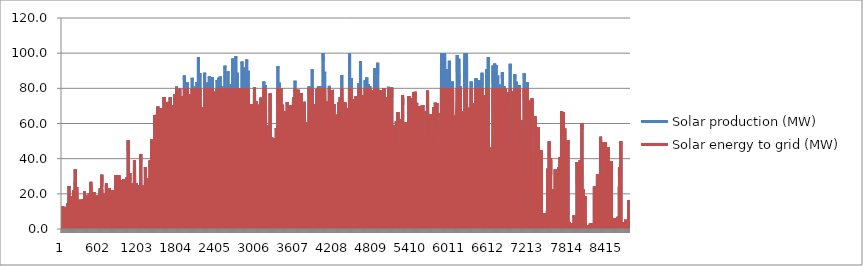
| Category | Solar production (MW) | Solar energy to grid (MW) |
|---|---|---|
| 0 | 0 | 0 |
| 1 | 0 | 0 |
| 2 | 0 | 0 |
| 3 | 0 | 0 |
| 4 | 0 | 0 |
| 5 | 0 | 0 |
| 6 | 0 | 0 |
| 7 | 0 | 0 |
| 8 | 0 | 0 |
| 9 | 7.3 | 7.3 |
| 10 | 10.9 | 10.9 |
| 11 | 12.8 | 12.8 |
| 12 | 12.2 | 12.2 |
| 13 | 9.4 | 9.4 |
| 14 | 4.1 | 4.1 |
| 15 | 0 | 0 |
| 16 | 0 | 0 |
| 17 | 0 | 0 |
| 18 | 0 | 0 |
| 19 | 0 | 0 |
| 20 | 0 | 0 |
| 21 | 0 | 0 |
| 22 | 0 | 0 |
| 23 | 0 | 0 |
| 24 | 0 | 0 |
| 25 | 0 | 0 |
| 26 | 0 | 0 |
| 27 | 0 | 0 |
| 28 | 0 | 0 |
| 29 | 0 | 0 |
| 30 | 0 | 0 |
| 31 | 0 | 0 |
| 32 | 0 | 0 |
| 33 | 6.6 | 6.6 |
| 34 | 9.9 | 9.9 |
| 35 | 11.7 | 11.7 |
| 36 | 11.2 | 11.2 |
| 37 | 8.7 | 8.7 |
| 38 | 3.9 | 3.9 |
| 39 | 0 | 0 |
| 40 | 0 | 0 |
| 41 | 0 | 0 |
| 42 | 0 | 0 |
| 43 | 0 | 0 |
| 44 | 0 | 0 |
| 45 | 0 | 0 |
| 46 | 0 | 0 |
| 47 | 0 | 0 |
| 48 | 0 | 0 |
| 49 | 0 | 0 |
| 50 | 0 | 0 |
| 51 | 0 | 0 |
| 52 | 0 | 0 |
| 53 | 0 | 0 |
| 54 | 0 | 0 |
| 55 | 0 | 0 |
| 56 | 0 | 0 |
| 57 | 7 | 7 |
| 58 | 10.4 | 10.4 |
| 59 | 12.3 | 12.3 |
| 60 | 11.9 | 11.9 |
| 61 | 9.1 | 9.1 |
| 62 | 4.3 | 4.3 |
| 63 | 0 | 0 |
| 64 | 0 | 0 |
| 65 | 0 | 0 |
| 66 | 0 | 0 |
| 67 | 0 | 0 |
| 68 | 0 | 0 |
| 69 | 0 | 0 |
| 70 | 0 | 0 |
| 71 | 0 | 0 |
| 72 | 0 | 0 |
| 73 | 0 | 0 |
| 74 | 0 | 0 |
| 75 | 0 | 0 |
| 76 | 0 | 0 |
| 77 | 0 | 0 |
| 78 | 0 | 0 |
| 79 | 0 | 0 |
| 80 | 0 | 0 |
| 81 | 8.6 | 8.6 |
| 82 | 12.4 | 12.4 |
| 83 | 14.7 | 14.7 |
| 84 | 14.2 | 14.2 |
| 85 | 11 | 11 |
| 86 | 5.4 | 5.4 |
| 87 | 0 | 0 |
| 88 | 0 | 0 |
| 89 | 0 | 0 |
| 90 | 0 | 0 |
| 91 | 0 | 0 |
| 92 | 0 | 0 |
| 93 | 0 | 0 |
| 94 | 0 | 0 |
| 95 | 0 | 0 |
| 96 | 0 | 0 |
| 97 | 0 | 0 |
| 98 | 0 | 0 |
| 99 | 0 | 0 |
| 100 | 0 | 0 |
| 101 | 0 | 0 |
| 102 | 0 | 0 |
| 103 | 0 | 0 |
| 104 | 0 | 0 |
| 105 | 15.3 | 15.3 |
| 106 | 21.1 | 21.1 |
| 107 | 24.4 | 24.4 |
| 108 | 23.7 | 23.7 |
| 109 | 18.8 | 18.8 |
| 110 | 10.1 | 10.1 |
| 111 | 0 | 0 |
| 112 | 0 | 0 |
| 113 | 0 | 0 |
| 114 | 0 | 0 |
| 115 | 0 | 0 |
| 116 | 0 | 0 |
| 117 | 0 | 0 |
| 118 | 0 | 0 |
| 119 | 0 | 0 |
| 120 | 0 | 0 |
| 121 | 0 | 0 |
| 122 | 0 | 0 |
| 123 | 0 | 0 |
| 124 | 0 | 0 |
| 125 | 0 | 0 |
| 126 | 0 | 0 |
| 127 | 0 | 0 |
| 128 | 0 | 0 |
| 129 | 11.1 | 11.1 |
| 130 | 15.8 | 15.8 |
| 131 | 18.4 | 18.4 |
| 132 | 17.9 | 17.9 |
| 133 | 14.1 | 14.1 |
| 134 | 7.6 | 7.6 |
| 135 | 0 | 0 |
| 136 | 0 | 0 |
| 137 | 0 | 0 |
| 138 | 0 | 0 |
| 139 | 0 | 0 |
| 140 | 0 | 0 |
| 141 | 0 | 0 |
| 142 | 0 | 0 |
| 143 | 0 | 0 |
| 144 | 0 | 0 |
| 145 | 0 | 0 |
| 146 | 0 | 0 |
| 147 | 0 | 0 |
| 148 | 0 | 0 |
| 149 | 0 | 0 |
| 150 | 0 | 0 |
| 151 | 0 | 0 |
| 152 | 0 | 0 |
| 153 | 8.3 | 8.3 |
| 154 | 12.2 | 12.2 |
| 155 | 14.3 | 14.3 |
| 156 | 14 | 14 |
| 157 | 11 | 11 |
| 158 | 5.9 | 5.9 |
| 159 | 0 | 0 |
| 160 | 0 | 0 |
| 161 | 0 | 0 |
| 162 | 0 | 0 |
| 163 | 0 | 0 |
| 164 | 0 | 0 |
| 165 | 0 | 0 |
| 166 | 0 | 0 |
| 167 | 0 | 0 |
| 168 | 0 | 0 |
| 169 | 0 | 0 |
| 170 | 0 | 0 |
| 171 | 0 | 0 |
| 172 | 0 | 0 |
| 173 | 0 | 0 |
| 174 | 0 | 0 |
| 175 | 0 | 0 |
| 176 | 0 | 0 |
| 177 | 13.4 | 13.4 |
| 178 | 18.8 | 18.8 |
| 179 | 21.9 | 21.9 |
| 180 | 21.3 | 21.3 |
| 181 | 17 | 17 |
| 182 | 9.6 | 9.6 |
| 183 | 0 | 0 |
| 184 | 0 | 0 |
| 185 | 0 | 0 |
| 186 | 0 | 0 |
| 187 | 0 | 0 |
| 188 | 0 | 0 |
| 189 | 0 | 0 |
| 190 | 0 | 0 |
| 191 | 0 | 0 |
| 192 | 0 | 0 |
| 193 | 0 | 0 |
| 194 | 0 | 0 |
| 195 | 0 | 0 |
| 196 | 0 | 0 |
| 197 | 0 | 0 |
| 198 | 0 | 0 |
| 199 | 0 | 0 |
| 200 | 0 | 0 |
| 201 | 21.9 | 21.9 |
| 202 | 29.4 | 29.4 |
| 203 | 33.9 | 33.9 |
| 204 | 33 | 33 |
| 205 | 26.8 | 26.8 |
| 206 | 16 | 16 |
| 207 | 0 | 0 |
| 208 | 0 | 0 |
| 209 | 0 | 0 |
| 210 | 0 | 0 |
| 211 | 0 | 0 |
| 212 | 0 | 0 |
| 213 | 0 | 0 |
| 214 | 0 | 0 |
| 215 | 0 | 0 |
| 216 | 0 | 0 |
| 217 | 0 | 0 |
| 218 | 0 | 0 |
| 219 | 0 | 0 |
| 220 | 0 | 0 |
| 221 | 0 | 0 |
| 222 | 0 | 0 |
| 223 | 0 | 0 |
| 224 | 0 | 0 |
| 225 | 14.8 | 14.8 |
| 226 | 20.6 | 20.6 |
| 227 | 23.9 | 23.9 |
| 228 | 23.3 | 23.3 |
| 229 | 18.8 | 18.8 |
| 230 | 11.1 | 11.1 |
| 231 | 0 | 0 |
| 232 | 0 | 0 |
| 233 | 0 | 0 |
| 234 | 0 | 0 |
| 235 | 0 | 0 |
| 236 | 0 | 0 |
| 237 | 0 | 0 |
| 238 | 0 | 0 |
| 239 | 0 | 0 |
| 240 | 0 | 0 |
| 241 | 0 | 0 |
| 242 | 0 | 0 |
| 243 | 0 | 0 |
| 244 | 0 | 0 |
| 245 | 0 | 0 |
| 246 | 0 | 0 |
| 247 | 0 | 0 |
| 248 | 0 | 0 |
| 249 | 7.3 | 7.3 |
| 250 | 10.9 | 10.9 |
| 251 | 12.9 | 12.9 |
| 252 | 12.7 | 12.7 |
| 253 | 10.1 | 10.1 |
| 254 | 5.7 | 5.7 |
| 255 | 0 | 0 |
| 256 | 0 | 0 |
| 257 | 0 | 0 |
| 258 | 0 | 0 |
| 259 | 0 | 0 |
| 260 | 0 | 0 |
| 261 | 0 | 0 |
| 262 | 0 | 0 |
| 263 | 0 | 0 |
| 264 | 0 | 0 |
| 265 | 0 | 0 |
| 266 | 0 | 0 |
| 267 | 0 | 0 |
| 268 | 0 | 0 |
| 269 | 0 | 0 |
| 270 | 0 | 0 |
| 271 | 0 | 0 |
| 272 | 0 | 0 |
| 273 | 9.7 | 9.7 |
| 274 | 14 | 14 |
| 275 | 16.6 | 16.6 |
| 276 | 16.2 | 16.2 |
| 277 | 13 | 13 |
| 278 | 7.7 | 7.7 |
| 279 | 0 | 0 |
| 280 | 0 | 0 |
| 281 | 0 | 0 |
| 282 | 0 | 0 |
| 283 | 0 | 0 |
| 284 | 0 | 0 |
| 285 | 0 | 0 |
| 286 | 0 | 0 |
| 287 | 0 | 0 |
| 288 | 0 | 0 |
| 289 | 0 | 0 |
| 290 | 0 | 0 |
| 291 | 0 | 0 |
| 292 | 0 | 0 |
| 293 | 0 | 0 |
| 294 | 0 | 0 |
| 295 | 0 | 0 |
| 296 | 0 | 0 |
| 297 | 9.4 | 9.4 |
| 298 | 13.6 | 13.6 |
| 299 | 16 | 16 |
| 300 | 15.7 | 15.7 |
| 301 | 12.7 | 12.7 |
| 302 | 7.6 | 7.6 |
| 303 | 0 | 0 |
| 304 | 0 | 0 |
| 305 | 0 | 0 |
| 306 | 0 | 0 |
| 307 | 0 | 0 |
| 308 | 0 | 0 |
| 309 | 0 | 0 |
| 310 | 0 | 0 |
| 311 | 0 | 0 |
| 312 | 0 | 0 |
| 313 | 0 | 0 |
| 314 | 0 | 0 |
| 315 | 0 | 0 |
| 316 | 0 | 0 |
| 317 | 0 | 0 |
| 318 | 0 | 0 |
| 319 | 0 | 0 |
| 320 | 0 | 0 |
| 321 | 10 | 10 |
| 322 | 14.3 | 14.3 |
| 323 | 16.9 | 16.9 |
| 324 | 16.7 | 16.7 |
| 325 | 13.4 | 13.4 |
| 326 | 8.1 | 8.1 |
| 327 | 0 | 0 |
| 328 | 0 | 0 |
| 329 | 0 | 0 |
| 330 | 0 | 0 |
| 331 | 0 | 0 |
| 332 | 0 | 0 |
| 333 | 0 | 0 |
| 334 | 0 | 0 |
| 335 | 0 | 0 |
| 336 | 0 | 0 |
| 337 | 0 | 0 |
| 338 | 0 | 0 |
| 339 | 0 | 0 |
| 340 | 0 | 0 |
| 341 | 0 | 0 |
| 342 | 0 | 0 |
| 343 | 0 | 0 |
| 344 | 0 | 0 |
| 345 | 13 | 13 |
| 346 | 18.3 | 18.3 |
| 347 | 21.4 | 21.4 |
| 348 | 21.1 | 21.1 |
| 349 | 17.2 | 17.2 |
| 350 | 10.7 | 10.7 |
| 351 | 0 | 0 |
| 352 | 0 | 0 |
| 353 | 0 | 0 |
| 354 | 0 | 0 |
| 355 | 0 | 0 |
| 356 | 0 | 0 |
| 357 | 0 | 0 |
| 358 | 0 | 0 |
| 359 | 0 | 0 |
| 360 | 0 | 0 |
| 361 | 0 | 0 |
| 362 | 0 | 0 |
| 363 | 0 | 0 |
| 364 | 0 | 0 |
| 365 | 0 | 0 |
| 366 | 0 | 0 |
| 367 | 0 | 0 |
| 368 | 0 | 0 |
| 369 | 11.3 | 11.3 |
| 370 | 16.1 | 16.1 |
| 371 | 18.9 | 18.9 |
| 372 | 18.7 | 18.7 |
| 373 | 15.2 | 15.2 |
| 374 | 9.4 | 9.4 |
| 375 | 0 | 0 |
| 376 | 0 | 0 |
| 377 | 0 | 0 |
| 378 | 0 | 0 |
| 379 | 0 | 0 |
| 380 | 0 | 0 |
| 381 | 0 | 0 |
| 382 | 0 | 0 |
| 383 | 0 | 0 |
| 384 | 0 | 0 |
| 385 | 0 | 0 |
| 386 | 0 | 0 |
| 387 | 0 | 0 |
| 388 | 0 | 0 |
| 389 | 0 | 0 |
| 390 | 0 | 0 |
| 391 | 0 | 0 |
| 392 | 0 | 0 |
| 393 | 9.2 | 9.2 |
| 394 | 13.3 | 13.3 |
| 395 | 15.8 | 15.8 |
| 396 | 15.6 | 15.6 |
| 397 | 12.7 | 12.7 |
| 398 | 7.8 | 7.8 |
| 399 | 0 | 0 |
| 400 | 0 | 0 |
| 401 | 0 | 0 |
| 402 | 0 | 0 |
| 403 | 0 | 0 |
| 404 | 0 | 0 |
| 405 | 0 | 0 |
| 406 | 0 | 0 |
| 407 | 0 | 0 |
| 408 | 0 | 0 |
| 409 | 0 | 0 |
| 410 | 0 | 0 |
| 411 | 0 | 0 |
| 412 | 0 | 0 |
| 413 | 0 | 0 |
| 414 | 0 | 0 |
| 415 | 0 | 0 |
| 416 | 0 | 0 |
| 417 | 12.1 | 12.1 |
| 418 | 17.2 | 17.2 |
| 419 | 20.2 | 20.2 |
| 420 | 20 | 20 |
| 421 | 16.4 | 16.4 |
| 422 | 10.4 | 10.4 |
| 423 | 0 | 0 |
| 424 | 0 | 0 |
| 425 | 0 | 0 |
| 426 | 0 | 0 |
| 427 | 0 | 0 |
| 428 | 0 | 0 |
| 429 | 0 | 0 |
| 430 | 0 | 0 |
| 431 | 0 | 0 |
| 432 | 0 | 0 |
| 433 | 0 | 0 |
| 434 | 0 | 0 |
| 435 | 0 | 0 |
| 436 | 0 | 0 |
| 437 | 0 | 0 |
| 438 | 0 | 0 |
| 439 | 0 | 0 |
| 440 | 0 | 0 |
| 441 | 16.4 | 16.4 |
| 442 | 22.9 | 22.9 |
| 443 | 26.8 | 26.8 |
| 444 | 26.4 | 26.4 |
| 445 | 21.9 | 21.9 |
| 446 | 14.3 | 14.3 |
| 447 | 0 | 0 |
| 448 | 0 | 0 |
| 449 | 0 | 0 |
| 450 | 0 | 0 |
| 451 | 0 | 0 |
| 452 | 0 | 0 |
| 453 | 0 | 0 |
| 454 | 0 | 0 |
| 455 | 0 | 0 |
| 456 | 0 | 0 |
| 457 | 0 | 0 |
| 458 | 0 | 0 |
| 459 | 0 | 0 |
| 460 | 0 | 0 |
| 461 | 0 | 0 |
| 462 | 0 | 0 |
| 463 | 0 | 0 |
| 464 | 0 | 0 |
| 465 | 8.3 | 8.3 |
| 466 | 12.2 | 12.2 |
| 467 | 14.4 | 14.4 |
| 468 | 14.2 | 14.2 |
| 469 | 11.7 | 11.7 |
| 470 | 7.4 | 7.4 |
| 471 | 0 | 0 |
| 472 | 0 | 0 |
| 473 | 0 | 0 |
| 474 | 0 | 0 |
| 475 | 0 | 0 |
| 476 | 0 | 0 |
| 477 | 0 | 0 |
| 478 | 0 | 0 |
| 479 | 0 | 0 |
| 480 | 0 | 0 |
| 481 | 0 | 0 |
| 482 | 0 | 0 |
| 483 | 0 | 0 |
| 484 | 0 | 0 |
| 485 | 0 | 0 |
| 486 | 0 | 0 |
| 487 | 0 | 0 |
| 488 | 0 | 0 |
| 489 | 12.6 | 12.6 |
| 490 | 17.8 | 17.8 |
| 491 | 21 | 21 |
| 492 | 20.8 | 20.8 |
| 493 | 17.2 | 17.2 |
| 494 | 11.2 | 11.2 |
| 495 | 0 | 0 |
| 496 | 0 | 0 |
| 497 | 0 | 0 |
| 498 | 0 | 0 |
| 499 | 0 | 0 |
| 500 | 0 | 0 |
| 501 | 0 | 0 |
| 502 | 0 | 0 |
| 503 | 0 | 0 |
| 504 | 0 | 0 |
| 505 | 0 | 0 |
| 506 | 0 | 0 |
| 507 | 0 | 0 |
| 508 | 0 | 0 |
| 509 | 0 | 0 |
| 510 | 0 | 0 |
| 511 | 0 | 0 |
| 512 | 0 | 0 |
| 513 | 10.3 | 10.3 |
| 514 | 14.9 | 14.9 |
| 515 | 17.6 | 17.6 |
| 516 | 17.4 | 17.4 |
| 517 | 14.4 | 14.4 |
| 518 | 9.4 | 9.4 |
| 519 | 0 | 0 |
| 520 | 0 | 0 |
| 521 | 0 | 0 |
| 522 | 0 | 0 |
| 523 | 0 | 0 |
| 524 | 0 | 0 |
| 525 | 0 | 0 |
| 526 | 0 | 0 |
| 527 | 0 | 0 |
| 528 | 0 | 0 |
| 529 | 0 | 0 |
| 530 | 0 | 0 |
| 531 | 0 | 0 |
| 532 | 0 | 0 |
| 533 | 0 | 0 |
| 534 | 0 | 0 |
| 535 | 0 | 0 |
| 536 | 0 | 0 |
| 537 | 11.4 | 11.4 |
| 538 | 16.3 | 16.3 |
| 539 | 19.2 | 19.2 |
| 540 | 19.1 | 19.1 |
| 541 | 15.9 | 15.9 |
| 542 | 10.4 | 10.4 |
| 543 | 1.6 | 1.6 |
| 544 | 0 | 0 |
| 545 | 0 | 0 |
| 546 | 0 | 0 |
| 547 | 0 | 0 |
| 548 | 0 | 0 |
| 549 | 0 | 0 |
| 550 | 0 | 0 |
| 551 | 0 | 0 |
| 552 | 0 | 0 |
| 553 | 0 | 0 |
| 554 | 0 | 0 |
| 555 | 0 | 0 |
| 556 | 0 | 0 |
| 557 | 0 | 0 |
| 558 | 0 | 0 |
| 559 | 0 | 0 |
| 560 | 0 | 0 |
| 561 | 9.7 | 9.7 |
| 562 | 14 | 14 |
| 563 | 16.6 | 16.6 |
| 564 | 16.4 | 16.4 |
| 565 | 13.7 | 13.7 |
| 566 | 9 | 9 |
| 567 | 2 | 2 |
| 568 | 0 | 0 |
| 569 | 0 | 0 |
| 570 | 0 | 0 |
| 571 | 0 | 0 |
| 572 | 0 | 0 |
| 573 | 0 | 0 |
| 574 | 0 | 0 |
| 575 | 0 | 0 |
| 576 | 0 | 0 |
| 577 | 0 | 0 |
| 578 | 0 | 0 |
| 579 | 0 | 0 |
| 580 | 0 | 0 |
| 581 | 0 | 0 |
| 582 | 0 | 0 |
| 583 | 0 | 0 |
| 584 | 0 | 0 |
| 585 | 14 | 14 |
| 586 | 19.7 | 19.7 |
| 587 | 23.1 | 23.1 |
| 588 | 23 | 23 |
| 589 | 19.3 | 19.3 |
| 590 | 13 | 13 |
| 591 | 3.9 | 3.9 |
| 592 | 0 | 0 |
| 593 | 0 | 0 |
| 594 | 0 | 0 |
| 595 | 0 | 0 |
| 596 | 0 | 0 |
| 597 | 0 | 0 |
| 598 | 0 | 0 |
| 599 | 0 | 0 |
| 600 | 0 | 0 |
| 601 | 0 | 0 |
| 602 | 0 | 0 |
| 603 | 0 | 0 |
| 604 | 0 | 0 |
| 605 | 0 | 0 |
| 606 | 0 | 0 |
| 607 | 0 | 0 |
| 608 | 0 | 0 |
| 609 | 19.2 | 19.2 |
| 610 | 26.6 | 26.6 |
| 611 | 30.9 | 30.9 |
| 612 | 30.8 | 30.8 |
| 613 | 26 | 26 |
| 614 | 17.8 | 17.8 |
| 615 | 6.4 | 6.4 |
| 616 | 0 | 0 |
| 617 | 0 | 0 |
| 618 | 0 | 0 |
| 619 | 0 | 0 |
| 620 | 0 | 0 |
| 621 | 0 | 0 |
| 622 | 0 | 0 |
| 623 | 0 | 0 |
| 624 | 0 | 0 |
| 625 | 0 | 0 |
| 626 | 0 | 0 |
| 627 | 0 | 0 |
| 628 | 0 | 0 |
| 629 | 0 | 0 |
| 630 | 0 | 0 |
| 631 | 0 | 0 |
| 632 | 0 | 0 |
| 633 | 12.1 | 12.1 |
| 634 | 17.2 | 17.2 |
| 635 | 20.2 | 20.2 |
| 636 | 20.1 | 20.1 |
| 637 | 17 | 17 |
| 638 | 11.4 | 11.4 |
| 639 | 4.2 | 4.2 |
| 640 | 0 | 0 |
| 641 | 0 | 0 |
| 642 | 0 | 0 |
| 643 | 0 | 0 |
| 644 | 0 | 0 |
| 645 | 0 | 0 |
| 646 | 0 | 0 |
| 647 | 0 | 0 |
| 648 | 0 | 0 |
| 649 | 0 | 0 |
| 650 | 0 | 0 |
| 651 | 0 | 0 |
| 652 | 0 | 0 |
| 653 | 0 | 0 |
| 654 | 0 | 0 |
| 655 | 0 | 0 |
| 656 | 0 | 0 |
| 657 | 9.2 | 9.2 |
| 658 | 13.3 | 13.3 |
| 659 | 15.8 | 15.8 |
| 660 | 15.7 | 15.7 |
| 661 | 13.2 | 13.2 |
| 662 | 8.8 | 8.8 |
| 663 | 3.3 | 3.3 |
| 664 | 0 | 0 |
| 665 | 0 | 0 |
| 666 | 0 | 0 |
| 667 | 0 | 0 |
| 668 | 0 | 0 |
| 669 | 0 | 0 |
| 670 | 0 | 0 |
| 671 | 0 | 0 |
| 672 | 0 | 0 |
| 673 | 0 | 0 |
| 674 | 0 | 0 |
| 675 | 0 | 0 |
| 676 | 0 | 0 |
| 677 | 0 | 0 |
| 678 | 0 | 0 |
| 679 | 0 | 0 |
| 680 | 0 | 0 |
| 681 | 16 | 16 |
| 682 | 22.4 | 22.4 |
| 683 | 26.2 | 26.2 |
| 684 | 26.1 | 26.1 |
| 685 | 22.2 | 22.2 |
| 686 | 15.3 | 15.3 |
| 687 | 6.8 | 6.8 |
| 688 | 0 | 0 |
| 689 | 0 | 0 |
| 690 | 0 | 0 |
| 691 | 0 | 0 |
| 692 | 0 | 0 |
| 693 | 0 | 0 |
| 694 | 0 | 0 |
| 695 | 0 | 0 |
| 696 | 0 | 0 |
| 697 | 0 | 0 |
| 698 | 0 | 0 |
| 699 | 0 | 0 |
| 700 | 0 | 0 |
| 701 | 0 | 0 |
| 702 | 0 | 0 |
| 703 | 0 | 0 |
| 704 | 7 | 7 |
| 705 | 11.1 | 11.1 |
| 706 | 15.9 | 15.9 |
| 707 | 18.6 | 18.6 |
| 708 | 18.6 | 18.6 |
| 709 | 15.8 | 15.8 |
| 710 | 10.8 | 10.8 |
| 711 | 4.7 | 4.7 |
| 712 | 0 | 0 |
| 713 | 0 | 0 |
| 714 | 0 | 0 |
| 715 | 0 | 0 |
| 716 | 0 | 0 |
| 717 | 0 | 0 |
| 718 | 0 | 0 |
| 719 | 0 | 0 |
| 720 | 0 | 0 |
| 721 | 0 | 0 |
| 722 | 0 | 0 |
| 723 | 0 | 0 |
| 724 | 0 | 0 |
| 725 | 0 | 0 |
| 726 | 0 | 0 |
| 727 | 0 | 0 |
| 728 | 9.3 | 9.3 |
| 729 | 14.2 | 14.2 |
| 730 | 20.1 | 20.1 |
| 731 | 23.3 | 23.3 |
| 732 | 23.3 | 23.3 |
| 733 | 19.9 | 19.9 |
| 734 | 13.9 | 13.9 |
| 735 | 6.4 | 6.4 |
| 736 | 0 | 0 |
| 737 | 0 | 0 |
| 738 | 0 | 0 |
| 739 | 0 | 0 |
| 740 | 0 | 0 |
| 741 | 0 | 0 |
| 742 | 0 | 0 |
| 743 | 0 | 0 |
| 744 | 0 | 0 |
| 745 | 0 | 0 |
| 746 | 0 | 0 |
| 747 | 0 | 0 |
| 748 | 0 | 0 |
| 749 | 0 | 0 |
| 750 | 0 | 0 |
| 751 | 0 | 0 |
| 752 | 7.7 | 7.7 |
| 753 | 12.3 | 12.3 |
| 754 | 17.4 | 17.4 |
| 755 | 20.3 | 20.3 |
| 756 | 20.3 | 20.3 |
| 757 | 17.4 | 17.4 |
| 758 | 12.1 | 12.1 |
| 759 | 5.7 | 5.7 |
| 760 | 0 | 0 |
| 761 | 0 | 0 |
| 762 | 0 | 0 |
| 763 | 0 | 0 |
| 764 | 0 | 0 |
| 765 | 0 | 0 |
| 766 | 0 | 0 |
| 767 | 0 | 0 |
| 768 | 0 | 0 |
| 769 | 0 | 0 |
| 770 | 0 | 0 |
| 771 | 0 | 0 |
| 772 | 0 | 0 |
| 773 | 0 | 0 |
| 774 | 0 | 0 |
| 775 | 0 | 0 |
| 776 | 8.2 | 8.2 |
| 777 | 13.4 | 13.4 |
| 778 | 18.9 | 18.9 |
| 779 | 22 | 22 |
| 780 | 22 | 22 |
| 781 | 18.9 | 18.9 |
| 782 | 13.2 | 13.2 |
| 783 | 6.3 | 6.3 |
| 784 | 0 | 0 |
| 785 | 0 | 0 |
| 786 | 0 | 0 |
| 787 | 0 | 0 |
| 788 | 0 | 0 |
| 789 | 0 | 0 |
| 790 | 0 | 0 |
| 791 | 0 | 0 |
| 792 | 0 | 0 |
| 793 | 0 | 0 |
| 794 | 0 | 0 |
| 795 | 0 | 0 |
| 796 | 0 | 0 |
| 797 | 0 | 0 |
| 798 | 0 | 0 |
| 799 | 0 | 0 |
| 800 | 6.9 | 6.9 |
| 801 | 11.7 | 11.7 |
| 802 | 16.4 | 16.4 |
| 803 | 19.1 | 19.1 |
| 804 | 19.2 | 19.2 |
| 805 | 16.4 | 16.4 |
| 806 | 11.6 | 11.6 |
| 807 | 5.6 | 5.6 |
| 808 | 0 | 0 |
| 809 | 0 | 0 |
| 810 | 0 | 0 |
| 811 | 0 | 0 |
| 812 | 0 | 0 |
| 813 | 0 | 0 |
| 814 | 0 | 0 |
| 815 | 0 | 0 |
| 816 | 0 | 0 |
| 817 | 0 | 0 |
| 818 | 0 | 0 |
| 819 | 0 | 0 |
| 820 | 0 | 0 |
| 821 | 0 | 0 |
| 822 | 0 | 0 |
| 823 | 0 | 0 |
| 824 | 12.2 | 12.2 |
| 825 | 19.2 | 19.2 |
| 826 | 26.4 | 26.4 |
| 827 | 30.7 | 30.7 |
| 828 | 30.7 | 30.7 |
| 829 | 26.4 | 26.4 |
| 830 | 18.9 | 18.9 |
| 831 | 9.9 | 9.9 |
| 832 | 0 | 0 |
| 833 | 0 | 0 |
| 834 | 0 | 0 |
| 835 | 0 | 0 |
| 836 | 0 | 0 |
| 837 | 0 | 0 |
| 838 | 0 | 0 |
| 839 | 0 | 0 |
| 840 | 0 | 0 |
| 841 | 0 | 0 |
| 842 | 0 | 0 |
| 843 | 0 | 0 |
| 844 | 0 | 0 |
| 845 | 0 | 0 |
| 846 | 0 | 0 |
| 847 | 0 | 0 |
| 848 | 4.6 | 4.6 |
| 849 | 8.4 | 8.4 |
| 850 | 12 | 12 |
| 851 | 14.1 | 14.1 |
| 852 | 14.1 | 14.1 |
| 853 | 12.1 | 12.1 |
| 854 | 8.4 | 8.4 |
| 855 | 4.1 | 4.1 |
| 856 | 0 | 0 |
| 857 | 0 | 0 |
| 858 | 0 | 0 |
| 859 | 0 | 0 |
| 860 | 0 | 0 |
| 861 | 0 | 0 |
| 862 | 0 | 0 |
| 863 | 0 | 0 |
| 864 | 0 | 0 |
| 865 | 0 | 0 |
| 866 | 0 | 0 |
| 867 | 0 | 0 |
| 868 | 0 | 0 |
| 869 | 0 | 0 |
| 870 | 0 | 0 |
| 871 | 0 | 0 |
| 872 | 11.9 | 11.9 |
| 873 | 19.2 | 19.2 |
| 874 | 26.4 | 26.4 |
| 875 | 30.6 | 30.6 |
| 876 | 30.6 | 30.6 |
| 877 | 26.4 | 26.4 |
| 878 | 19.1 | 19.1 |
| 879 | 10.2 | 10.2 |
| 880 | 0 | 0 |
| 881 | 0 | 0 |
| 882 | 0 | 0 |
| 883 | 0 | 0 |
| 884 | 0 | 0 |
| 885 | 0 | 0 |
| 886 | 0 | 0 |
| 887 | 0 | 0 |
| 888 | 0 | 0 |
| 889 | 0 | 0 |
| 890 | 0 | 0 |
| 891 | 0 | 0 |
| 892 | 0 | 0 |
| 893 | 0 | 0 |
| 894 | 0 | 0 |
| 895 | 0 | 0 |
| 896 | 10.7 | 10.7 |
| 897 | 17.6 | 17.6 |
| 898 | 24.2 | 24.2 |
| 899 | 27.9 | 27.9 |
| 900 | 27.9 | 27.9 |
| 901 | 24.2 | 24.2 |
| 902 | 17.6 | 17.6 |
| 903 | 9.4 | 9.4 |
| 904 | 0 | 0 |
| 905 | 0 | 0 |
| 906 | 0 | 0 |
| 907 | 0 | 0 |
| 908 | 0 | 0 |
| 909 | 0 | 0 |
| 910 | 0 | 0 |
| 911 | 0 | 0 |
| 912 | 0 | 0 |
| 913 | 0 | 0 |
| 914 | 0 | 0 |
| 915 | 0 | 0 |
| 916 | 0 | 0 |
| 917 | 0 | 0 |
| 918 | 0 | 0 |
| 919 | 0 | 0 |
| 920 | 4.9 | 4.9 |
| 921 | 9 | 9 |
| 922 | 12.7 | 12.7 |
| 923 | 14.7 | 14.7 |
| 924 | 14.8 | 14.8 |
| 925 | 12.8 | 12.8 |
| 926 | 9.1 | 9.1 |
| 927 | 4.6 | 4.6 |
| 928 | 0 | 0 |
| 929 | 0 | 0 |
| 930 | 0 | 0 |
| 931 | 0 | 0 |
| 932 | 0 | 0 |
| 933 | 0 | 0 |
| 934 | 0 | 0 |
| 935 | 0 | 0 |
| 936 | 0 | 0 |
| 937 | 0 | 0 |
| 938 | 0 | 0 |
| 939 | 0 | 0 |
| 940 | 0 | 0 |
| 941 | 0 | 0 |
| 942 | 0 | 0 |
| 943 | 0 | 0 |
| 944 | 10.8 | 10.8 |
| 945 | 18.1 | 18.1 |
| 946 | 24.8 | 24.8 |
| 947 | 28.4 | 28.4 |
| 948 | 28.4 | 28.4 |
| 949 | 24.9 | 24.9 |
| 950 | 18.1 | 18.1 |
| 951 | 9.9 | 9.9 |
| 952 | 0 | 0 |
| 953 | 0 | 0 |
| 954 | 0 | 0 |
| 955 | 0 | 0 |
| 956 | 0 | 0 |
| 957 | 0 | 0 |
| 958 | 0 | 0 |
| 959 | 0 | 0 |
| 960 | 0 | 0 |
| 961 | 0 | 0 |
| 962 | 0 | 0 |
| 963 | 0 | 0 |
| 964 | 0 | 0 |
| 965 | 0 | 0 |
| 966 | 0 | 0 |
| 967 | 0 | 0 |
| 968 | 8.3 | 8.3 |
| 969 | 14.4 | 14.4 |
| 970 | 19.9 | 19.9 |
| 971 | 22.9 | 22.9 |
| 972 | 22.9 | 22.9 |
| 973 | 20 | 20 |
| 974 | 14.6 | 14.6 |
| 975 | 7.9 | 7.9 |
| 976 | 0 | 0 |
| 977 | 0 | 0 |
| 978 | 0 | 0 |
| 979 | 0 | 0 |
| 980 | 0 | 0 |
| 981 | 0 | 0 |
| 982 | 0 | 0 |
| 983 | 0 | 0 |
| 984 | 0 | 0 |
| 985 | 0 | 0 |
| 986 | 0 | 0 |
| 987 | 0 | 0 |
| 988 | 0 | 0 |
| 989 | 0 | 0 |
| 990 | 0 | 0 |
| 991 | 0 | 0 |
| 992 | 11.2 | 11.2 |
| 993 | 18.9 | 18.9 |
| 994 | 25.6 | 25.6 |
| 995 | 29.3 | 29.3 |
| 996 | 29.4 | 29.4 |
| 997 | 25.8 | 25.8 |
| 998 | 19 | 19 |
| 999 | 10.7 | 10.7 |
| 1000 | 0 | 0 |
| 1001 | 0 | 0 |
| 1002 | 0 | 0 |
| 1003 | 0 | 0 |
| 1004 | 0 | 0 |
| 1005 | 0 | 0 |
| 1006 | 0 | 0 |
| 1007 | 0 | 0 |
| 1008 | 0 | 0 |
| 1009 | 0 | 0 |
| 1010 | 0 | 0 |
| 1011 | 0 | 0 |
| 1012 | 0 | 0 |
| 1013 | 0 | 0 |
| 1014 | 0 | 0 |
| 1015 | 0 | 0 |
| 1016 | 21 | 21 |
| 1017 | 33.3 | 33.3 |
| 1018 | 44.3 | 44.3 |
| 1019 | 50.4 | 50.4 |
| 1020 | 50.4 | 50.4 |
| 1021 | 44.4 | 44.4 |
| 1022 | 33.3 | 33.3 |
| 1023 | 19.4 | 19.4 |
| 1024 | 0 | 0 |
| 1025 | 0 | 0 |
| 1026 | 0 | 0 |
| 1027 | 0 | 0 |
| 1028 | 0 | 0 |
| 1029 | 0 | 0 |
| 1030 | 0 | 0 |
| 1031 | 0 | 0 |
| 1032 | 0 | 0 |
| 1033 | 0 | 0 |
| 1034 | 0 | 0 |
| 1035 | 0 | 0 |
| 1036 | 0 | 0 |
| 1037 | 0 | 0 |
| 1038 | 0 | 0 |
| 1039 | 0 | 0 |
| 1040 | 12.6 | 12.6 |
| 1041 | 20.8 | 20.8 |
| 1042 | 28 | 28 |
| 1043 | 31.9 | 31.9 |
| 1044 | 32 | 32 |
| 1045 | 28.1 | 28.1 |
| 1046 | 21 | 21 |
| 1047 | 12 | 12 |
| 1048 | 0 | 0 |
| 1049 | 0 | 0 |
| 1050 | 0 | 0 |
| 1051 | 0 | 0 |
| 1052 | 0 | 0 |
| 1053 | 0 | 0 |
| 1054 | 0 | 0 |
| 1055 | 0 | 0 |
| 1056 | 0 | 0 |
| 1057 | 0 | 0 |
| 1058 | 0 | 0 |
| 1059 | 0 | 0 |
| 1060 | 0 | 0 |
| 1061 | 0 | 0 |
| 1062 | 0 | 0 |
| 1063 | 0 | 0 |
| 1064 | 9.9 | 9.9 |
| 1065 | 16.8 | 16.8 |
| 1066 | 22.7 | 22.7 |
| 1067 | 25.9 | 25.9 |
| 1068 | 25.9 | 25.9 |
| 1069 | 22.8 | 22.8 |
| 1070 | 17 | 17 |
| 1071 | 9.7 | 9.7 |
| 1072 | 0 | 0 |
| 1073 | 0 | 0 |
| 1074 | 0 | 0 |
| 1075 | 0 | 0 |
| 1076 | 0 | 0 |
| 1077 | 0 | 0 |
| 1078 | 0 | 0 |
| 1079 | 0 | 0 |
| 1080 | 0 | 0 |
| 1081 | 0 | 0 |
| 1082 | 0 | 0 |
| 1083 | 0 | 0 |
| 1084 | 0 | 0 |
| 1085 | 0 | 0 |
| 1086 | 0 | 0 |
| 1087 | 0 | 0 |
| 1088 | 8.3 | 8.3 |
| 1089 | 14.4 | 14.4 |
| 1090 | 19.4 | 19.4 |
| 1091 | 22.2 | 22.2 |
| 1092 | 22.2 | 22.2 |
| 1093 | 19.7 | 19.7 |
| 1094 | 14.7 | 14.7 |
| 1095 | 8.3 | 8.3 |
| 1096 | 0 | 0 |
| 1097 | 0 | 0 |
| 1098 | 0 | 0 |
| 1099 | 0 | 0 |
| 1100 | 0 | 0 |
| 1101 | 0 | 0 |
| 1102 | 0 | 0 |
| 1103 | 0 | 0 |
| 1104 | 0 | 0 |
| 1105 | 0 | 0 |
| 1106 | 0 | 0 |
| 1107 | 0 | 0 |
| 1108 | 0 | 0 |
| 1109 | 0 | 0 |
| 1110 | 0 | 0 |
| 1111 | 0 | 0 |
| 1112 | 15.9 | 15.9 |
| 1113 | 26 | 26 |
| 1114 | 34.4 | 34.4 |
| 1115 | 39.1 | 39.1 |
| 1116 | 39.2 | 39.2 |
| 1117 | 34.7 | 34.7 |
| 1118 | 26.2 | 26.2 |
| 1119 | 15.6 | 15.6 |
| 1120 | 3.8 | 3.8 |
| 1121 | 0 | 0 |
| 1122 | 0 | 0 |
| 1123 | 0 | 0 |
| 1124 | 0 | 0 |
| 1125 | 0 | 0 |
| 1126 | 0 | 0 |
| 1127 | 0 | 0 |
| 1128 | 0 | 0 |
| 1129 | 0 | 0 |
| 1130 | 0 | 0 |
| 1131 | 0 | 0 |
| 1132 | 0 | 0 |
| 1133 | 0 | 0 |
| 1134 | 0 | 0 |
| 1135 | 0 | 0 |
| 1136 | 10.2 | 10.2 |
| 1137 | 17.1 | 17.1 |
| 1138 | 22.9 | 22.9 |
| 1139 | 26 | 26 |
| 1140 | 26.1 | 26.1 |
| 1141 | 23.1 | 23.1 |
| 1142 | 17.4 | 17.4 |
| 1143 | 10.1 | 10.1 |
| 1144 | 2.6 | 2.6 |
| 1145 | 0 | 0 |
| 1146 | 0 | 0 |
| 1147 | 0 | 0 |
| 1148 | 0 | 0 |
| 1149 | 0 | 0 |
| 1150 | 0 | 0 |
| 1151 | 0 | 0 |
| 1152 | 0 | 0 |
| 1153 | 0 | 0 |
| 1154 | 0 | 0 |
| 1155 | 0 | 0 |
| 1156 | 0 | 0 |
| 1157 | 0 | 0 |
| 1158 | 0 | 0 |
| 1159 | 0 | 0 |
| 1160 | 9.7 | 9.7 |
| 1161 | 16.2 | 16.2 |
| 1162 | 21.7 | 21.7 |
| 1163 | 24.7 | 24.7 |
| 1164 | 24.7 | 24.7 |
| 1165 | 21.9 | 21.9 |
| 1166 | 16.6 | 16.6 |
| 1167 | 9.7 | 9.7 |
| 1168 | 2.8 | 2.8 |
| 1169 | 0 | 0 |
| 1170 | 0 | 0 |
| 1171 | 0 | 0 |
| 1172 | 0 | 0 |
| 1173 | 0 | 0 |
| 1174 | 0 | 0 |
| 1175 | 0 | 0 |
| 1176 | 0 | 0 |
| 1177 | 0 | 0 |
| 1178 | 0 | 0 |
| 1179 | 0 | 0 |
| 1180 | 0 | 0 |
| 1181 | 0 | 0 |
| 1182 | 0 | 0 |
| 1183 | 0 | 0 |
| 1184 | 8.2 | 8.2 |
| 1185 | 13.9 | 13.9 |
| 1186 | 18.4 | 18.4 |
| 1187 | 20.9 | 20.9 |
| 1188 | 21 | 21 |
| 1189 | 18.6 | 18.6 |
| 1190 | 14.1 | 14.1 |
| 1191 | 8.3 | 8.3 |
| 1192 | 2.4 | 2.4 |
| 1193 | 0 | 0 |
| 1194 | 0 | 0 |
| 1195 | 0 | 0 |
| 1196 | 0 | 0 |
| 1197 | 0 | 0 |
| 1198 | 0 | 0 |
| 1199 | 0 | 0 |
| 1200 | 0 | 0 |
| 1201 | 0 | 0 |
| 1202 | 0 | 0 |
| 1203 | 0 | 0 |
| 1204 | 0 | 0 |
| 1205 | 0 | 0 |
| 1206 | 0 | 0 |
| 1207 | 0 | 0 |
| 1208 | 18 | 18 |
| 1209 | 29 | 29 |
| 1210 | 37.8 | 37.8 |
| 1211 | 42.7 | 42.7 |
| 1212 | 42.8 | 42.8 |
| 1213 | 38 | 38 |
| 1214 | 29.2 | 29.2 |
| 1215 | 17.9 | 17.9 |
| 1216 | 6.4 | 6.4 |
| 1217 | 0 | 0 |
| 1218 | 0 | 0 |
| 1219 | 0 | 0 |
| 1220 | 0 | 0 |
| 1221 | 0 | 0 |
| 1222 | 0 | 0 |
| 1223 | 0 | 0 |
| 1224 | 0 | 0 |
| 1225 | 0 | 0 |
| 1226 | 0 | 0 |
| 1227 | 0 | 0 |
| 1228 | 0 | 0 |
| 1229 | 0 | 0 |
| 1230 | 0 | 0 |
| 1231 | 0 | 0 |
| 1232 | 10.1 | 10.1 |
| 1233 | 16.8 | 16.8 |
| 1234 | 22 | 22 |
| 1235 | 24.9 | 24.9 |
| 1236 | 24.9 | 24.9 |
| 1237 | 22.2 | 22.2 |
| 1238 | 17 | 17 |
| 1239 | 10.2 | 10.2 |
| 1240 | 3.6 | 3.6 |
| 1241 | 0 | 0 |
| 1242 | 0 | 0 |
| 1243 | 0 | 0 |
| 1244 | 0 | 0 |
| 1245 | 0 | 0 |
| 1246 | 0 | 0 |
| 1247 | 0 | 0 |
| 1248 | 0 | 0 |
| 1249 | 0 | 0 |
| 1250 | 0 | 0 |
| 1251 | 0 | 0 |
| 1252 | 0 | 0 |
| 1253 | 0 | 0 |
| 1254 | 0 | 0 |
| 1255 | 0 | 0 |
| 1256 | 10.2 | 10.2 |
| 1257 | 16.8 | 16.8 |
| 1258 | 22 | 22 |
| 1259 | 24.8 | 24.8 |
| 1260 | 24.9 | 24.9 |
| 1261 | 22.1 | 22.1 |
| 1262 | 17 | 17 |
| 1263 | 10.3 | 10.3 |
| 1264 | 3.7 | 3.7 |
| 1265 | 0 | 0 |
| 1266 | 0 | 0 |
| 1267 | 0 | 0 |
| 1268 | 0 | 0 |
| 1269 | 0 | 0 |
| 1270 | 0 | 0 |
| 1271 | 0 | 0 |
| 1272 | 0 | 0 |
| 1273 | 0 | 0 |
| 1274 | 0 | 0 |
| 1275 | 0 | 0 |
| 1276 | 0 | 0 |
| 1277 | 0 | 0 |
| 1278 | 0 | 0 |
| 1279 | 8.8 | 8.8 |
| 1280 | 15 | 15 |
| 1281 | 24.1 | 24.1 |
| 1282 | 31.2 | 31.2 |
| 1283 | 35.1 | 35.1 |
| 1284 | 35.1 | 35.1 |
| 1285 | 31.4 | 31.4 |
| 1286 | 24.3 | 24.3 |
| 1287 | 15 | 15 |
| 1288 | 5.9 | 5.9 |
| 1289 | 0 | 0 |
| 1290 | 0 | 0 |
| 1291 | 0 | 0 |
| 1292 | 0 | 0 |
| 1293 | 0 | 0 |
| 1294 | 0 | 0 |
| 1295 | 0 | 0 |
| 1296 | 0 | 0 |
| 1297 | 0 | 0 |
| 1298 | 0 | 0 |
| 1299 | 0 | 0 |
| 1300 | 0 | 0 |
| 1301 | 0 | 0 |
| 1302 | 0 | 0 |
| 1303 | 6.3 | 6.3 |
| 1304 | 12.3 | 12.3 |
| 1305 | 19.9 | 19.9 |
| 1306 | 25.8 | 25.8 |
| 1307 | 28.9 | 28.9 |
| 1308 | 29 | 29 |
| 1309 | 25.9 | 25.9 |
| 1310 | 20.1 | 20.1 |
| 1311 | 12.4 | 12.4 |
| 1312 | 4.9 | 4.9 |
| 1313 | 0 | 0 |
| 1314 | 0 | 0 |
| 1315 | 0 | 0 |
| 1316 | 0 | 0 |
| 1317 | 0 | 0 |
| 1318 | 0 | 0 |
| 1319 | 0 | 0 |
| 1320 | 0 | 0 |
| 1321 | 0 | 0 |
| 1322 | 0 | 0 |
| 1323 | 0 | 0 |
| 1324 | 0 | 0 |
| 1325 | 0 | 0 |
| 1326 | 0 | 0 |
| 1327 | 5.6 | 5.6 |
| 1328 | 11.4 | 11.4 |
| 1329 | 18.3 | 18.3 |
| 1330 | 23.8 | 23.8 |
| 1331 | 26.7 | 26.7 |
| 1332 | 26.7 | 26.7 |
| 1333 | 23.9 | 23.9 |
| 1334 | 18.6 | 18.6 |
| 1335 | 11.6 | 11.6 |
| 1336 | 4.6 | 4.6 |
| 1337 | 0 | 0 |
| 1338 | 0 | 0 |
| 1339 | 0 | 0 |
| 1340 | 0 | 0 |
| 1341 | 0 | 0 |
| 1342 | 0 | 0 |
| 1343 | 0 | 0 |
| 1344 | 0 | 0 |
| 1345 | 0 | 0 |
| 1346 | 0 | 0 |
| 1347 | 0 | 0 |
| 1348 | 0 | 0 |
| 1349 | 0 | 0 |
| 1350 | 0 | 0 |
| 1351 | 8.9 | 8.9 |
| 1352 | 17.3 | 17.3 |
| 1353 | 27.1 | 27.1 |
| 1354 | 34.8 | 34.8 |
| 1355 | 38.9 | 38.9 |
| 1356 | 39 | 39 |
| 1357 | 34.9 | 34.9 |
| 1358 | 27.3 | 27.3 |
| 1359 | 17.3 | 17.3 |
| 1360 | 7.3 | 7.3 |
| 1361 | 0 | 0 |
| 1362 | 0 | 0 |
| 1363 | 0 | 0 |
| 1364 | 0 | 0 |
| 1365 | 0 | 0 |
| 1366 | 0 | 0 |
| 1367 | 0 | 0 |
| 1368 | 0 | 0 |
| 1369 | 0 | 0 |
| 1370 | 0 | 0 |
| 1371 | 0 | 0 |
| 1372 | 0 | 0 |
| 1373 | 0 | 0 |
| 1374 | 0 | 0 |
| 1375 | 12.2 | 12.2 |
| 1376 | 23.2 | 23.2 |
| 1377 | 35.9 | 35.9 |
| 1378 | 45.7 | 45.7 |
| 1379 | 50.9 | 50.9 |
| 1380 | 51 | 51 |
| 1381 | 45.8 | 45.8 |
| 1382 | 36 | 36 |
| 1383 | 23.1 | 23.1 |
| 1384 | 10.2 | 10.2 |
| 1385 | 0 | 0 |
| 1386 | 0 | 0 |
| 1387 | 0 | 0 |
| 1388 | 0 | 0 |
| 1389 | 0 | 0 |
| 1390 | 0 | 0 |
| 1391 | 0 | 0 |
| 1392 | 0 | 0 |
| 1393 | 0 | 0 |
| 1394 | 0 | 0 |
| 1395 | 0 | 0 |
| 1396 | 0 | 0 |
| 1397 | 0 | 0 |
| 1398 | 0 | 0 |
| 1399 | 7.7 | 7.7 |
| 1400 | 15.9 | 15.9 |
| 1401 | 24.7 | 24.7 |
| 1402 | 31.4 | 31.4 |
| 1403 | 35.1 | 35.1 |
| 1404 | 35.1 | 35.1 |
| 1405 | 31.6 | 31.6 |
| 1406 | 24.8 | 24.8 |
| 1407 | 15.9 | 15.9 |
| 1408 | 6.9 | 6.9 |
| 1409 | 0 | 0 |
| 1410 | 0 | 0 |
| 1411 | 0 | 0 |
| 1412 | 0 | 0 |
| 1413 | 0 | 0 |
| 1414 | 0 | 0 |
| 1415 | 0 | 0 |
| 1416 | 0 | 0 |
| 1417 | 0 | 0 |
| 1418 | 0 | 0 |
| 1419 | 0 | 0 |
| 1420 | 0 | 0 |
| 1421 | 0 | 0 |
| 1422 | 0 | 0 |
| 1423 | 16.1 | 16.1 |
| 1424 | 30.6 | 30.6 |
| 1425 | 46.2 | 46.2 |
| 1426 | 58.3 | 58.3 |
| 1427 | 64.9 | 64.9 |
| 1428 | 64.9 | 64.9 |
| 1429 | 58.4 | 58.4 |
| 1430 | 46.2 | 46.2 |
| 1431 | 30.1 | 30.1 |
| 1432 | 13.9 | 13.9 |
| 1433 | 0 | 0 |
| 1434 | 0 | 0 |
| 1435 | 0 | 0 |
| 1436 | 0 | 0 |
| 1437 | 0 | 0 |
| 1438 | 0 | 0 |
| 1439 | 0 | 0 |
| 1440 | 0 | 0 |
| 1441 | 0 | 0 |
| 1442 | 0 | 0 |
| 1443 | 0 | 0 |
| 1444 | 0 | 0 |
| 1445 | 0 | 0 |
| 1446 | 0 | 0 |
| 1447 | 13.9 | 13.9 |
| 1448 | 27 | 27 |
| 1449 | 40.9 | 40.9 |
| 1450 | 51.4 | 51.4 |
| 1451 | 57.1 | 57.1 |
| 1452 | 57.1 | 57.1 |
| 1453 | 51.4 | 51.4 |
| 1454 | 40.8 | 40.8 |
| 1455 | 26.7 | 26.7 |
| 1456 | 12.3 | 12.3 |
| 1457 | 0 | 0 |
| 1458 | 0 | 0 |
| 1459 | 0 | 0 |
| 1460 | 0 | 0 |
| 1461 | 0 | 0 |
| 1462 | 0 | 0 |
| 1463 | 0 | 0 |
| 1464 | 0 | 0 |
| 1465 | 0 | 0 |
| 1466 | 0 | 0 |
| 1467 | 0 | 0 |
| 1468 | 0 | 0 |
| 1469 | 0 | 0 |
| 1470 | 0 | 0 |
| 1471 | 17.4 | 17.4 |
| 1472 | 33.4 | 33.4 |
| 1473 | 50 | 50 |
| 1474 | 62.8 | 62.8 |
| 1475 | 69.6 | 69.6 |
| 1476 | 69.4 | 69.4 |
| 1477 | 62.7 | 62.7 |
| 1478 | 49.9 | 49.9 |
| 1479 | 32.9 | 32.9 |
| 1480 | 15.6 | 15.6 |
| 1481 | 0 | 0 |
| 1482 | 0 | 0 |
| 1483 | 0 | 0 |
| 1484 | 0 | 0 |
| 1485 | 0 | 0 |
| 1486 | 0 | 0 |
| 1487 | 0 | 0 |
| 1488 | 0 | 0 |
| 1489 | 0 | 0 |
| 1490 | 0 | 0 |
| 1491 | 0 | 0 |
| 1492 | 0 | 0 |
| 1493 | 0 | 0 |
| 1494 | 0 | 0 |
| 1495 | 16.7 | 16.7 |
| 1496 | 32.2 | 32.2 |
| 1497 | 48.1 | 48.1 |
| 1498 | 60.2 | 60.2 |
| 1499 | 66.6 | 66.6 |
| 1500 | 66.6 | 66.6 |
| 1501 | 60.1 | 60.1 |
| 1502 | 47.9 | 47.9 |
| 1503 | 31.7 | 31.7 |
| 1504 | 15.1 | 15.1 |
| 1505 | 0 | 0 |
| 1506 | 0 | 0 |
| 1507 | 0 | 0 |
| 1508 | 0 | 0 |
| 1509 | 0 | 0 |
| 1510 | 0 | 0 |
| 1511 | 0 | 0 |
| 1512 | 0 | 0 |
| 1513 | 0 | 0 |
| 1514 | 0 | 0 |
| 1515 | 0 | 0 |
| 1516 | 0 | 0 |
| 1517 | 0 | 0 |
| 1518 | 0 | 0 |
| 1519 | 17.3 | 17.3 |
| 1520 | 33.6 | 33.6 |
| 1521 | 49.8 | 49.8 |
| 1522 | 62 | 62 |
| 1523 | 68.6 | 68.6 |
| 1524 | 68.6 | 68.6 |
| 1525 | 61.9 | 61.9 |
| 1526 | 49.4 | 49.4 |
| 1527 | 32.9 | 32.9 |
| 1528 | 15.9 | 15.9 |
| 1529 | 0 | 0 |
| 1530 | 0 | 0 |
| 1531 | 0 | 0 |
| 1532 | 0 | 0 |
| 1533 | 0 | 0 |
| 1534 | 0 | 0 |
| 1535 | 0 | 0 |
| 1536 | 0 | 0 |
| 1537 | 0 | 0 |
| 1538 | 0 | 0 |
| 1539 | 0 | 0 |
| 1540 | 0 | 0 |
| 1541 | 0 | 0 |
| 1542 | 0 | 0 |
| 1543 | 17.2 | 17.2 |
| 1544 | 33.2 | 33.2 |
| 1545 | 49.1 | 49.1 |
| 1546 | 61.1 | 61.1 |
| 1547 | 67.4 | 67.4 |
| 1548 | 67.3 | 67.3 |
| 1549 | 60.9 | 60.9 |
| 1550 | 48.7 | 48.7 |
| 1551 | 32.6 | 32.6 |
| 1552 | 15.8 | 15.8 |
| 1553 | 0 | 0 |
| 1554 | 0 | 0 |
| 1555 | 0 | 0 |
| 1556 | 0 | 0 |
| 1557 | 0 | 0 |
| 1558 | 0 | 0 |
| 1559 | 0 | 0 |
| 1560 | 0 | 0 |
| 1561 | 0 | 0 |
| 1562 | 0 | 0 |
| 1563 | 0 | 0 |
| 1564 | 0 | 0 |
| 1565 | 0 | 0 |
| 1566 | 0 | 0 |
| 1567 | 19.6 | 19.6 |
| 1568 | 37.4 | 37.4 |
| 1569 | 55 | 55 |
| 1570 | 68.1 | 68.1 |
| 1571 | 75.1 | 75.1 |
| 1572 | 75 | 75 |
| 1573 | 67.9 | 67.9 |
| 1574 | 54.4 | 54.4 |
| 1575 | 36.7 | 36.7 |
| 1576 | 18 | 18 |
| 1577 | 0 | 0 |
| 1578 | 0 | 0 |
| 1579 | 0 | 0 |
| 1580 | 0 | 0 |
| 1581 | 0 | 0 |
| 1582 | 0 | 0 |
| 1583 | 0 | 0 |
| 1584 | 0 | 0 |
| 1585 | 0 | 0 |
| 1586 | 0 | 0 |
| 1587 | 0 | 0 |
| 1588 | 0 | 0 |
| 1589 | 0 | 0 |
| 1590 | 0 | 0 |
| 1591 | 19 | 19 |
| 1592 | 36.3 | 36.3 |
| 1593 | 53 | 53 |
| 1594 | 65.6 | 65.6 |
| 1595 | 72.2 | 72.2 |
| 1596 | 72.1 | 72.1 |
| 1597 | 65.2 | 65.2 |
| 1598 | 52.4 | 52.4 |
| 1599 | 35.4 | 35.4 |
| 1600 | 17.6 | 17.6 |
| 1601 | 0 | 0 |
| 1602 | 0 | 0 |
| 1603 | 0 | 0 |
| 1604 | 0 | 0 |
| 1605 | 0 | 0 |
| 1606 | 0 | 0 |
| 1607 | 0 | 0 |
| 1608 | 0 | 0 |
| 1609 | 0 | 0 |
| 1610 | 0 | 0 |
| 1611 | 0 | 0 |
| 1612 | 0 | 0 |
| 1613 | 0 | 0 |
| 1614 | 0 | 0 |
| 1615 | 18.9 | 18.9 |
| 1616 | 35.9 | 35.9 |
| 1617 | 52.2 | 52.2 |
| 1618 | 64.4 | 64.4 |
| 1619 | 70.8 | 70.8 |
| 1620 | 70.7 | 70.7 |
| 1621 | 64 | 64 |
| 1622 | 51.6 | 51.6 |
| 1623 | 35 | 35 |
| 1624 | 17.4 | 17.4 |
| 1625 | 0 | 0 |
| 1626 | 0 | 0 |
| 1627 | 0 | 0 |
| 1628 | 0 | 0 |
| 1629 | 0 | 0 |
| 1630 | 0 | 0 |
| 1631 | 0 | 0 |
| 1632 | 0 | 0 |
| 1633 | 0 | 0 |
| 1634 | 0 | 0 |
| 1635 | 0 | 0 |
| 1636 | 0 | 0 |
| 1637 | 0 | 0 |
| 1638 | 0 | 0 |
| 1639 | 19.6 | 19.6 |
| 1640 | 37 | 37 |
| 1641 | 53.6 | 53.6 |
| 1642 | 65.9 | 65.9 |
| 1643 | 72.3 | 72.3 |
| 1644 | 72.1 | 72.1 |
| 1645 | 65.3 | 65.3 |
| 1646 | 52.8 | 52.8 |
| 1647 | 36 | 36 |
| 1648 | 18.1 | 18.1 |
| 1649 | 0 | 0 |
| 1650 | 0 | 0 |
| 1651 | 0 | 0 |
| 1652 | 0 | 0 |
| 1653 | 0 | 0 |
| 1654 | 0 | 0 |
| 1655 | 0 | 0 |
| 1656 | 0 | 0 |
| 1657 | 0 | 0 |
| 1658 | 0 | 0 |
| 1659 | 0 | 0 |
| 1660 | 0 | 0 |
| 1661 | 0 | 0 |
| 1662 | 0 | 0 |
| 1663 | 20.7 | 20.7 |
| 1664 | 38.7 | 38.7 |
| 1665 | 55.7 | 55.7 |
| 1666 | 68.3 | 68.3 |
| 1667 | 74.9 | 74.9 |
| 1668 | 74.8 | 74.8 |
| 1669 | 67.8 | 67.8 |
| 1670 | 54.8 | 54.8 |
| 1671 | 37.4 | 37.4 |
| 1672 | 19.1 | 19.1 |
| 1673 | 0 | 0 |
| 1674 | 0 | 0 |
| 1675 | 0 | 0 |
| 1676 | 0 | 0 |
| 1677 | 0 | 0 |
| 1678 | 0 | 0 |
| 1679 | 0 | 0 |
| 1680 | 0 | 0 |
| 1681 | 0 | 0 |
| 1682 | 0 | 0 |
| 1683 | 0 | 0 |
| 1684 | 0 | 0 |
| 1685 | 0 | 0 |
| 1686 | 0 | 0 |
| 1687 | 18.9 | 18.9 |
| 1688 | 35.3 | 35.3 |
| 1689 | 50.7 | 50.7 |
| 1690 | 62 | 62 |
| 1691 | 67.9 | 67.9 |
| 1692 | 67.7 | 67.7 |
| 1693 | 61.4 | 61.4 |
| 1694 | 49.8 | 49.8 |
| 1695 | 34.2 | 34.2 |
| 1696 | 17.6 | 17.6 |
| 1697 | 2.9 | 2.9 |
| 1698 | 0 | 0 |
| 1699 | 0 | 0 |
| 1700 | 0 | 0 |
| 1701 | 0 | 0 |
| 1702 | 0 | 0 |
| 1703 | 0 | 0 |
| 1704 | 0 | 0 |
| 1705 | 0 | 0 |
| 1706 | 0 | 0 |
| 1707 | 0 | 0 |
| 1708 | 0 | 0 |
| 1709 | 0 | 0 |
| 1710 | 0 | 0 |
| 1711 | 20 | 20 |
| 1712 | 37 | 37 |
| 1713 | 52.8 | 52.8 |
| 1714 | 64.4 | 64.4 |
| 1715 | 70.4 | 70.4 |
| 1716 | 70.2 | 70.2 |
| 1717 | 63.8 | 63.8 |
| 1718 | 51.7 | 51.7 |
| 1719 | 35.7 | 35.7 |
| 1720 | 18.4 | 18.4 |
| 1721 | 3.6 | 3.6 |
| 1722 | 0 | 0 |
| 1723 | 0 | 0 |
| 1724 | 0 | 0 |
| 1725 | 0 | 0 |
| 1726 | 0 | 0 |
| 1727 | 0 | 0 |
| 1728 | 0 | 0 |
| 1729 | 0 | 0 |
| 1730 | 0 | 0 |
| 1731 | 0 | 0 |
| 1732 | 0 | 0 |
| 1733 | 0 | 0 |
| 1734 | 0 | 0 |
| 1735 | 22.1 | 22.1 |
| 1736 | 40.6 | 40.6 |
| 1737 | 57.6 | 57.6 |
| 1738 | 70.1 | 70.1 |
| 1739 | 76.6 | 76.6 |
| 1740 | 76.3 | 76.3 |
| 1741 | 69.3 | 69.3 |
| 1742 | 56.3 | 56.3 |
| 1743 | 39 | 39 |
| 1744 | 20.3 | 20.3 |
| 1745 | 4.3 | 4.3 |
| 1746 | 0 | 0 |
| 1747 | 0 | 0 |
| 1748 | 0 | 0 |
| 1749 | 0 | 0 |
| 1750 | 0 | 0 |
| 1751 | 0 | 0 |
| 1752 | 0 | 0 |
| 1753 | 0 | 0 |
| 1754 | 0 | 0 |
| 1755 | 0 | 0 |
| 1756 | 0 | 0 |
| 1757 | 0 | 0 |
| 1758 | 0 | 0 |
| 1759 | 23.8 | 23.8 |
| 1760 | 43.2 | 43.2 |
| 1761 | 61.1 | 61.1 |
| 1762 | 74.2 | 74.2 |
| 1763 | 81 | 80 |
| 1764 | 80.7 | 80 |
| 1765 | 73.2 | 73.2 |
| 1766 | 59.7 | 59.7 |
| 1767 | 41.4 | 41.4 |
| 1768 | 21.9 | 21.9 |
| 1769 | 5 | 5 |
| 1770 | 0 | 0 |
| 1771 | 0 | 0 |
| 1772 | 0 | 0 |
| 1773 | 0 | 0 |
| 1774 | 0 | 0 |
| 1775 | 0 | 0 |
| 1776 | 0 | 0 |
| 1777 | 0 | 0 |
| 1778 | 0 | 0 |
| 1779 | 0 | 0 |
| 1780 | 0 | 0 |
| 1781 | 0 | 0 |
| 1782 | 8.7 | 8.7 |
| 1783 | 23.2 | 23.2 |
| 1784 | 41.9 | 41.9 |
| 1785 | 58.9 | 58.9 |
| 1786 | 71.4 | 71.4 |
| 1787 | 77.8 | 77.8 |
| 1788 | 77.4 | 77.4 |
| 1789 | 70.4 | 70.4 |
| 1790 | 57.4 | 57.4 |
| 1791 | 40 | 40 |
| 1792 | 21.2 | 21.2 |
| 1793 | 5.2 | 5.2 |
| 1794 | 0 | 0 |
| 1795 | 0 | 0 |
| 1796 | 0 | 0 |
| 1797 | 0 | 0 |
| 1798 | 0 | 0 |
| 1799 | 0 | 0 |
| 1800 | 0 | 0 |
| 1801 | 0 | 0 |
| 1802 | 0 | 0 |
| 1803 | 0 | 0 |
| 1804 | 0 | 0 |
| 1805 | 0 | 0 |
| 1806 | 8.6 | 8.6 |
| 1807 | 24.2 | 24.2 |
| 1808 | 43.3 | 43.3 |
| 1809 | 60.6 | 60.6 |
| 1810 | 73.2 | 73.2 |
| 1811 | 79.8 | 79.8 |
| 1812 | 79.4 | 79.4 |
| 1813 | 72.2 | 72.2 |
| 1814 | 59 | 59 |
| 1815 | 41.2 | 41.2 |
| 1816 | 22.1 | 22.1 |
| 1817 | 5.7 | 5.7 |
| 1818 | 0 | 0 |
| 1819 | 0 | 0 |
| 1820 | 0 | 0 |
| 1821 | 0 | 0 |
| 1822 | 0 | 0 |
| 1823 | 0 | 0 |
| 1824 | 0 | 0 |
| 1825 | 0 | 0 |
| 1826 | 0 | 0 |
| 1827 | 0 | 0 |
| 1828 | 0 | 0 |
| 1829 | 0 | 0 |
| 1830 | 8 | 8 |
| 1831 | 23.3 | 23.3 |
| 1832 | 41.4 | 41.4 |
| 1833 | 57.7 | 57.7 |
| 1834 | 69.6 | 69.6 |
| 1835 | 75.7 | 75.7 |
| 1836 | 75.3 | 75.3 |
| 1837 | 68.6 | 68.6 |
| 1838 | 56 | 56 |
| 1839 | 39.3 | 39.3 |
| 1840 | 21.2 | 21.2 |
| 1841 | 5.7 | 5.7 |
| 1842 | 0 | 0 |
| 1843 | 0 | 0 |
| 1844 | 0 | 0 |
| 1845 | 0 | 0 |
| 1846 | 0 | 0 |
| 1847 | 0 | 0 |
| 1848 | 0 | 0 |
| 1849 | 0 | 0 |
| 1850 | 0 | 0 |
| 1851 | 0 | 0 |
| 1852 | 0 | 0 |
| 1853 | 0 | 0 |
| 1854 | 7.7 | 7.7 |
| 1855 | 22.4 | 22.4 |
| 1856 | 39.3 | 39.3 |
| 1857 | 54.6 | 54.6 |
| 1858 | 65.7 | 65.7 |
| 1859 | 71.3 | 71.3 |
| 1860 | 71 | 71 |
| 1861 | 64.6 | 64.6 |
| 1862 | 52.9 | 52.9 |
| 1863 | 37.3 | 37.3 |
| 1864 | 20.3 | 20.3 |
| 1865 | 5.6 | 5.6 |
| 1866 | 0 | 0 |
| 1867 | 0 | 0 |
| 1868 | 0 | 0 |
| 1869 | 0 | 0 |
| 1870 | 0 | 0 |
| 1871 | 0 | 0 |
| 1872 | 0 | 0 |
| 1873 | 0 | 0 |
| 1874 | 0 | 0 |
| 1875 | 0 | 0 |
| 1876 | 0 | 0 |
| 1877 | 0 | 0 |
| 1878 | 9.6 | 9.6 |
| 1879 | 27.8 | 27.8 |
| 1880 | 48.4 | 48.4 |
| 1881 | 67 | 67 |
| 1882 | 80.4 | 80 |
| 1883 | 87.3 | 80 |
| 1884 | 86.8 | 80 |
| 1885 | 79 | 79 |
| 1886 | 64.8 | 64.8 |
| 1887 | 45.8 | 45.8 |
| 1888 | 25 | 25 |
| 1889 | 7.1 | 7.1 |
| 1890 | 0 | 0 |
| 1891 | 0 | 0 |
| 1892 | 0 | 0 |
| 1893 | 0 | 0 |
| 1894 | 0 | 0 |
| 1895 | 0 | 0 |
| 1896 | 0 | 0 |
| 1897 | 0 | 0 |
| 1898 | 0 | 0 |
| 1899 | 0 | 0 |
| 1900 | 0 | 0 |
| 1901 | 0 | 0 |
| 1902 | 6.9 | 6.9 |
| 1903 | 20 | 20 |
| 1904 | 34.6 | 34.6 |
| 1905 | 47.4 | 47.4 |
| 1906 | 56.8 | 56.8 |
| 1907 | 61.6 | 61.6 |
| 1908 | 61.1 | 61.1 |
| 1909 | 55.7 | 55.7 |
| 1910 | 45.8 | 45.8 |
| 1911 | 32.6 | 32.6 |
| 1912 | 18 | 18 |
| 1913 | 5.2 | 5.2 |
| 1914 | 0 | 0 |
| 1915 | 0 | 0 |
| 1916 | 0 | 0 |
| 1917 | 0 | 0 |
| 1918 | 0 | 0 |
| 1919 | 0 | 0 |
| 1920 | 0 | 0 |
| 1921 | 0 | 0 |
| 1922 | 0 | 0 |
| 1923 | 0 | 0 |
| 1924 | 0 | 0 |
| 1925 | 0 | 0 |
| 1926 | 9.7 | 9.7 |
| 1927 | 27.3 | 27.3 |
| 1928 | 47 | 47 |
| 1929 | 64.3 | 64.3 |
| 1930 | 77 | 77 |
| 1931 | 83.3 | 80 |
| 1932 | 82.9 | 80 |
| 1933 | 75.4 | 75.4 |
| 1934 | 62 | 62 |
| 1935 | 44.1 | 44.1 |
| 1936 | 24.6 | 24.6 |
| 1937 | 7.3 | 7.3 |
| 1938 | 0 | 0 |
| 1939 | 0 | 0 |
| 1940 | 0 | 0 |
| 1941 | 0 | 0 |
| 1942 | 0 | 0 |
| 1943 | 0 | 0 |
| 1944 | 0 | 0 |
| 1945 | 0 | 0 |
| 1946 | 0 | 0 |
| 1947 | 0 | 0 |
| 1948 | 0 | 0 |
| 1949 | 0 | 0 |
| 1950 | 9.2 | 9.2 |
| 1951 | 25.6 | 25.6 |
| 1952 | 43.6 | 43.6 |
| 1953 | 59.3 | 59.3 |
| 1954 | 70.8 | 70.8 |
| 1955 | 76.6 | 76.6 |
| 1956 | 76 | 76 |
| 1957 | 69.3 | 69.3 |
| 1958 | 57.1 | 57.1 |
| 1959 | 40.8 | 40.8 |
| 1960 | 22.8 | 22.8 |
| 1961 | 7 | 7 |
| 1962 | 0 | 0 |
| 1963 | 0 | 0 |
| 1964 | 0 | 0 |
| 1965 | 0 | 0 |
| 1966 | 0 | 0 |
| 1967 | 0 | 0 |
| 1968 | 0 | 0 |
| 1969 | 0 | 0 |
| 1970 | 0 | 0 |
| 1971 | 0 | 0 |
| 1972 | 0 | 0 |
| 1973 | 0 | 0 |
| 1974 | 9.2 | 9.2 |
| 1975 | 25.2 | 25.2 |
| 1976 | 42.4 | 42.4 |
| 1977 | 57.6 | 57.6 |
| 1978 | 68.6 | 68.6 |
| 1979 | 74.1 | 74.1 |
| 1980 | 73.6 | 73.6 |
| 1981 | 67.1 | 67.1 |
| 1982 | 55.3 | 55.3 |
| 1983 | 39.7 | 39.7 |
| 1984 | 22.3 | 22.3 |
| 1985 | 7.1 | 7.1 |
| 1986 | 0 | 0 |
| 1987 | 0 | 0 |
| 1988 | 0 | 0 |
| 1989 | 0 | 0 |
| 1990 | 0 | 0 |
| 1991 | 0 | 0 |
| 1992 | 0 | 0 |
| 1993 | 0 | 0 |
| 1994 | 0 | 0 |
| 1995 | 0 | 0 |
| 1996 | 0 | 0 |
| 1997 | 0 | 0 |
| 1998 | 10.9 | 10.9 |
| 1999 | 29.6 | 29.6 |
| 2000 | 49.6 | 49.6 |
| 2001 | 67 | 67 |
| 2002 | 79.7 | 79.7 |
| 2003 | 86 | 80 |
| 2004 | 85.4 | 80 |
| 2005 | 77.9 | 77.9 |
| 2006 | 64.2 | 64.2 |
| 2007 | 46.1 | 46.1 |
| 2008 | 26.1 | 26.1 |
| 2009 | 8.3 | 8.3 |
| 2010 | 0 | 0 |
| 2011 | 0 | 0 |
| 2012 | 0 | 0 |
| 2013 | 0 | 0 |
| 2014 | 0 | 0 |
| 2015 | 0 | 0 |
| 2016 | 0 | 0 |
| 2017 | 0 | 0 |
| 2018 | 0 | 0 |
| 2019 | 0 | 0 |
| 2020 | 0 | 0 |
| 2021 | 0 | 0 |
| 2022 | 10.7 | 10.7 |
| 2023 | 28.2 | 28.2 |
| 2024 | 47 | 47 |
| 2025 | 63.3 | 63.3 |
| 2026 | 75.1 | 75.1 |
| 2027 | 81 | 80 |
| 2028 | 80.3 | 80 |
| 2029 | 73.3 | 73.3 |
| 2030 | 60.6 | 60.6 |
| 2031 | 43.6 | 43.6 |
| 2032 | 24.9 | 24.9 |
| 2033 | 8.2 | 8.2 |
| 2034 | 0 | 0 |
| 2035 | 0 | 0 |
| 2036 | 0 | 0 |
| 2037 | 0 | 0 |
| 2038 | 0 | 0 |
| 2039 | 0 | 0 |
| 2040 | 0 | 0 |
| 2041 | 0 | 0 |
| 2042 | 0 | 0 |
| 2043 | 0 | 0 |
| 2044 | 0 | 0 |
| 2045 | 0 | 0 |
| 2046 | 9.8 | 9.8 |
| 2047 | 25.3 | 25.3 |
| 2048 | 41.6 | 41.6 |
| 2049 | 55.8 | 55.8 |
| 2050 | 65.9 | 65.9 |
| 2051 | 71 | 71 |
| 2052 | 70.4 | 70.4 |
| 2053 | 64.3 | 64.3 |
| 2054 | 53.2 | 53.2 |
| 2055 | 38.6 | 38.6 |
| 2056 | 22.2 | 22.2 |
| 2057 | 7.6 | 7.6 |
| 2058 | 0 | 0 |
| 2059 | 0 | 0 |
| 2060 | 0 | 0 |
| 2061 | 0 | 0 |
| 2062 | 0 | 0 |
| 2063 | 0 | 0 |
| 2064 | 0 | 0 |
| 2065 | 0 | 0 |
| 2066 | 0 | 0 |
| 2067 | 0 | 0 |
| 2068 | 0 | 0 |
| 2069 | 0 | 0 |
| 2070 | 11.7 | 11.7 |
| 2071 | 30 | 30 |
| 2072 | 49.1 | 49.1 |
| 2073 | 65.7 | 65.7 |
| 2074 | 77.6 | 77.6 |
| 2075 | 83.6 | 80 |
| 2076 | 82.9 | 80 |
| 2077 | 75.7 | 75.7 |
| 2078 | 62.6 | 62.6 |
| 2079 | 45.3 | 45.3 |
| 2080 | 26.1 | 26.1 |
| 2081 | 9 | 9 |
| 2082 | 0 | 0 |
| 2083 | 0 | 0 |
| 2084 | 0 | 0 |
| 2085 | 0 | 0 |
| 2086 | 0 | 0 |
| 2087 | 0 | 0 |
| 2088 | 0 | 0 |
| 2089 | 0 | 0 |
| 2090 | 0 | 0 |
| 2091 | 0 | 0 |
| 2092 | 0 | 0 |
| 2093 | 0 | 0 |
| 2094 | 13.9 | 13.9 |
| 2095 | 35.2 | 35.2 |
| 2096 | 57.6 | 57.6 |
| 2097 | 76.9 | 76.9 |
| 2098 | 90.8 | 80 |
| 2099 | 97.7 | 80 |
| 2100 | 96.8 | 80 |
| 2101 | 88.3 | 80 |
| 2102 | 73.2 | 73.2 |
| 2103 | 53 | 53 |
| 2104 | 30.7 | 30.7 |
| 2105 | 10.6 | 10.6 |
| 2106 | 0 | 0 |
| 2107 | 0 | 0 |
| 2108 | 0 | 0 |
| 2109 | 0 | 0 |
| 2110 | 0 | 0 |
| 2111 | 0 | 0 |
| 2112 | 0 | 0 |
| 2113 | 0 | 0 |
| 2114 | 0 | 0 |
| 2115 | 0 | 0 |
| 2116 | 0 | 0 |
| 2117 | 0 | 0 |
| 2118 | 13.1 | 13.1 |
| 2119 | 32.6 | 32.6 |
| 2120 | 52.6 | 52.6 |
| 2121 | 70 | 70 |
| 2122 | 82.4 | 80 |
| 2123 | 88.6 | 80 |
| 2124 | 87.8 | 80 |
| 2125 | 80.1 | 80 |
| 2126 | 66.4 | 66.4 |
| 2127 | 48.3 | 48.3 |
| 2128 | 28.2 | 28.2 |
| 2129 | 10 | 10 |
| 2130 | 0 | 0 |
| 2131 | 0 | 0 |
| 2132 | 0 | 0 |
| 2133 | 0 | 0 |
| 2134 | 0 | 0 |
| 2135 | 0 | 0 |
| 2136 | 0 | 0 |
| 2137 | 0 | 0 |
| 2138 | 0 | 0 |
| 2139 | 0 | 0 |
| 2140 | 0 | 0 |
| 2141 | 0 | 0 |
| 2142 | 11.1 | 11.1 |
| 2143 | 26.2 | 26.2 |
| 2144 | 41.8 | 41.8 |
| 2145 | 55.2 | 55.2 |
| 2146 | 64.8 | 64.8 |
| 2147 | 69.4 | 69.4 |
| 2148 | 68.8 | 68.8 |
| 2149 | 62.9 | 62.9 |
| 2150 | 52.3 | 52.3 |
| 2151 | 38.3 | 38.3 |
| 2152 | 22.7 | 22.7 |
| 2153 | 8.3 | 8.3 |
| 2154 | 0 | 0 |
| 2155 | 0 | 0 |
| 2156 | 0 | 0 |
| 2157 | 0 | 0 |
| 2158 | 0 | 0 |
| 2159 | 0 | 0 |
| 2160 | 0 | 0 |
| 2161 | 0 | 0 |
| 2162 | 0 | 0 |
| 2163 | 0 | 0 |
| 2164 | 0 | 0 |
| 2165 | 0 | 0 |
| 2166 | 11.2 | 11.2 |
| 2167 | 26.2 | 26.2 |
| 2168 | 41.6 | 41.6 |
| 2169 | 54.7 | 54.7 |
| 2170 | 64.1 | 64.1 |
| 2171 | 68.7 | 68.7 |
| 2172 | 68 | 68 |
| 2173 | 62.2 | 62.2 |
| 2174 | 51.8 | 51.8 |
| 2175 | 38 | 38 |
| 2176 | 22.6 | 22.6 |
| 2177 | 8.4 | 8.4 |
| 2178 | 0 | 0 |
| 2179 | 0 | 0 |
| 2180 | 0 | 0 |
| 2181 | 0 | 0 |
| 2182 | 0 | 0 |
| 2183 | 0 | 0 |
| 2184 | 0 | 0 |
| 2185 | 0 | 0 |
| 2186 | 0 | 0 |
| 2187 | 0 | 0 |
| 2188 | 0 | 0 |
| 2189 | 0 | 0 |
| 2190 | 14.3 | 14.3 |
| 2191 | 33.8 | 33.8 |
| 2192 | 53.7 | 53.7 |
| 2193 | 70.8 | 70.8 |
| 2194 | 82.9 | 80 |
| 2195 | 88.9 | 80 |
| 2196 | 88 | 80 |
| 2197 | 80.4 | 80 |
| 2198 | 66.9 | 66.9 |
| 2199 | 48.9 | 48.9 |
| 2200 | 29 | 29 |
| 2201 | 10.8 | 10.8 |
| 2202 | 0 | 0 |
| 2203 | 0 | 0 |
| 2204 | 0 | 0 |
| 2205 | 0 | 0 |
| 2206 | 0 | 0 |
| 2207 | 0 | 0 |
| 2208 | 0 | 0 |
| 2209 | 0 | 0 |
| 2210 | 0 | 0 |
| 2211 | 0 | 0 |
| 2212 | 0 | 0 |
| 2213 | 0 | 0 |
| 2214 | 12.9 | 12.9 |
| 2215 | 29.3 | 29.3 |
| 2216 | 46 | 46 |
| 2217 | 60.2 | 60.2 |
| 2218 | 70.3 | 70.3 |
| 2219 | 75.3 | 75.3 |
| 2220 | 74.6 | 74.6 |
| 2221 | 68.2 | 68.2 |
| 2222 | 56.9 | 56.9 |
| 2223 | 41.9 | 41.9 |
| 2224 | 25.1 | 25.1 |
| 2225 | 9.7 | 9.7 |
| 2226 | 0 | 0 |
| 2227 | 0 | 0 |
| 2228 | 0 | 0 |
| 2229 | 0 | 0 |
| 2230 | 0 | 0 |
| 2231 | 0 | 0 |
| 2232 | 0 | 0 |
| 2233 | 0 | 0 |
| 2234 | 0 | 0 |
| 2235 | 0 | 0 |
| 2236 | 0 | 0 |
| 2237 | 0 | 0 |
| 2238 | 14.4 | 14.4 |
| 2239 | 32.7 | 32.7 |
| 2240 | 51.1 | 51.1 |
| 2241 | 66.8 | 66.8 |
| 2242 | 78 | 78 |
| 2243 | 83.4 | 80 |
| 2244 | 82.6 | 80 |
| 2245 | 75.4 | 75.4 |
| 2246 | 63 | 63 |
| 2247 | 46.3 | 46.3 |
| 2248 | 27.9 | 27.9 |
| 2249 | 10.8 | 10.8 |
| 2250 | 0 | 0 |
| 2251 | 0 | 0 |
| 2252 | 0 | 0 |
| 2253 | 0 | 0 |
| 2254 | 0 | 0 |
| 2255 | 0 | 0 |
| 2256 | 0 | 0 |
| 2257 | 0 | 0 |
| 2258 | 0 | 0 |
| 2259 | 0 | 0 |
| 2260 | 0 | 0 |
| 2261 | 0 | 0 |
| 2262 | 15.3 | 15.3 |
| 2263 | 34.3 | 34.3 |
| 2264 | 53.3 | 53.3 |
| 2265 | 69.7 | 69.7 |
| 2266 | 81.1 | 80 |
| 2267 | 86.8 | 80 |
| 2268 | 85.8 | 80 |
| 2269 | 78.6 | 78.6 |
| 2270 | 65.6 | 65.6 |
| 2271 | 48.3 | 48.3 |
| 2272 | 29.1 | 29.1 |
| 2273 | 11.3 | 11.3 |
| 2274 | 0 | 0 |
| 2275 | 0 | 0 |
| 2276 | 0 | 0 |
| 2277 | 0 | 0 |
| 2278 | 0 | 0 |
| 2279 | 0 | 0 |
| 2280 | 0 | 0 |
| 2281 | 0 | 0 |
| 2282 | 0 | 0 |
| 2283 | 0 | 0 |
| 2284 | 0 | 0 |
| 2285 | 0 | 0 |
| 2286 | 15.1 | 15.1 |
| 2287 | 33 | 33 |
| 2288 | 50.9 | 50.9 |
| 2289 | 66.1 | 66.1 |
| 2290 | 77 | 77 |
| 2291 | 82.1 | 80 |
| 2292 | 81.2 | 80 |
| 2293 | 74.3 | 74.3 |
| 2294 | 62.1 | 62.1 |
| 2295 | 46 | 46 |
| 2296 | 27.9 | 27.9 |
| 2297 | 11.1 | 11.1 |
| 2298 | 0 | 0 |
| 2299 | 0 | 0 |
| 2300 | 0 | 0 |
| 2301 | 0 | 0 |
| 2302 | 0 | 0 |
| 2303 | 0 | 0 |
| 2304 | 0 | 0 |
| 2305 | 0 | 0 |
| 2306 | 0 | 0 |
| 2307 | 0 | 0 |
| 2308 | 0 | 0 |
| 2309 | 0 | 0 |
| 2310 | 16.1 | 16.1 |
| 2311 | 34.9 | 34.9 |
| 2312 | 53.8 | 53.8 |
| 2313 | 69.7 | 69.7 |
| 2314 | 81 | 80 |
| 2315 | 86.4 | 80 |
| 2316 | 85.4 | 80 |
| 2317 | 78.2 | 78.2 |
| 2318 | 65.3 | 65.3 |
| 2319 | 48.4 | 48.4 |
| 2320 | 29.4 | 29.4 |
| 2321 | 11.8 | 11.8 |
| 2322 | 0 | 0 |
| 2323 | 0 | 0 |
| 2324 | 0 | 0 |
| 2325 | 0 | 0 |
| 2326 | 0 | 0 |
| 2327 | 0 | 0 |
| 2328 | 0 | 0 |
| 2329 | 0 | 0 |
| 2330 | 0 | 0 |
| 2331 | 0 | 0 |
| 2332 | 0 | 0 |
| 2333 | 2.3 | 2.3 |
| 2334 | 15.2 | 15.2 |
| 2335 | 32.2 | 32.2 |
| 2336 | 49 | 49 |
| 2337 | 63.3 | 63.3 |
| 2338 | 73.3 | 73.3 |
| 2339 | 78.1 | 78.1 |
| 2340 | 77.2 | 77.2 |
| 2341 | 70.8 | 70.8 |
| 2342 | 59.3 | 59.3 |
| 2343 | 44.1 | 44.1 |
| 2344 | 27.1 | 27.1 |
| 2345 | 11.2 | 11.2 |
| 2346 | 0 | 0 |
| 2347 | 0 | 0 |
| 2348 | 0 | 0 |
| 2349 | 0 | 0 |
| 2350 | 0 | 0 |
| 2351 | 0 | 0 |
| 2352 | 0 | 0 |
| 2353 | 0 | 0 |
| 2354 | 0 | 0 |
| 2355 | 0 | 0 |
| 2356 | 0 | 0 |
| 2357 | 2.6 | 2.6 |
| 2358 | 15.3 | 15.3 |
| 2359 | 31.8 | 31.8 |
| 2360 | 48.1 | 48.1 |
| 2361 | 61.9 | 61.9 |
| 2362 | 71.7 | 71.7 |
| 2363 | 76.3 | 76.3 |
| 2364 | 75.3 | 75.3 |
| 2365 | 69.1 | 69.1 |
| 2366 | 58 | 58 |
| 2367 | 43.2 | 43.2 |
| 2368 | 26.8 | 26.8 |
| 2369 | 11.2 | 11.2 |
| 2370 | 0 | 0 |
| 2371 | 0 | 0 |
| 2372 | 0 | 0 |
| 2373 | 0 | 0 |
| 2374 | 0 | 0 |
| 2375 | 0 | 0 |
| 2376 | 0 | 0 |
| 2377 | 0 | 0 |
| 2378 | 0 | 0 |
| 2379 | 0 | 0 |
| 2380 | 0 | 0 |
| 2381 | 2.8 | 2.8 |
| 2382 | 17.1 | 17.1 |
| 2383 | 35.4 | 35.4 |
| 2384 | 53.4 | 53.4 |
| 2385 | 68.8 | 68.8 |
| 2386 | 79.6 | 79.6 |
| 2387 | 84.7 | 80 |
| 2388 | 83.7 | 80 |
| 2389 | 76.7 | 76.7 |
| 2390 | 64.3 | 64.3 |
| 2391 | 47.9 | 47.9 |
| 2392 | 29.7 | 29.7 |
| 2393 | 12.4 | 12.4 |
| 2394 | 1.1 | 1.1 |
| 2395 | 0 | 0 |
| 2396 | 0 | 0 |
| 2397 | 0 | 0 |
| 2398 | 0 | 0 |
| 2399 | 0 | 0 |
| 2400 | 0 | 0 |
| 2401 | 0 | 0 |
| 2402 | 0 | 0 |
| 2403 | 0 | 0 |
| 2404 | 0 | 0 |
| 2405 | 3 | 3 |
| 2406 | 17.7 | 17.7 |
| 2407 | 36.2 | 36.2 |
| 2408 | 54.6 | 54.6 |
| 2409 | 70 | 70 |
| 2410 | 80.9 | 80 |
| 2411 | 86 | 80 |
| 2412 | 84.9 | 80 |
| 2413 | 77.8 | 77.8 |
| 2414 | 65.3 | 65.3 |
| 2415 | 48.8 | 48.8 |
| 2416 | 30.3 | 30.3 |
| 2417 | 12.9 | 12.9 |
| 2418 | 1.3 | 1.3 |
| 2419 | 0 | 0 |
| 2420 | 0 | 0 |
| 2421 | 0 | 0 |
| 2422 | 0 | 0 |
| 2423 | 0 | 0 |
| 2424 | 0 | 0 |
| 2425 | 0 | 0 |
| 2426 | 0 | 0 |
| 2427 | 0 | 0 |
| 2428 | 0 | 0 |
| 2429 | 3.2 | 3.2 |
| 2430 | 18.2 | 18.2 |
| 2431 | 36.9 | 36.9 |
| 2432 | 55.2 | 55.2 |
| 2433 | 70.7 | 70.7 |
| 2434 | 81.6 | 80 |
| 2435 | 86.7 | 80 |
| 2436 | 85.6 | 80 |
| 2437 | 78.4 | 78.4 |
| 2438 | 65.9 | 65.9 |
| 2439 | 49.3 | 49.3 |
| 2440 | 30.8 | 30.8 |
| 2441 | 13.2 | 13.2 |
| 2442 | 1.4 | 1.4 |
| 2443 | 0 | 0 |
| 2444 | 0 | 0 |
| 2445 | 0 | 0 |
| 2446 | 0 | 0 |
| 2447 | 0 | 0 |
| 2448 | 0 | 0 |
| 2449 | 0 | 0 |
| 2450 | 0 | 0 |
| 2451 | 0 | 0 |
| 2452 | 0 | 0 |
| 2453 | 3.4 | 3.4 |
| 2454 | 17.7 | 17.7 |
| 2455 | 35.1 | 35.1 |
| 2456 | 52.1 | 52.1 |
| 2457 | 66.6 | 66.6 |
| 2458 | 76.6 | 76.6 |
| 2459 | 81.2 | 80 |
| 2460 | 80.2 | 80 |
| 2461 | 73.6 | 73.6 |
| 2462 | 61.9 | 61.9 |
| 2463 | 46.6 | 46.6 |
| 2464 | 29.2 | 29.2 |
| 2465 | 12.8 | 12.8 |
| 2466 | 1.7 | 1.7 |
| 2467 | 0 | 0 |
| 2468 | 0 | 0 |
| 2469 | 0 | 0 |
| 2470 | 0 | 0 |
| 2471 | 0 | 0 |
| 2472 | 0 | 0 |
| 2473 | 0 | 0 |
| 2474 | 0 | 0 |
| 2475 | 0 | 0 |
| 2476 | 0 | 0 |
| 2477 | 3.6 | 3.6 |
| 2478 | 15.3 | 15.3 |
| 2479 | 29.2 | 29.2 |
| 2480 | 42.8 | 42.8 |
| 2481 | 54.1 | 54.1 |
| 2482 | 62.1 | 62.1 |
| 2483 | 65.8 | 65.8 |
| 2484 | 65 | 65 |
| 2485 | 59.7 | 59.7 |
| 2486 | 50.4 | 50.4 |
| 2487 | 38.1 | 38.1 |
| 2488 | 24.3 | 24.3 |
| 2489 | 11.1 | 11.1 |
| 2490 | 1.8 | 1.8 |
| 2491 | 0 | 0 |
| 2492 | 0 | 0 |
| 2493 | 0 | 0 |
| 2494 | 0 | 0 |
| 2495 | 0 | 0 |
| 2496 | 0 | 0 |
| 2497 | 0 | 0 |
| 2498 | 0 | 0 |
| 2499 | 0 | 0 |
| 2500 | 0 | 0 |
| 2501 | 3.8 | 3.8 |
| 2502 | 20.4 | 20.4 |
| 2503 | 40.4 | 40.4 |
| 2504 | 59.8 | 59.8 |
| 2505 | 76.1 | 76.1 |
| 2506 | 87.6 | 80 |
| 2507 | 92.9 | 80 |
| 2508 | 91.7 | 80 |
| 2509 | 84.1 | 80 |
| 2510 | 70.7 | 70.7 |
| 2511 | 53.1 | 53.1 |
| 2512 | 33.4 | 33.4 |
| 2513 | 14.7 | 14.7 |
| 2514 | 2 | 2 |
| 2515 | 0 | 0 |
| 2516 | 0 | 0 |
| 2517 | 0 | 0 |
| 2518 | 0 | 0 |
| 2519 | 0 | 0 |
| 2520 | 0 | 0 |
| 2521 | 0 | 0 |
| 2522 | 0 | 0 |
| 2523 | 0 | 0 |
| 2524 | 0 | 0 |
| 2525 | 4.1 | 4.1 |
| 2526 | 18.6 | 18.6 |
| 2527 | 35.4 | 35.4 |
| 2528 | 51.9 | 51.9 |
| 2529 | 65.7 | 65.7 |
| 2530 | 75.2 | 75.2 |
| 2531 | 79.8 | 79.8 |
| 2532 | 78.7 | 78.7 |
| 2533 | 72.2 | 72.2 |
| 2534 | 61 | 61 |
| 2535 | 46.1 | 46.1 |
| 2536 | 29.3 | 29.3 |
| 2537 | 13.3 | 13.3 |
| 2538 | 2.2 | 2.2 |
| 2539 | 0 | 0 |
| 2540 | 0 | 0 |
| 2541 | 0 | 0 |
| 2542 | 0 | 0 |
| 2543 | 0 | 0 |
| 2544 | 0 | 0 |
| 2545 | 0 | 0 |
| 2546 | 0 | 0 |
| 2547 | 0 | 0 |
| 2548 | 0 | 0 |
| 2549 | 4.2 | 4.2 |
| 2550 | 20.7 | 20.7 |
| 2551 | 39.8 | 39.8 |
| 2552 | 58.3 | 58.3 |
| 2553 | 73.8 | 73.8 |
| 2554 | 84.7 | 80 |
| 2555 | 89.7 | 80 |
| 2556 | 88.4 | 80 |
| 2557 | 81.1 | 80 |
| 2558 | 68.4 | 68.4 |
| 2559 | 51.7 | 51.7 |
| 2560 | 32.8 | 32.8 |
| 2561 | 14.8 | 14.8 |
| 2562 | 2.3 | 2.3 |
| 2563 | 0 | 0 |
| 2564 | 0 | 0 |
| 2565 | 0 | 0 |
| 2566 | 0 | 0 |
| 2567 | 0 | 0 |
| 2568 | 0 | 0 |
| 2569 | 0 | 0 |
| 2570 | 0 | 0 |
| 2571 | 0 | 0 |
| 2572 | 0 | 0 |
| 2573 | 4.4 | 4.4 |
| 2574 | 18.9 | 18.9 |
| 2575 | 35.2 | 35.2 |
| 2576 | 51 | 51 |
| 2577 | 64.1 | 64.1 |
| 2578 | 73.3 | 73.3 |
| 2579 | 77.6 | 77.6 |
| 2580 | 76.4 | 76.4 |
| 2581 | 70.2 | 70.2 |
| 2582 | 59.4 | 59.4 |
| 2583 | 45.1 | 45.1 |
| 2584 | 29 | 29 |
| 2585 | 13.6 | 13.6 |
| 2586 | 2.6 | 2.6 |
| 2587 | 0 | 0 |
| 2588 | 0 | 0 |
| 2589 | 0 | 0 |
| 2590 | 0 | 0 |
| 2591 | 0 | 0 |
| 2592 | 0 | 0 |
| 2593 | 0 | 0 |
| 2594 | 0 | 0 |
| 2595 | 0 | 0 |
| 2596 | 0 | 0 |
| 2597 | 4.7 | 4.7 |
| 2598 | 20.1 | 20.1 |
| 2599 | 37.4 | 37.4 |
| 2600 | 54.2 | 54.2 |
| 2601 | 68.2 | 68.2 |
| 2602 | 77.9 | 77.9 |
| 2603 | 82.4 | 80 |
| 2604 | 81.2 | 80 |
| 2605 | 74.7 | 74.7 |
| 2606 | 63.1 | 63.1 |
| 2607 | 47.9 | 47.9 |
| 2608 | 30.9 | 30.9 |
| 2609 | 14.4 | 14.4 |
| 2610 | 2.7 | 2.7 |
| 2611 | 0 | 0 |
| 2612 | 0 | 0 |
| 2613 | 0 | 0 |
| 2614 | 0 | 0 |
| 2615 | 0 | 0 |
| 2616 | 0 | 0 |
| 2617 | 0 | 0 |
| 2618 | 0 | 0 |
| 2619 | 0 | 0 |
| 2620 | 0 | 0 |
| 2621 | 4.8 | 4.8 |
| 2622 | 23.2 | 23.2 |
| 2623 | 43.8 | 43.8 |
| 2624 | 63.6 | 63.6 |
| 2625 | 80.1 | 80 |
| 2626 | 91.7 | 80 |
| 2627 | 97 | 80 |
| 2628 | 95.7 | 80 |
| 2629 | 87.8 | 80 |
| 2630 | 74.1 | 74.1 |
| 2631 | 56.1 | 56.1 |
| 2632 | 35.9 | 35.9 |
| 2633 | 16.4 | 16.4 |
| 2634 | 2.8 | 2.8 |
| 2635 | 0 | 0 |
| 2636 | 0 | 0 |
| 2637 | 0 | 0 |
| 2638 | 0 | 0 |
| 2639 | 0 | 0 |
| 2640 | 0 | 0 |
| 2641 | 0 | 0 |
| 2642 | 0 | 0 |
| 2643 | 0 | 0 |
| 2644 | 0 | 0 |
| 2645 | 5.3 | 5.3 |
| 2646 | 19.6 | 19.6 |
| 2647 | 35.3 | 35.3 |
| 2648 | 50.4 | 50.4 |
| 2649 | 63 | 63 |
| 2650 | 71.8 | 71.8 |
| 2651 | 75.8 | 75.8 |
| 2652 | 74.8 | 74.8 |
| 2653 | 68.7 | 68.7 |
| 2654 | 58.3 | 58.3 |
| 2655 | 44.6 | 44.6 |
| 2656 | 29.1 | 29.1 |
| 2657 | 14.1 | 14.1 |
| 2658 | 3 | 3 |
| 2659 | 0 | 0 |
| 2660 | 0 | 0 |
| 2661 | 0 | 0 |
| 2662 | 0 | 0 |
| 2663 | 0 | 0 |
| 2664 | 0 | 0 |
| 2665 | 0 | 0 |
| 2666 | 0 | 0 |
| 2667 | 0 | 0 |
| 2668 | 0 | 0 |
| 2669 | 5.6 | 5.6 |
| 2670 | 24.2 | 24.2 |
| 2671 | 44.9 | 44.9 |
| 2672 | 64.8 | 64.8 |
| 2673 | 81.4 | 80 |
| 2674 | 92.9 | 80 |
| 2675 | 98.2 | 80 |
| 2676 | 96.8 | 80 |
| 2677 | 88.9 | 80 |
| 2678 | 75.1 | 75.1 |
| 2679 | 57 | 57 |
| 2680 | 36.8 | 36.8 |
| 2681 | 17.1 | 17.1 |
| 2682 | 3.1 | 3.1 |
| 2683 | 0 | 0 |
| 2684 | 0 | 0 |
| 2685 | 0 | 0 |
| 2686 | 0 | 0 |
| 2687 | 0 | 0 |
| 2688 | 0 | 0 |
| 2689 | 0 | 0 |
| 2690 | 0 | 0 |
| 2691 | 0 | 0 |
| 2692 | 0 | 0 |
| 2693 | 6 | 6 |
| 2694 | 22.8 | 22.8 |
| 2695 | 41.3 | 41.3 |
| 2696 | 59.1 | 59.1 |
| 2697 | 74 | 74 |
| 2698 | 84.2 | 80 |
| 2699 | 88.9 | 80 |
| 2700 | 87.7 | 80 |
| 2701 | 80.6 | 80 |
| 2702 | 68.2 | 68.2 |
| 2703 | 52.1 | 52.1 |
| 2704 | 33.9 | 33.9 |
| 2705 | 16.2 | 16.2 |
| 2706 | 3.3 | 3.3 |
| 2707 | 0 | 0 |
| 2708 | 0 | 0 |
| 2709 | 0 | 0 |
| 2710 | 0 | 0 |
| 2711 | 0 | 0 |
| 2712 | 0 | 0 |
| 2713 | 0 | 0 |
| 2714 | 0 | 0 |
| 2715 | 0 | 0 |
| 2716 | 0 | 0 |
| 2717 | 6.3 | 6.3 |
| 2718 | 21.3 | 21.3 |
| 2719 | 37.8 | 37.8 |
| 2720 | 53.6 | 53.6 |
| 2721 | 66.7 | 66.7 |
| 2722 | 75.8 | 75.8 |
| 2723 | 79.9 | 79.9 |
| 2724 | 78.8 | 78.8 |
| 2725 | 72.4 | 72.4 |
| 2726 | 61.6 | 61.6 |
| 2727 | 47.2 | 47.2 |
| 2728 | 31 | 31 |
| 2729 | 15.3 | 15.3 |
| 2730 | 3.6 | 3.6 |
| 2731 | 0 | 0 |
| 2732 | 0 | 0 |
| 2733 | 0 | 0 |
| 2734 | 0 | 0 |
| 2735 | 0 | 0 |
| 2736 | 0 | 0 |
| 2737 | 0 | 0 |
| 2738 | 0 | 0 |
| 2739 | 0 | 0 |
| 2740 | 0 | 0 |
| 2741 | 6.7 | 6.7 |
| 2742 | 21.1 | 21.1 |
| 2743 | 37 | 37 |
| 2744 | 52.1 | 52.1 |
| 2745 | 64.7 | 64.7 |
| 2746 | 73.3 | 73.3 |
| 2747 | 77.3 | 77.3 |
| 2748 | 76.2 | 76.2 |
| 2749 | 70.1 | 70.1 |
| 2750 | 59.7 | 59.7 |
| 2751 | 45.9 | 45.9 |
| 2752 | 30.3 | 30.3 |
| 2753 | 15.2 | 15.2 |
| 2754 | 3.7 | 3.7 |
| 2755 | 0 | 0 |
| 2756 | 0 | 0 |
| 2757 | 0 | 0 |
| 2758 | 0 | 0 |
| 2759 | 0 | 0 |
| 2760 | 0 | 0 |
| 2761 | 0 | 0 |
| 2762 | 0 | 0 |
| 2763 | 0 | 0 |
| 2764 | 0 | 0 |
| 2765 | 7.1 | 7.1 |
| 2766 | 25 | 25 |
| 2767 | 44.9 | 44.9 |
| 2768 | 63.8 | 63.8 |
| 2769 | 79.4 | 79.4 |
| 2770 | 90.3 | 80 |
| 2771 | 95.2 | 80 |
| 2772 | 93.9 | 80 |
| 2773 | 86.2 | 80 |
| 2774 | 73.2 | 73.2 |
| 2775 | 56 | 56 |
| 2776 | 36.7 | 36.7 |
| 2777 | 17.9 | 17.9 |
| 2778 | 3.8 | 3.8 |
| 2779 | 0 | 0 |
| 2780 | 0 | 0 |
| 2781 | 0 | 0 |
| 2782 | 0 | 0 |
| 2783 | 0 | 0 |
| 2784 | 0 | 0 |
| 2785 | 0 | 0 |
| 2786 | 0 | 0 |
| 2787 | 0 | 0 |
| 2788 | 0 | 0 |
| 2789 | 7.4 | 7.4 |
| 2790 | 24.7 | 24.7 |
| 2791 | 43.7 | 43.7 |
| 2792 | 61.8 | 61.8 |
| 2793 | 76.8 | 76.8 |
| 2794 | 87.1 | 80 |
| 2795 | 91.8 | 80 |
| 2796 | 90.4 | 80 |
| 2797 | 83.2 | 80 |
| 2798 | 70.7 | 70.7 |
| 2799 | 54.2 | 54.2 |
| 2800 | 35.7 | 35.7 |
| 2801 | 17.7 | 17.7 |
| 2802 | 4 | 4 |
| 2803 | 0 | 0 |
| 2804 | 0 | 0 |
| 2805 | 0 | 0 |
| 2806 | 0 | 0 |
| 2807 | 0 | 0 |
| 2808 | 0 | 0 |
| 2809 | 0 | 0 |
| 2810 | 0 | 0 |
| 2811 | 0 | 0 |
| 2812 | 0 | 0 |
| 2813 | 7.8 | 7.8 |
| 2814 | 24.2 | 24.2 |
| 2815 | 42.3 | 42.3 |
| 2816 | 59.6 | 59.6 |
| 2817 | 73.8 | 73.8 |
| 2818 | 83.6 | 80 |
| 2819 | 88 | 80 |
| 2820 | 86.8 | 80 |
| 2821 | 79.8 | 79.8 |
| 2822 | 67.9 | 67.9 |
| 2823 | 52.2 | 52.2 |
| 2824 | 34.7 | 34.7 |
| 2825 | 17.3 | 17.3 |
| 2826 | 4.1 | 4.1 |
| 2827 | 0 | 0 |
| 2828 | 0 | 0 |
| 2829 | 0 | 0 |
| 2830 | 0 | 0 |
| 2831 | 0 | 0 |
| 2832 | 0 | 0 |
| 2833 | 0 | 0 |
| 2834 | 0 | 0 |
| 2835 | 0 | 0 |
| 2836 | 0 | 0 |
| 2837 | 8.1 | 8.1 |
| 2838 | 26.3 | 26.3 |
| 2839 | 46.1 | 46.1 |
| 2840 | 65.1 | 65.1 |
| 2841 | 80.8 | 80 |
| 2842 | 91.6 | 80 |
| 2843 | 96.4 | 80 |
| 2844 | 95 | 80 |
| 2845 | 87.3 | 80 |
| 2846 | 74.3 | 74.3 |
| 2847 | 57.1 | 57.1 |
| 2848 | 37.7 | 37.7 |
| 2849 | 18.8 | 18.8 |
| 2850 | 4.2 | 4.2 |
| 2851 | 0 | 0 |
| 2852 | 0 | 0 |
| 2853 | 0 | 0 |
| 2854 | 0 | 0 |
| 2855 | 0 | 0 |
| 2856 | 0 | 0 |
| 2857 | 0 | 0 |
| 2858 | 0 | 0 |
| 2859 | 0 | 0 |
| 2860 | 2.2 | 2.2 |
| 2861 | 8.4 | 8.4 |
| 2862 | 25.2 | 25.2 |
| 2863 | 43.7 | 43.7 |
| 2864 | 61.1 | 61.1 |
| 2865 | 75.6 | 75.6 |
| 2866 | 85.6 | 80 |
| 2867 | 90 | 80 |
| 2868 | 88.7 | 80 |
| 2869 | 81.7 | 80 |
| 2870 | 69.6 | 69.6 |
| 2871 | 53.7 | 53.7 |
| 2872 | 35.7 | 35.7 |
| 2873 | 18.1 | 18.1 |
| 2874 | 4.4 | 4.4 |
| 2875 | 0 | 0 |
| 2876 | 0 | 0 |
| 2877 | 0 | 0 |
| 2878 | 0 | 0 |
| 2879 | 0 | 0 |
| 2880 | 0 | 0 |
| 2881 | 0 | 0 |
| 2882 | 0 | 0 |
| 2883 | 0 | 0 |
| 2884 | 2.2 | 2.2 |
| 2885 | 7.7 | 7.7 |
| 2886 | 18.6 | 18.6 |
| 2887 | 30.4 | 30.4 |
| 2888 | 41.4 | 41.4 |
| 2889 | 50.6 | 50.6 |
| 2890 | 56.9 | 56.9 |
| 2891 | 59.7 | 59.7 |
| 2892 | 58.8 | 58.8 |
| 2893 | 54.3 | 54.3 |
| 2894 | 46.7 | 46.7 |
| 2895 | 36.6 | 36.6 |
| 2896 | 25.1 | 25.1 |
| 2897 | 13.7 | 13.7 |
| 2898 | 4.4 | 4.4 |
| 2899 | 0 | 0 |
| 2900 | 0 | 0 |
| 2901 | 0 | 0 |
| 2902 | 0 | 0 |
| 2903 | 0 | 0 |
| 2904 | 0 | 0 |
| 2905 | 0 | 0 |
| 2906 | 0 | 0 |
| 2907 | 0 | 0 |
| 2908 | 2.6 | 2.6 |
| 2909 | 8.4 | 8.4 |
| 2910 | 21.7 | 21.7 |
| 2911 | 35.8 | 35.8 |
| 2912 | 49.1 | 49.1 |
| 2913 | 60.1 | 60.1 |
| 2914 | 67.8 | 67.8 |
| 2915 | 71.1 | 71.1 |
| 2916 | 70.1 | 70.1 |
| 2917 | 64.7 | 64.7 |
| 2918 | 55.4 | 55.4 |
| 2919 | 43.2 | 43.2 |
| 2920 | 29.4 | 29.4 |
| 2921 | 15.8 | 15.8 |
| 2922 | 4.7 | 4.7 |
| 2923 | 0 | 0 |
| 2924 | 0 | 0 |
| 2925 | 0 | 0 |
| 2926 | 0 | 0 |
| 2927 | 0 | 0 |
| 2928 | 0 | 0 |
| 2929 | 0 | 0 |
| 2930 | 0 | 0 |
| 2931 | 0 | 0 |
| 2932 | 2.6 | 2.6 |
| 2933 | 8 | 8 |
| 2934 | 18.7 | 18.7 |
| 2935 | 30.1 | 30.1 |
| 2936 | 40.8 | 40.8 |
| 2937 | 49.6 | 49.6 |
| 2938 | 55.6 | 55.6 |
| 2939 | 58.2 | 58.2 |
| 2940 | 57.3 | 57.3 |
| 2941 | 53 | 53 |
| 2942 | 45.7 | 45.7 |
| 2943 | 35.9 | 35.9 |
| 2944 | 24.8 | 24.8 |
| 2945 | 13.8 | 13.8 |
| 2946 | 4.7 | 4.7 |
| 2947 | 0 | 0 |
| 2948 | 0 | 0 |
| 2949 | 0 | 0 |
| 2950 | 0 | 0 |
| 2951 | 0 | 0 |
| 2952 | 0 | 0 |
| 2953 | 0 | 0 |
| 2954 | 0 | 0 |
| 2955 | 0 | 0 |
| 2956 | 2.9 | 2.9 |
| 2957 | 9.3 | 9.3 |
| 2958 | 24.3 | 24.3 |
| 2959 | 40.6 | 40.6 |
| 2960 | 55.8 | 55.8 |
| 2961 | 68.3 | 68.3 |
| 2962 | 76.9 | 76.9 |
| 2963 | 80.8 | 80 |
| 2964 | 79.6 | 79.6 |
| 2965 | 73.3 | 73.3 |
| 2966 | 62.8 | 62.8 |
| 2967 | 48.9 | 48.9 |
| 2968 | 33.2 | 33.2 |
| 2969 | 17.8 | 17.8 |
| 2970 | 5 | 5 |
| 2971 | 0 | 0 |
| 2972 | 0 | 0 |
| 2973 | 0 | 0 |
| 2974 | 0 | 0 |
| 2975 | 0 | 0 |
| 2976 | 0 | 0 |
| 2977 | 0 | 0 |
| 2978 | 0 | 0 |
| 2979 | 0 | 0 |
| 2980 | 3 | 3 |
| 2981 | 9.3 | 9.3 |
| 2982 | 22.7 | 22.7 |
| 2983 | 37 | 37 |
| 2984 | 50.6 | 50.6 |
| 2985 | 61.6 | 61.6 |
| 2986 | 69.2 | 69.2 |
| 2987 | 72.7 | 72.7 |
| 2988 | 71.6 | 71.6 |
| 2989 | 66.1 | 66.1 |
| 2990 | 56.7 | 56.7 |
| 2991 | 44.4 | 44.4 |
| 2992 | 30.4 | 30.4 |
| 2993 | 16.7 | 16.7 |
| 2994 | 5.2 | 5.2 |
| 2995 | 0 | 0 |
| 2996 | 0 | 0 |
| 2997 | 0 | 0 |
| 2998 | 0 | 0 |
| 2999 | 0 | 0 |
| 3000 | 0 | 0 |
| 3001 | 0 | 0 |
| 3002 | 0 | 0 |
| 3003 | 0 | 0 |
| 3004 | 3.1 | 3.1 |
| 3005 | 9.4 | 9.4 |
| 3006 | 22.4 | 22.4 |
| 3007 | 36.3 | 36.3 |
| 3008 | 49.3 | 49.3 |
| 3009 | 60.1 | 60.1 |
| 3010 | 67.4 | 67.4 |
| 3011 | 70.7 | 70.7 |
| 3012 | 69.7 | 69.7 |
| 3013 | 64.3 | 64.3 |
| 3014 | 55.3 | 55.3 |
| 3015 | 43.4 | 43.4 |
| 3016 | 30 | 30 |
| 3017 | 16.6 | 16.6 |
| 3018 | 5.3 | 5.3 |
| 3019 | 0 | 0 |
| 3020 | 0 | 0 |
| 3021 | 0 | 0 |
| 3022 | 0 | 0 |
| 3023 | 0 | 0 |
| 3024 | 0 | 0 |
| 3025 | 0 | 0 |
| 3026 | 0 | 0 |
| 3027 | 0 | 0 |
| 3028 | 3.2 | 3.2 |
| 3029 | 9 | 9 |
| 3030 | 20 | 20 |
| 3031 | 31.7 | 31.7 |
| 3032 | 42.6 | 42.6 |
| 3033 | 51.6 | 51.6 |
| 3034 | 57.7 | 57.7 |
| 3035 | 60.3 | 60.3 |
| 3036 | 59.4 | 59.4 |
| 3037 | 55 | 55 |
| 3038 | 47.4 | 47.4 |
| 3039 | 37.6 | 37.6 |
| 3040 | 26.2 | 26.2 |
| 3041 | 14.9 | 14.9 |
| 3042 | 5.2 | 5.2 |
| 3043 | 1.1 | 1.1 |
| 3044 | 0 | 0 |
| 3045 | 0 | 0 |
| 3046 | 0 | 0 |
| 3047 | 0 | 0 |
| 3048 | 0 | 0 |
| 3049 | 0 | 0 |
| 3050 | 0 | 0 |
| 3051 | 0 | 0 |
| 3052 | 3.4 | 3.4 |
| 3053 | 10.1 | 10.1 |
| 3054 | 23.8 | 23.8 |
| 3055 | 38.4 | 38.4 |
| 3056 | 52.1 | 52.1 |
| 3057 | 63.4 | 63.4 |
| 3058 | 71.1 | 71.1 |
| 3059 | 74.6 | 74.6 |
| 3060 | 73.4 | 73.4 |
| 3061 | 67.9 | 67.9 |
| 3062 | 58.3 | 58.3 |
| 3063 | 45.9 | 45.9 |
| 3064 | 31.7 | 31.7 |
| 3065 | 17.6 | 17.6 |
| 3066 | 5.6 | 5.6 |
| 3067 | 1.3 | 1.3 |
| 3068 | 0 | 0 |
| 3069 | 0 | 0 |
| 3070 | 0 | 0 |
| 3071 | 0 | 0 |
| 3072 | 0 | 0 |
| 3073 | 0 | 0 |
| 3074 | 0 | 0 |
| 3075 | 0 | 0 |
| 3076 | 3.4 | 3.4 |
| 3077 | 9.3 | 9.3 |
| 3078 | 20.1 | 20.1 |
| 3079 | 31.6 | 31.6 |
| 3080 | 42.1 | 42.1 |
| 3081 | 50.8 | 50.8 |
| 3082 | 56.8 | 56.8 |
| 3083 | 59.4 | 59.4 |
| 3084 | 58.6 | 58.6 |
| 3085 | 54.2 | 54.2 |
| 3086 | 46.9 | 46.9 |
| 3087 | 37.2 | 37.2 |
| 3088 | 26.1 | 26.1 |
| 3089 | 15.1 | 15.1 |
| 3090 | 5.6 | 5.6 |
| 3091 | 1.3 | 1.3 |
| 3092 | 0 | 0 |
| 3093 | 0 | 0 |
| 3094 | 0 | 0 |
| 3095 | 0 | 0 |
| 3096 | 0 | 0 |
| 3097 | 0 | 0 |
| 3098 | 0 | 0 |
| 3099 | 0 | 0 |
| 3100 | 3.8 | 3.8 |
| 3101 | 11 | 11 |
| 3102 | 26.4 | 26.4 |
| 3103 | 43 | 43 |
| 3104 | 58.6 | 58.6 |
| 3105 | 71.3 | 71.3 |
| 3106 | 80 | 80 |
| 3107 | 83.9 | 80 |
| 3108 | 82.7 | 80 |
| 3109 | 76.3 | 76.3 |
| 3110 | 65.7 | 65.7 |
| 3111 | 51.4 | 51.4 |
| 3112 | 35.4 | 35.4 |
| 3113 | 19.6 | 19.6 |
| 3114 | 6 | 6 |
| 3115 | 1.6 | 1.6 |
| 3116 | 0 | 0 |
| 3117 | 0 | 0 |
| 3118 | 0 | 0 |
| 3119 | 0 | 0 |
| 3120 | 0 | 0 |
| 3121 | 0 | 0 |
| 3122 | 0 | 0 |
| 3123 | 0 | 0 |
| 3124 | 3.9 | 3.9 |
| 3125 | 11.1 | 11.1 |
| 3126 | 26.1 | 26.1 |
| 3127 | 42.1 | 42.1 |
| 3128 | 57.1 | 57.1 |
| 3129 | 69.4 | 69.4 |
| 3130 | 77.9 | 77.9 |
| 3131 | 81.7 | 80 |
| 3132 | 80.4 | 80 |
| 3133 | 74.3 | 74.3 |
| 3134 | 63.9 | 63.9 |
| 3135 | 50.3 | 50.3 |
| 3136 | 34.8 | 34.8 |
| 3137 | 19.3 | 19.3 |
| 3138 | 6.2 | 6.2 |
| 3139 | 1.8 | 1.8 |
| 3140 | 0 | 0 |
| 3141 | 0 | 0 |
| 3142 | 0 | 0 |
| 3143 | 0 | 0 |
| 3144 | 0 | 0 |
| 3145 | 0 | 0 |
| 3146 | 0 | 0 |
| 3147 | 0 | 0 |
| 3148 | 3.8 | 3.8 |
| 3149 | 9.9 | 9.9 |
| 3150 | 20.4 | 20.4 |
| 3151 | 31.6 | 31.6 |
| 3152 | 42 | 42 |
| 3153 | 50.4 | 50.4 |
| 3154 | 56.2 | 56.2 |
| 3155 | 58.8 | 58.8 |
| 3156 | 57.9 | 57.9 |
| 3157 | 53.8 | 53.8 |
| 3158 | 46.6 | 46.6 |
| 3159 | 37.1 | 37.1 |
| 3160 | 26.3 | 26.3 |
| 3161 | 15.4 | 15.4 |
| 3162 | 6 | 6 |
| 3163 | 1.8 | 1.8 |
| 3164 | 0 | 0 |
| 3165 | 0 | 0 |
| 3166 | 0 | 0 |
| 3167 | 0 | 0 |
| 3168 | 0 | 0 |
| 3169 | 0 | 0 |
| 3170 | 0 | 0 |
| 3171 | 0 | 0 |
| 3172 | 3.6 | 3.6 |
| 3173 | 8.8 | 8.8 |
| 3174 | 16.9 | 16.9 |
| 3175 | 25.3 | 25.3 |
| 3176 | 33.2 | 33.2 |
| 3177 | 39.7 | 39.7 |
| 3178 | 44.1 | 44.1 |
| 3179 | 46 | 46 |
| 3180 | 45.3 | 45.3 |
| 3181 | 42.2 | 42.2 |
| 3182 | 36.8 | 36.8 |
| 3183 | 29.6 | 29.6 |
| 3184 | 21.2 | 21.2 |
| 3185 | 12.9 | 12.9 |
| 3186 | 5.6 | 5.6 |
| 3187 | 1.7 | 1.7 |
| 3188 | 0 | 0 |
| 3189 | 0 | 0 |
| 3190 | 0 | 0 |
| 3191 | 0 | 0 |
| 3192 | 0 | 0 |
| 3193 | 0 | 0 |
| 3194 | 0 | 0 |
| 3195 | 0 | 0 |
| 3196 | 4.3 | 4.3 |
| 3197 | 11.6 | 11.6 |
| 3198 | 25.6 | 25.6 |
| 3199 | 40.4 | 40.4 |
| 3200 | 54.3 | 54.3 |
| 3201 | 65.8 | 65.8 |
| 3202 | 73.6 | 73.6 |
| 3203 | 77 | 77 |
| 3204 | 75.9 | 75.9 |
| 3205 | 70.2 | 70.2 |
| 3206 | 60.7 | 60.7 |
| 3207 | 48 | 48 |
| 3208 | 33.6 | 33.6 |
| 3209 | 19.2 | 19.2 |
| 3210 | 6.8 | 6.8 |
| 3211 | 2.1 | 2.1 |
| 3212 | 0 | 0 |
| 3213 | 0 | 0 |
| 3214 | 0 | 0 |
| 3215 | 0 | 0 |
| 3216 | 0 | 0 |
| 3217 | 0 | 0 |
| 3218 | 0 | 0 |
| 3219 | 0 | 0 |
| 3220 | 4 | 4 |
| 3221 | 9.7 | 9.7 |
| 3222 | 19 | 19 |
| 3223 | 28.7 | 28.7 |
| 3224 | 37.6 | 37.6 |
| 3225 | 44.9 | 44.9 |
| 3226 | 49.9 | 49.9 |
| 3227 | 52.1 | 52.1 |
| 3228 | 51.3 | 51.3 |
| 3229 | 47.8 | 47.8 |
| 3230 | 41.6 | 41.6 |
| 3231 | 33.3 | 33.3 |
| 3232 | 24 | 24 |
| 3233 | 14.6 | 14.6 |
| 3234 | 6.2 | 6.2 |
| 3235 | 2 | 2 |
| 3236 | 0 | 0 |
| 3237 | 0 | 0 |
| 3238 | 0 | 0 |
| 3239 | 0 | 0 |
| 3240 | 0 | 0 |
| 3241 | 0 | 0 |
| 3242 | 0 | 0 |
| 3243 | 0 | 0 |
| 3244 | 4.1 | 4.1 |
| 3245 | 9.8 | 9.8 |
| 3246 | 18.8 | 18.8 |
| 3247 | 28.2 | 28.2 |
| 3248 | 37 | 37 |
| 3249 | 44.1 | 44.1 |
| 3250 | 49 | 49 |
| 3251 | 51.1 | 51.1 |
| 3252 | 50.4 | 50.4 |
| 3253 | 46.9 | 46.9 |
| 3254 | 40.9 | 40.9 |
| 3255 | 32.9 | 32.9 |
| 3256 | 23.8 | 23.8 |
| 3257 | 14.4 | 14.4 |
| 3258 | 6.3 | 6.3 |
| 3259 | 2.1 | 2.1 |
| 3260 | 0 | 0 |
| 3261 | 0 | 0 |
| 3262 | 0 | 0 |
| 3263 | 0 | 0 |
| 3264 | 0 | 0 |
| 3265 | 0 | 0 |
| 3266 | 0 | 0 |
| 3267 | 0 | 0 |
| 3268 | 4.2 | 4.2 |
| 3269 | 9.9 | 9.9 |
| 3270 | 19 | 19 |
| 3271 | 28.6 | 28.6 |
| 3272 | 37.3 | 37.3 |
| 3273 | 44.6 | 44.6 |
| 3274 | 49.4 | 49.4 |
| 3275 | 51.6 | 51.6 |
| 3276 | 50.9 | 50.9 |
| 3277 | 47.3 | 47.3 |
| 3278 | 41.2 | 41.2 |
| 3279 | 33.2 | 33.2 |
| 3280 | 24 | 24 |
| 3281 | 14.7 | 14.7 |
| 3282 | 6.4 | 6.4 |
| 3283 | 2.2 | 2.2 |
| 3284 | 0 | 0 |
| 3285 | 0 | 0 |
| 3286 | 0 | 0 |
| 3287 | 0 | 0 |
| 3288 | 0 | 0 |
| 3289 | 0 | 0 |
| 3290 | 0 | 0 |
| 3291 | 0 | 0 |
| 3292 | 4.4 | 4.4 |
| 3293 | 10.7 | 10.7 |
| 3294 | 20.9 | 20.9 |
| 3295 | 31.6 | 31.6 |
| 3296 | 41.4 | 41.4 |
| 3297 | 49.4 | 49.4 |
| 3298 | 55 | 55 |
| 3299 | 57.4 | 57.4 |
| 3300 | 56.6 | 56.6 |
| 3301 | 52.7 | 52.7 |
| 3302 | 45.9 | 45.9 |
| 3303 | 36.8 | 36.8 |
| 3304 | 26.6 | 26.6 |
| 3305 | 16.1 | 16.1 |
| 3306 | 6.9 | 6.9 |
| 3307 | 2.4 | 2.4 |
| 3308 | 0 | 0 |
| 3309 | 0 | 0 |
| 3310 | 0 | 0 |
| 3311 | 0 | 0 |
| 3312 | 0 | 0 |
| 3313 | 0 | 0 |
| 3314 | 0 | 0 |
| 3315 | 0 | 0 |
| 3316 | 4.9 | 4.9 |
| 3317 | 13.2 | 13.2 |
| 3318 | 30.2 | 30.2 |
| 3319 | 48.2 | 48.2 |
| 3320 | 65 | 65 |
| 3321 | 78.9 | 78.9 |
| 3322 | 88.3 | 80 |
| 3323 | 92.6 | 80 |
| 3324 | 91.2 | 80 |
| 3325 | 84.4 | 80 |
| 3326 | 72.8 | 72.8 |
| 3327 | 57.6 | 57.6 |
| 3328 | 40.1 | 40.1 |
| 3329 | 22.8 | 22.8 |
| 3330 | 7.8 | 7.8 |
| 3331 | 2.8 | 2.8 |
| 3332 | 0 | 0 |
| 3333 | 0 | 0 |
| 3334 | 0 | 0 |
| 3335 | 0 | 0 |
| 3336 | 0 | 0 |
| 3337 | 0 | 0 |
| 3338 | 0 | 0 |
| 3339 | 0 | 0 |
| 3340 | 5 | 5 |
| 3341 | 13 | 13 |
| 3342 | 28.1 | 28.1 |
| 3343 | 44.1 | 44.1 |
| 3344 | 59 | 59 |
| 3345 | 71.2 | 71.2 |
| 3346 | 79.6 | 79.6 |
| 3347 | 83.2 | 80 |
| 3348 | 82.1 | 80 |
| 3349 | 76.1 | 76.1 |
| 3350 | 65.8 | 65.8 |
| 3351 | 52.3 | 52.3 |
| 3352 | 36.9 | 36.9 |
| 3353 | 21.4 | 21.4 |
| 3354 | 8 | 8 |
| 3355 | 2.9 | 2.9 |
| 3356 | 0 | 0 |
| 3357 | 0 | 0 |
| 3358 | 0 | 0 |
| 3359 | 0 | 0 |
| 3360 | 0 | 0 |
| 3361 | 0 | 0 |
| 3362 | 0 | 0 |
| 3363 | 0 | 0 |
| 3364 | 5.1 | 5.1 |
| 3365 | 12.9 | 12.9 |
| 3366 | 27.4 | 27.4 |
| 3367 | 42.6 | 42.6 |
| 3368 | 56.8 | 56.8 |
| 3369 | 68.3 | 68.3 |
| 3370 | 76.3 | 76.3 |
| 3371 | 79.9 | 79.9 |
| 3372 | 78.8 | 78.8 |
| 3373 | 73.1 | 73.1 |
| 3374 | 63.3 | 63.3 |
| 3375 | 50.4 | 50.4 |
| 3376 | 35.8 | 35.8 |
| 3377 | 21 | 21 |
| 3378 | 8.1 | 8.1 |
| 3379 | 3 | 3 |
| 3380 | 0 | 0 |
| 3381 | 0 | 0 |
| 3382 | 0 | 0 |
| 3383 | 0 | 0 |
| 3384 | 0 | 0 |
| 3385 | 0 | 0 |
| 3386 | 0 | 0 |
| 3387 | 0 | 0 |
| 3388 | 5.2 | 5.2 |
| 3389 | 12.4 | 12.4 |
| 3390 | 25 | 25 |
| 3391 | 38.3 | 38.3 |
| 3392 | 50.6 | 50.6 |
| 3393 | 60.6 | 60.6 |
| 3394 | 67.4 | 67.4 |
| 3395 | 70.6 | 70.6 |
| 3396 | 69.6 | 69.6 |
| 3397 | 64.7 | 64.7 |
| 3398 | 56.2 | 56.2 |
| 3399 | 45 | 45 |
| 3400 | 32.3 | 32.3 |
| 3401 | 19.3 | 19.3 |
| 3402 | 8 | 8 |
| 3403 | 3.1 | 3.1 |
| 3404 | 0 | 0 |
| 3405 | 0 | 0 |
| 3406 | 0 | 0 |
| 3407 | 0 | 0 |
| 3408 | 0 | 0 |
| 3409 | 0 | 0 |
| 3410 | 0 | 0 |
| 3411 | 0 | 0 |
| 3412 | 5.2 | 5.2 |
| 3413 | 12.2 | 12.2 |
| 3414 | 24.2 | 24.2 |
| 3415 | 36.7 | 36.7 |
| 3416 | 48.2 | 48.2 |
| 3417 | 57.7 | 57.7 |
| 3418 | 64.1 | 64.1 |
| 3419 | 67 | 67 |
| 3420 | 66.1 | 66.1 |
| 3421 | 61.4 | 61.4 |
| 3422 | 53.6 | 53.6 |
| 3423 | 43 | 43 |
| 3424 | 31 | 31 |
| 3425 | 18.8 | 18.8 |
| 3426 | 8.1 | 8.1 |
| 3427 | 3.1 | 3.1 |
| 3428 | 0 | 0 |
| 3429 | 0 | 0 |
| 3430 | 0 | 0 |
| 3431 | 0 | 0 |
| 3432 | 0 | 0 |
| 3433 | 0 | 0 |
| 3434 | 0 | 0 |
| 3435 | 0 | 0 |
| 3436 | 5.1 | 5.1 |
| 3437 | 11.6 | 11.6 |
| 3438 | 21.8 | 21.8 |
| 3439 | 32.4 | 32.4 |
| 3440 | 42.3 | 42.3 |
| 3441 | 50.4 | 50.4 |
| 3442 | 55.9 | 55.9 |
| 3443 | 58.4 | 58.4 |
| 3444 | 57.7 | 57.7 |
| 3445 | 53.7 | 53.7 |
| 3446 | 46.9 | 46.9 |
| 3447 | 37.9 | 37.9 |
| 3448 | 27.7 | 27.7 |
| 3449 | 17.1 | 17.1 |
| 3450 | 7.8 | 7.8 |
| 3451 | 3.1 | 3.1 |
| 3452 | 0 | 0 |
| 3453 | 0 | 0 |
| 3454 | 0 | 0 |
| 3455 | 0 | 0 |
| 3456 | 0 | 0 |
| 3457 | 0 | 0 |
| 3458 | 0 | 0 |
| 3459 | 0 | 0 |
| 3460 | 5.4 | 5.4 |
| 3461 | 12.9 | 12.9 |
| 3462 | 25.8 | 25.8 |
| 3463 | 39.3 | 39.3 |
| 3464 | 51.8 | 51.8 |
| 3465 | 62 | 62 |
| 3466 | 69 | 69 |
| 3467 | 72.2 | 72.2 |
| 3468 | 71.2 | 71.2 |
| 3469 | 66.2 | 66.2 |
| 3470 | 57.7 | 57.7 |
| 3471 | 46.3 | 46.3 |
| 3472 | 33.3 | 33.3 |
| 3473 | 20.2 | 20.2 |
| 3474 | 8.6 | 8.6 |
| 3475 | 3.4 | 3.4 |
| 3476 | 0 | 0 |
| 3477 | 0 | 0 |
| 3478 | 0 | 0 |
| 3479 | 0 | 0 |
| 3480 | 0 | 0 |
| 3481 | 0 | 0 |
| 3482 | 0 | 0 |
| 3483 | 0 | 0 |
| 3484 | 5.6 | 5.6 |
| 3485 | 12.8 | 12.8 |
| 3486 | 25 | 25 |
| 3487 | 37.7 | 37.7 |
| 3488 | 49.4 | 49.4 |
| 3489 | 59.1 | 59.1 |
| 3490 | 65.8 | 65.8 |
| 3491 | 68.7 | 68.7 |
| 3492 | 67.8 | 67.8 |
| 3493 | 63.1 | 63.1 |
| 3494 | 55 | 55 |
| 3495 | 44.3 | 44.3 |
| 3496 | 32.1 | 32.1 |
| 3497 | 19.7 | 19.7 |
| 3498 | 8.6 | 8.6 |
| 3499 | 3.4 | 3.4 |
| 3500 | 0 | 0 |
| 3501 | 0 | 0 |
| 3502 | 0 | 0 |
| 3503 | 0 | 0 |
| 3504 | 0 | 0 |
| 3505 | 0 | 0 |
| 3506 | 0 | 0 |
| 3507 | 0 | 0 |
| 3508 | 5.7 | 5.7 |
| 3509 | 13 | 13 |
| 3510 | 25.4 | 25.4 |
| 3511 | 38.4 | 38.4 |
| 3512 | 50.6 | 50.6 |
| 3513 | 60.4 | 60.4 |
| 3514 | 67.2 | 67.2 |
| 3515 | 70.2 | 70.2 |
| 3516 | 69.3 | 69.3 |
| 3517 | 64.6 | 64.6 |
| 3518 | 56.2 | 56.2 |
| 3519 | 45.3 | 45.3 |
| 3520 | 32.8 | 32.8 |
| 3521 | 20.1 | 20.1 |
| 3522 | 8.8 | 8.8 |
| 3523 | 3.6 | 3.6 |
| 3524 | 0 | 0 |
| 3525 | 0 | 0 |
| 3526 | 0 | 0 |
| 3527 | 0 | 0 |
| 3528 | 0 | 0 |
| 3529 | 0 | 0 |
| 3530 | 0 | 0 |
| 3531 | 0 | 0 |
| 3532 | 5.2 | 5.2 |
| 3533 | 11.2 | 11.2 |
| 3534 | 20.2 | 20.2 |
| 3535 | 29.7 | 29.7 |
| 3536 | 38.2 | 38.2 |
| 3537 | 45.3 | 45.3 |
| 3538 | 50.1 | 50.1 |
| 3539 | 52.2 | 52.2 |
| 3540 | 51.6 | 51.6 |
| 3541 | 48.2 | 48.2 |
| 3542 | 42.3 | 42.3 |
| 3543 | 34.4 | 34.4 |
| 3544 | 25.4 | 25.4 |
| 3545 | 16.2 | 16.2 |
| 3546 | 7.9 | 7.9 |
| 3547 | 3.3 | 3.3 |
| 3548 | 0 | 0 |
| 3549 | 0 | 0 |
| 3550 | 0 | 0 |
| 3551 | 0 | 0 |
| 3552 | 0 | 0 |
| 3553 | 0 | 0 |
| 3554 | 0 | 0 |
| 3555 | 0 | 0 |
| 3556 | 5.8 | 5.8 |
| 3557 | 13.6 | 13.6 |
| 3558 | 26.9 | 26.9 |
| 3559 | 40.8 | 40.8 |
| 3560 | 53.6 | 53.6 |
| 3561 | 64.1 | 64.1 |
| 3562 | 71.3 | 71.3 |
| 3563 | 74.7 | 74.7 |
| 3564 | 73.7 | 73.7 |
| 3565 | 68.6 | 68.6 |
| 3566 | 59.8 | 59.8 |
| 3567 | 48.2 | 48.2 |
| 3568 | 34.8 | 34.8 |
| 3569 | 21.2 | 21.2 |
| 3570 | 9.2 | 9.2 |
| 3571 | 3.8 | 3.8 |
| 3572 | 0 | 0 |
| 3573 | 0 | 0 |
| 3574 | 0 | 0 |
| 3575 | 0 | 0 |
| 3576 | 0 | 0 |
| 3577 | 0 | 0 |
| 3578 | 0 | 0 |
| 3579 | 0 | 0 |
| 3580 | 5.9 | 5.9 |
| 3581 | 14.3 | 14.3 |
| 3582 | 29.4 | 29.4 |
| 3583 | 45.3 | 45.3 |
| 3584 | 60.1 | 60.1 |
| 3585 | 72.2 | 72.2 |
| 3586 | 80.6 | 80 |
| 3587 | 84.3 | 80 |
| 3588 | 83.2 | 80 |
| 3589 | 77.4 | 77.4 |
| 3590 | 67.3 | 67.3 |
| 3591 | 54 | 54 |
| 3592 | 38.8 | 38.8 |
| 3593 | 23.3 | 23.3 |
| 3594 | 9.7 | 9.7 |
| 3595 | 3.9 | 3.9 |
| 3596 | 0 | 0 |
| 3597 | 0 | 0 |
| 3598 | 0 | 0 |
| 3599 | 0 | 0 |
| 3600 | 0 | 0 |
| 3601 | 0 | 0 |
| 3602 | 0 | 0 |
| 3603 | 2 | 2 |
| 3604 | 6 | 6 |
| 3605 | 13.8 | 13.8 |
| 3606 | 27.2 | 27.2 |
| 3607 | 41.2 | 41.2 |
| 3608 | 54.2 | 54.2 |
| 3609 | 64.8 | 64.8 |
| 3610 | 72.1 | 72.1 |
| 3611 | 75.4 | 75.4 |
| 3612 | 74.4 | 74.4 |
| 3613 | 69.3 | 69.3 |
| 3614 | 60.6 | 60.6 |
| 3615 | 48.8 | 48.8 |
| 3616 | 35.3 | 35.3 |
| 3617 | 21.7 | 21.7 |
| 3618 | 9.6 | 9.6 |
| 3619 | 4 | 4 |
| 3620 | 0 | 0 |
| 3621 | 0 | 0 |
| 3622 | 0 | 0 |
| 3623 | 0 | 0 |
| 3624 | 0 | 0 |
| 3625 | 0 | 0 |
| 3626 | 0 | 0 |
| 3627 | 2.1 | 2.1 |
| 3628 | 6 | 6 |
| 3629 | 14.2 | 14.2 |
| 3630 | 28.3 | 28.3 |
| 3631 | 43 | 43 |
| 3632 | 56.8 | 56.8 |
| 3633 | 68 | 68 |
| 3634 | 75.8 | 75.8 |
| 3635 | 79.2 | 79.2 |
| 3636 | 78.2 | 78.2 |
| 3637 | 72.9 | 72.9 |
| 3638 | 63.6 | 63.6 |
| 3639 | 51.2 | 51.2 |
| 3640 | 37 | 37 |
| 3641 | 22.7 | 22.7 |
| 3642 | 9.8 | 9.8 |
| 3643 | 4.1 | 4.1 |
| 3644 | 0 | 0 |
| 3645 | 0 | 0 |
| 3646 | 0 | 0 |
| 3647 | 0 | 0 |
| 3648 | 0 | 0 |
| 3649 | 0 | 0 |
| 3650 | 0 | 0 |
| 3651 | 2.1 | 2.1 |
| 3652 | 6 | 6 |
| 3653 | 13.4 | 13.4 |
| 3654 | 25.4 | 25.4 |
| 3655 | 38.1 | 38.1 |
| 3656 | 49.8 | 49.8 |
| 3657 | 59.3 | 59.3 |
| 3658 | 65.9 | 65.9 |
| 3659 | 68.9 | 68.9 |
| 3660 | 68 | 68 |
| 3661 | 63.4 | 63.4 |
| 3662 | 55.6 | 55.6 |
| 3663 | 45 | 45 |
| 3664 | 33 | 33 |
| 3665 | 20.6 | 20.6 |
| 3666 | 9.6 | 9.6 |
| 3667 | 4.1 | 4.1 |
| 3668 | 0 | 0 |
| 3669 | 0 | 0 |
| 3670 | 0 | 0 |
| 3671 | 0 | 0 |
| 3672 | 0 | 0 |
| 3673 | 0 | 0 |
| 3674 | 0 | 0 |
| 3675 | 2.2 | 2.2 |
| 3676 | 6.1 | 6.1 |
| 3677 | 14.2 | 14.2 |
| 3678 | 27.9 | 27.9 |
| 3679 | 42.2 | 42.2 |
| 3680 | 55.4 | 55.4 |
| 3681 | 66.4 | 66.4 |
| 3682 | 73.9 | 73.9 |
| 3683 | 77.3 | 77.3 |
| 3684 | 76.4 | 76.4 |
| 3685 | 71.2 | 71.2 |
| 3686 | 62.2 | 62.2 |
| 3687 | 50.2 | 50.2 |
| 3688 | 36.4 | 36.4 |
| 3689 | 22.6 | 22.6 |
| 3690 | 10 | 10 |
| 3691 | 4.2 | 4.2 |
| 3692 | 0 | 0 |
| 3693 | 0 | 0 |
| 3694 | 0 | 0 |
| 3695 | 0 | 0 |
| 3696 | 0 | 0 |
| 3697 | 0 | 0 |
| 3698 | 0 | 0 |
| 3699 | 2.2 | 2.2 |
| 3700 | 6 | 6 |
| 3701 | 13 | 13 |
| 3702 | 24.1 | 24.1 |
| 3703 | 35.6 | 35.6 |
| 3704 | 46.2 | 46.2 |
| 3705 | 54.9 | 54.9 |
| 3706 | 60.9 | 60.9 |
| 3707 | 63.6 | 63.6 |
| 3708 | 62.9 | 62.9 |
| 3709 | 58.7 | 58.7 |
| 3710 | 51.6 | 51.6 |
| 3711 | 42 | 42 |
| 3712 | 31 | 31 |
| 3713 | 19.7 | 19.7 |
| 3714 | 9.4 | 9.4 |
| 3715 | 4.1 | 4.1 |
| 3716 | 0 | 0 |
| 3717 | 0 | 0 |
| 3718 | 0 | 0 |
| 3719 | 0 | 0 |
| 3720 | 0 | 0 |
| 3721 | 0 | 0 |
| 3722 | 0 | 0 |
| 3723 | 2.3 | 2.3 |
| 3724 | 6.2 | 6.2 |
| 3725 | 13.9 | 13.9 |
| 3726 | 26.7 | 26.7 |
| 3727 | 39.9 | 39.9 |
| 3728 | 52.1 | 52.1 |
| 3729 | 62.2 | 62.2 |
| 3730 | 69.2 | 69.2 |
| 3731 | 72.3 | 72.3 |
| 3732 | 71.6 | 71.6 |
| 3733 | 66.8 | 66.8 |
| 3734 | 58.4 | 58.4 |
| 3735 | 47.4 | 47.4 |
| 3736 | 34.7 | 34.7 |
| 3737 | 21.7 | 21.7 |
| 3738 | 10 | 10 |
| 3739 | 4.3 | 4.3 |
| 3740 | 0 | 0 |
| 3741 | 0 | 0 |
| 3742 | 0 | 0 |
| 3743 | 0 | 0 |
| 3744 | 0 | 0 |
| 3745 | 0 | 0 |
| 3746 | 0 | 0 |
| 3747 | 2 | 2 |
| 3748 | 5.4 | 5.4 |
| 3749 | 11.1 | 11.1 |
| 3750 | 19.1 | 19.1 |
| 3751 | 27.4 | 27.4 |
| 3752 | 35.1 | 35.1 |
| 3753 | 41.3 | 41.3 |
| 3754 | 45.7 | 45.7 |
| 3755 | 47.7 | 47.7 |
| 3756 | 47.1 | 47.1 |
| 3757 | 44.1 | 44.1 |
| 3758 | 39 | 39 |
| 3759 | 32.1 | 32.1 |
| 3760 | 24.1 | 24.1 |
| 3761 | 15.9 | 15.9 |
| 3762 | 8.3 | 8.3 |
| 3763 | 3.8 | 3.8 |
| 3764 | 0 | 0 |
| 3765 | 0 | 0 |
| 3766 | 0 | 0 |
| 3767 | 0 | 0 |
| 3768 | 0 | 0 |
| 3769 | 0 | 0 |
| 3770 | 0 | 0 |
| 3771 | 2.2 | 2.2 |
| 3772 | 6 | 6 |
| 3773 | 12.8 | 12.8 |
| 3774 | 23.2 | 23.2 |
| 3775 | 34.1 | 34.1 |
| 3776 | 44.1 | 44.1 |
| 3777 | 52.3 | 52.3 |
| 3778 | 58 | 58 |
| 3779 | 60.6 | 60.6 |
| 3780 | 59.9 | 59.9 |
| 3781 | 56 | 56 |
| 3782 | 49.3 | 49.3 |
| 3783 | 40.3 | 40.3 |
| 3784 | 29.9 | 29.9 |
| 3785 | 19.2 | 19.2 |
| 3786 | 9.6 | 9.6 |
| 3787 | 4.2 | 4.2 |
| 3788 | 0 | 0 |
| 3789 | 0 | 0 |
| 3790 | 0 | 0 |
| 3791 | 0 | 0 |
| 3792 | 0 | 0 |
| 3793 | 0 | 0 |
| 3794 | 0 | 0 |
| 3795 | 2.4 | 2.4 |
| 3796 | 6.3 | 6.3 |
| 3797 | 14.7 | 14.7 |
| 3798 | 29.1 | 29.1 |
| 3799 | 44.1 | 44.1 |
| 3800 | 58.1 | 58.1 |
| 3801 | 69.6 | 69.6 |
| 3802 | 77.4 | 77.4 |
| 3803 | 81.1 | 80 |
| 3804 | 80.2 | 80 |
| 3805 | 74.9 | 74.9 |
| 3806 | 65.4 | 65.4 |
| 3807 | 53 | 53 |
| 3808 | 38.6 | 38.6 |
| 3809 | 23.9 | 23.9 |
| 3810 | 10.8 | 10.8 |
| 3811 | 4.6 | 4.6 |
| 3812 | 0 | 0 |
| 3813 | 0 | 0 |
| 3814 | 0 | 0 |
| 3815 | 0 | 0 |
| 3816 | 0 | 0 |
| 3817 | 0 | 0 |
| 3818 | 0 | 0 |
| 3819 | 2.6 | 2.6 |
| 3820 | 6.4 | 6.4 |
| 3821 | 14.7 | 14.7 |
| 3822 | 29 | 29 |
| 3823 | 43.9 | 43.9 |
| 3824 | 57.8 | 57.8 |
| 3825 | 69.1 | 69.1 |
| 3826 | 77 | 77 |
| 3827 | 80.7 | 80 |
| 3828 | 79.8 | 79.8 |
| 3829 | 74.4 | 74.4 |
| 3830 | 65.1 | 65.1 |
| 3831 | 52.8 | 52.8 |
| 3832 | 38.4 | 38.4 |
| 3833 | 23.9 | 23.9 |
| 3834 | 10.8 | 10.8 |
| 3835 | 4.7 | 4.7 |
| 3836 | 0 | 0 |
| 3837 | 0 | 0 |
| 3838 | 0 | 0 |
| 3839 | 0 | 0 |
| 3840 | 0 | 0 |
| 3841 | 0 | 0 |
| 3842 | 0 | 0 |
| 3843 | 2.6 | 2.6 |
| 3844 | 6.3 | 6.3 |
| 3845 | 15.3 | 15.3 |
| 3846 | 31.6 | 31.6 |
| 3847 | 48.6 | 48.6 |
| 3848 | 64.4 | 64.4 |
| 3849 | 77.6 | 77.6 |
| 3850 | 86.6 | 80 |
| 3851 | 90.8 | 80 |
| 3852 | 89.8 | 80 |
| 3853 | 83.7 | 80 |
| 3854 | 73.1 | 73.1 |
| 3855 | 58.9 | 58.9 |
| 3856 | 42.7 | 42.7 |
| 3857 | 26 | 26 |
| 3858 | 11.2 | 11.2 |
| 3859 | 4.7 | 4.7 |
| 3860 | 0 | 0 |
| 3861 | 0 | 0 |
| 3862 | 0 | 0 |
| 3863 | 0 | 0 |
| 3864 | 0 | 0 |
| 3865 | 0 | 0 |
| 3866 | 0 | 0 |
| 3867 | 2.4 | 2.4 |
| 3868 | 6.2 | 6.2 |
| 3869 | 13.1 | 13.1 |
| 3870 | 23.8 | 23.8 |
| 3871 | 34.9 | 34.9 |
| 3872 | 45.2 | 45.2 |
| 3873 | 53.7 | 53.7 |
| 3874 | 59.6 | 59.6 |
| 3875 | 62.2 | 62.2 |
| 3876 | 61.6 | 61.6 |
| 3877 | 57.7 | 57.7 |
| 3878 | 50.8 | 50.8 |
| 3879 | 41.6 | 41.6 |
| 3880 | 30.9 | 30.9 |
| 3881 | 20 | 20 |
| 3882 | 10 | 10 |
| 3883 | 4.6 | 4.6 |
| 3884 | 0 | 0 |
| 3885 | 0 | 0 |
| 3886 | 0 | 0 |
| 3887 | 0 | 0 |
| 3888 | 0 | 0 |
| 3889 | 0 | 0 |
| 3890 | 0 | 0 |
| 3891 | 2.6 | 2.6 |
| 3892 | 6.4 | 6.4 |
| 3893 | 14 | 14 |
| 3894 | 26.3 | 26.3 |
| 3895 | 39.3 | 39.3 |
| 3896 | 51.2 | 51.2 |
| 3897 | 61.1 | 61.1 |
| 3898 | 67.9 | 67.9 |
| 3899 | 71.1 | 71.1 |
| 3900 | 70.3 | 70.3 |
| 3901 | 65.8 | 65.8 |
| 3902 | 57.8 | 57.8 |
| 3903 | 47.1 | 47.1 |
| 3904 | 34.8 | 34.8 |
| 3905 | 22.1 | 22.1 |
| 3906 | 10.7 | 10.7 |
| 3907 | 4.8 | 4.8 |
| 3908 | 1.2 | 1.2 |
| 3909 | 0 | 0 |
| 3910 | 0 | 0 |
| 3911 | 0 | 0 |
| 3912 | 0 | 0 |
| 3913 | 0 | 0 |
| 3914 | 0 | 0 |
| 3915 | 2.7 | 2.7 |
| 3916 | 6.4 | 6.4 |
| 3917 | 14.7 | 14.7 |
| 3918 | 28.7 | 28.7 |
| 3919 | 43.3 | 43.3 |
| 3920 | 57 | 57 |
| 3921 | 68.2 | 68.2 |
| 3922 | 76 | 76 |
| 3923 | 79.7 | 79.7 |
| 3924 | 78.8 | 78.8 |
| 3925 | 73.7 | 73.7 |
| 3926 | 64.6 | 64.6 |
| 3927 | 52.4 | 52.4 |
| 3928 | 38.4 | 38.4 |
| 3929 | 24.1 | 24.1 |
| 3930 | 11.2 | 11.2 |
| 3931 | 4.9 | 4.9 |
| 3932 | 1.2 | 1.2 |
| 3933 | 0 | 0 |
| 3934 | 0 | 0 |
| 3935 | 0 | 0 |
| 3936 | 0 | 0 |
| 3937 | 0 | 0 |
| 3938 | 0 | 0 |
| 3939 | 2.7 | 2.7 |
| 3940 | 6.4 | 6.4 |
| 3941 | 14.8 | 14.8 |
| 3942 | 29.1 | 29.1 |
| 3943 | 44.1 | 44.1 |
| 3944 | 58.1 | 58.1 |
| 3945 | 69.6 | 69.6 |
| 3946 | 77.6 | 77.6 |
| 3947 | 81.3 | 80 |
| 3948 | 80.4 | 80 |
| 3949 | 75.2 | 75.2 |
| 3950 | 65.9 | 65.9 |
| 3951 | 53.6 | 53.6 |
| 3952 | 39.2 | 39.2 |
| 3953 | 24.6 | 24.6 |
| 3954 | 11.3 | 11.3 |
| 3955 | 4.9 | 4.9 |
| 3956 | 1.3 | 1.3 |
| 3957 | 0 | 0 |
| 3958 | 0 | 0 |
| 3959 | 0 | 0 |
| 3960 | 0 | 0 |
| 3961 | 0 | 0 |
| 3962 | 0 | 0 |
| 3963 | 2.7 | 2.7 |
| 3964 | 6.6 | 6.6 |
| 3965 | 14.8 | 14.8 |
| 3966 | 29.1 | 29.1 |
| 3967 | 44 | 44 |
| 3968 | 58 | 58 |
| 3969 | 69.4 | 69.4 |
| 3970 | 77.4 | 77.4 |
| 3971 | 81.2 | 80 |
| 3972 | 80.4 | 80 |
| 3973 | 75.1 | 75.1 |
| 3974 | 65.9 | 65.9 |
| 3975 | 53.6 | 53.6 |
| 3976 | 39.2 | 39.2 |
| 3977 | 24.7 | 24.7 |
| 3978 | 11.4 | 11.4 |
| 3979 | 4.9 | 4.9 |
| 3980 | 1.3 | 1.3 |
| 3981 | 0 | 0 |
| 3982 | 0 | 0 |
| 3983 | 0 | 0 |
| 3984 | 0 | 0 |
| 3985 | 0 | 0 |
| 3986 | 0 | 0 |
| 3987 | 2.3 | 2.3 |
| 3988 | 6 | 6 |
| 3989 | 12.2 | 12.2 |
| 3990 | 21.7 | 21.7 |
| 3991 | 31.3 | 31.3 |
| 3992 | 40.2 | 40.2 |
| 3993 | 47.6 | 47.6 |
| 3994 | 52.7 | 52.7 |
| 3995 | 55.1 | 55.1 |
| 3996 | 54.6 | 54.6 |
| 3997 | 51.2 | 51.2 |
| 3998 | 45.2 | 45.2 |
| 3999 | 37.3 | 37.3 |
| 4000 | 28.1 | 28.1 |
| 4001 | 18.6 | 18.6 |
| 4002 | 9.8 | 9.8 |
| 4003 | 4.6 | 4.6 |
| 4004 | 1.2 | 1.2 |
| 4005 | 0 | 0 |
| 4006 | 0 | 0 |
| 4007 | 0 | 0 |
| 4008 | 0 | 0 |
| 4009 | 0 | 0 |
| 4010 | 0 | 0 |
| 4011 | 2.7 | 2.7 |
| 4012 | 6.1 | 6.1 |
| 4013 | 15.8 | 15.8 |
| 4014 | 34.3 | 34.3 |
| 4015 | 53.9 | 53.9 |
| 4016 | 72.2 | 72.2 |
| 4017 | 87.3 | 80 |
| 4018 | 98 | 80 |
| 4019 | 100 | 80 |
| 4020 | 100 | 80 |
| 4021 | 95.1 | 80 |
| 4022 | 83 | 80 |
| 4023 | 66.8 | 66.8 |
| 4024 | 48.1 | 48.1 |
| 4025 | 29 | 29 |
| 4026 | 12 | 12 |
| 4027 | 4.8 | 4.8 |
| 4028 | 1.3 | 1.3 |
| 4029 | 0 | 0 |
| 4030 | 0 | 0 |
| 4031 | 0 | 0 |
| 4032 | 0 | 0 |
| 4033 | 0 | 0 |
| 4034 | 0 | 0 |
| 4035 | 2.7 | 2.7 |
| 4036 | 6.4 | 6.4 |
| 4037 | 15.2 | 15.2 |
| 4038 | 31.1 | 31.1 |
| 4039 | 47.8 | 47.8 |
| 4040 | 63.3 | 63.3 |
| 4041 | 76.2 | 76.2 |
| 4042 | 85.2 | 80 |
| 4043 | 89.4 | 80 |
| 4044 | 88.7 | 80 |
| 4045 | 82.8 | 80 |
| 4046 | 72.6 | 72.6 |
| 4047 | 58.8 | 58.8 |
| 4048 | 42.9 | 42.9 |
| 4049 | 26.6 | 26.6 |
| 4050 | 11.9 | 11.9 |
| 4051 | 5 | 5 |
| 4052 | 1.4 | 1.4 |
| 4053 | 0 | 0 |
| 4054 | 0 | 0 |
| 4055 | 0 | 0 |
| 4056 | 0 | 0 |
| 4057 | 0 | 0 |
| 4058 | 0 | 0 |
| 4059 | 2.4 | 2.4 |
| 4060 | 6.2 | 6.2 |
| 4061 | 12.9 | 12.9 |
| 4062 | 23.4 | 23.4 |
| 4063 | 34.3 | 34.3 |
| 4064 | 44.3 | 44.3 |
| 4065 | 52.7 | 52.7 |
| 4066 | 58.4 | 58.4 |
| 4067 | 61.2 | 61.2 |
| 4068 | 60.7 | 60.7 |
| 4069 | 56.9 | 56.9 |
| 4070 | 50.2 | 50.2 |
| 4071 | 41.3 | 41.3 |
| 4072 | 31 | 31 |
| 4073 | 20.2 | 20.2 |
| 4074 | 10.4 | 10.4 |
| 4075 | 4.8 | 4.8 |
| 4076 | 1.3 | 1.3 |
| 4077 | 0 | 0 |
| 4078 | 0 | 0 |
| 4079 | 0 | 0 |
| 4080 | 0 | 0 |
| 4081 | 0 | 0 |
| 4082 | 0 | 0 |
| 4083 | 2.6 | 2.6 |
| 4084 | 6.4 | 6.4 |
| 4085 | 14 | 14 |
| 4086 | 26.6 | 26.6 |
| 4087 | 39.8 | 39.8 |
| 4088 | 52 | 52 |
| 4089 | 62.1 | 62.1 |
| 4090 | 69.1 | 69.1 |
| 4091 | 72.6 | 72.6 |
| 4092 | 71.9 | 71.9 |
| 4093 | 67.3 | 67.3 |
| 4094 | 59.2 | 59.2 |
| 4095 | 48.4 | 48.4 |
| 4096 | 35.9 | 35.9 |
| 4097 | 23 | 23 |
| 4098 | 11.2 | 11.2 |
| 4099 | 5 | 5 |
| 4100 | 1.4 | 1.4 |
| 4101 | 0 | 0 |
| 4102 | 0 | 0 |
| 4103 | 0 | 0 |
| 4104 | 0 | 0 |
| 4105 | 0 | 0 |
| 4106 | 0 | 0 |
| 4107 | 2.7 | 2.7 |
| 4108 | 6.4 | 6.4 |
| 4109 | 14.7 | 14.7 |
| 4110 | 29 | 29 |
| 4111 | 44 | 44 |
| 4112 | 58 | 58 |
| 4113 | 69.6 | 69.6 |
| 4114 | 77.7 | 77.7 |
| 4115 | 81.4 | 80 |
| 4116 | 80.8 | 80 |
| 4117 | 75.7 | 75.7 |
| 4118 | 66.4 | 66.4 |
| 4119 | 54.1 | 54.1 |
| 4120 | 39.8 | 39.8 |
| 4121 | 25.1 | 25.1 |
| 4122 | 11.8 | 11.8 |
| 4123 | 5.1 | 5.1 |
| 4124 | 1.4 | 1.4 |
| 4125 | 0 | 0 |
| 4126 | 0 | 0 |
| 4127 | 0 | 0 |
| 4128 | 0 | 0 |
| 4129 | 0 | 0 |
| 4130 | 0 | 0 |
| 4131 | 2.4 | 2.4 |
| 4132 | 6.2 | 6.2 |
| 4133 | 13 | 13 |
| 4134 | 23.7 | 23.7 |
| 4135 | 34.7 | 34.7 |
| 4136 | 45 | 45 |
| 4137 | 53.6 | 53.6 |
| 4138 | 59.4 | 59.4 |
| 4139 | 62.3 | 62.3 |
| 4140 | 61.8 | 61.8 |
| 4141 | 58 | 58 |
| 4142 | 51.2 | 51.2 |
| 4143 | 42.1 | 42.1 |
| 4144 | 31.6 | 31.6 |
| 4145 | 20.7 | 20.7 |
| 4146 | 10.7 | 10.7 |
| 4147 | 4.9 | 4.9 |
| 4148 | 1.3 | 1.3 |
| 4149 | 0 | 0 |
| 4150 | 0 | 0 |
| 4151 | 0 | 0 |
| 4152 | 0 | 0 |
| 4153 | 0 | 0 |
| 4154 | 0 | 0 |
| 4155 | 2.7 | 2.7 |
| 4156 | 6.4 | 6.4 |
| 4157 | 14.3 | 14.3 |
| 4158 | 28.2 | 28.2 |
| 4159 | 42.8 | 42.8 |
| 4160 | 56.3 | 56.3 |
| 4161 | 67.6 | 67.6 |
| 4162 | 75.3 | 75.3 |
| 4163 | 79.1 | 79.1 |
| 4164 | 78.4 | 78.4 |
| 4165 | 73.4 | 73.4 |
| 4166 | 64.7 | 64.7 |
| 4167 | 52.7 | 52.7 |
| 4168 | 38.9 | 38.9 |
| 4169 | 24.7 | 24.7 |
| 4170 | 11.7 | 11.7 |
| 4171 | 5.1 | 5.1 |
| 4172 | 1.4 | 1.4 |
| 4173 | 0 | 0 |
| 4174 | 0 | 0 |
| 4175 | 0 | 0 |
| 4176 | 0 | 0 |
| 4177 | 0 | 0 |
| 4178 | 0 | 0 |
| 4179 | 2.6 | 2.6 |
| 4180 | 6.3 | 6.3 |
| 4181 | 13.7 | 13.7 |
| 4182 | 26 | 26 |
| 4183 | 38.9 | 38.9 |
| 4184 | 50.9 | 50.9 |
| 4185 | 60.8 | 60.8 |
| 4186 | 67.8 | 67.8 |
| 4187 | 71 | 71 |
| 4188 | 70.4 | 70.4 |
| 4189 | 66.1 | 66.1 |
| 4190 | 58.2 | 58.2 |
| 4191 | 47.8 | 47.8 |
| 4192 | 35.4 | 35.4 |
| 4193 | 22.8 | 22.8 |
| 4194 | 11.3 | 11.3 |
| 4195 | 5 | 5 |
| 4196 | 1.4 | 1.4 |
| 4197 | 0 | 0 |
| 4198 | 0 | 0 |
| 4199 | 0 | 0 |
| 4200 | 0 | 0 |
| 4201 | 0 | 0 |
| 4202 | 0 | 0 |
| 4203 | 2.4 | 2.4 |
| 4204 | 6.2 | 6.2 |
| 4205 | 12.9 | 12.9 |
| 4206 | 23.8 | 23.8 |
| 4207 | 35 | 35 |
| 4208 | 45.6 | 45.6 |
| 4209 | 54.2 | 54.2 |
| 4210 | 60.3 | 60.3 |
| 4211 | 63.2 | 63.2 |
| 4212 | 62.7 | 62.7 |
| 4213 | 58.9 | 58.9 |
| 4214 | 52 | 52 |
| 4215 | 42.8 | 42.8 |
| 4216 | 32.1 | 32.1 |
| 4217 | 21 | 21 |
| 4218 | 10.8 | 10.8 |
| 4219 | 4.9 | 4.9 |
| 4220 | 1.3 | 1.3 |
| 4221 | 0 | 0 |
| 4222 | 0 | 0 |
| 4223 | 0 | 0 |
| 4224 | 0 | 0 |
| 4225 | 0 | 0 |
| 4226 | 0 | 0 |
| 4227 | 2.4 | 2.4 |
| 4228 | 6.2 | 6.2 |
| 4229 | 13 | 13 |
| 4230 | 24.2 | 24.2 |
| 4231 | 35.9 | 35.9 |
| 4232 | 46.8 | 46.8 |
| 4233 | 55.8 | 55.8 |
| 4234 | 62 | 62 |
| 4235 | 65 | 65 |
| 4236 | 64.6 | 64.6 |
| 4237 | 60.6 | 60.6 |
| 4238 | 53.6 | 53.6 |
| 4239 | 44 | 44 |
| 4240 | 32.9 | 32.9 |
| 4241 | 21.4 | 21.4 |
| 4242 | 10.9 | 10.9 |
| 4243 | 4.9 | 4.9 |
| 4244 | 1.4 | 1.4 |
| 4245 | 0 | 0 |
| 4246 | 0 | 0 |
| 4247 | 0 | 0 |
| 4248 | 0 | 0 |
| 4249 | 0 | 0 |
| 4250 | 0 | 0 |
| 4251 | 2.4 | 2.4 |
| 4252 | 6.3 | 6.3 |
| 4253 | 13.6 | 13.6 |
| 4254 | 26.1 | 26.1 |
| 4255 | 39.2 | 39.2 |
| 4256 | 51.3 | 51.3 |
| 4257 | 61.6 | 61.6 |
| 4258 | 68.6 | 68.6 |
| 4259 | 72 | 72 |
| 4260 | 71.4 | 71.4 |
| 4261 | 67 | 67 |
| 4262 | 59.1 | 59.1 |
| 4263 | 48.4 | 48.4 |
| 4264 | 36 | 36 |
| 4265 | 23.1 | 23.1 |
| 4266 | 11.4 | 11.4 |
| 4267 | 5 | 5 |
| 4268 | 1.4 | 1.4 |
| 4269 | 0 | 0 |
| 4270 | 0 | 0 |
| 4271 | 0 | 0 |
| 4272 | 0 | 0 |
| 4273 | 0 | 0 |
| 4274 | 0 | 0 |
| 4275 | 2.4 | 2.4 |
| 4276 | 6.3 | 6.3 |
| 4277 | 13.8 | 13.8 |
| 4278 | 26.9 | 26.9 |
| 4279 | 40.6 | 40.6 |
| 4280 | 53.4 | 53.4 |
| 4281 | 64.1 | 64.1 |
| 4282 | 71.6 | 71.6 |
| 4283 | 75.1 | 75.1 |
| 4284 | 74.6 | 74.6 |
| 4285 | 70 | 70 |
| 4286 | 61.7 | 61.7 |
| 4287 | 50.4 | 50.4 |
| 4288 | 37.3 | 37.3 |
| 4289 | 23.9 | 23.9 |
| 4290 | 11.6 | 11.6 |
| 4291 | 5.1 | 5.1 |
| 4292 | 1.4 | 1.4 |
| 4293 | 0 | 0 |
| 4294 | 0 | 0 |
| 4295 | 0 | 0 |
| 4296 | 0 | 0 |
| 4297 | 0 | 0 |
| 4298 | 0 | 0 |
| 4299 | 2.4 | 2.4 |
| 4300 | 6.2 | 6.2 |
| 4301 | 14.3 | 14.3 |
| 4302 | 29.9 | 29.9 |
| 4303 | 46.2 | 46.2 |
| 4304 | 61.6 | 61.6 |
| 4305 | 74.3 | 74.3 |
| 4306 | 83.2 | 80 |
| 4307 | 87.6 | 80 |
| 4308 | 87 | 80 |
| 4309 | 81.4 | 80 |
| 4310 | 71.6 | 71.6 |
| 4311 | 58.1 | 58.1 |
| 4312 | 42.6 | 42.6 |
| 4313 | 26.7 | 26.7 |
| 4314 | 12.1 | 12.1 |
| 4315 | 5.1 | 5.1 |
| 4316 | 1.4 | 1.4 |
| 4317 | 0 | 0 |
| 4318 | 0 | 0 |
| 4319 | 0 | 0 |
| 4320 | 0 | 0 |
| 4321 | 0 | 0 |
| 4322 | 0 | 0 |
| 4323 | 2.2 | 2.2 |
| 4324 | 5.9 | 5.9 |
| 4325 | 12.3 | 12.3 |
| 4326 | 22.7 | 22.7 |
| 4327 | 33.4 | 33.4 |
| 4328 | 43.4 | 43.4 |
| 4329 | 51.8 | 51.8 |
| 4330 | 57.6 | 57.6 |
| 4331 | 60.4 | 60.4 |
| 4332 | 60 | 60 |
| 4333 | 56.4 | 56.4 |
| 4334 | 49.9 | 49.9 |
| 4335 | 41.1 | 41.1 |
| 4336 | 30.9 | 30.9 |
| 4337 | 20.3 | 20.3 |
| 4338 | 10.6 | 10.6 |
| 4339 | 4.8 | 4.8 |
| 4340 | 1.3 | 1.3 |
| 4341 | 0 | 0 |
| 4342 | 0 | 0 |
| 4343 | 0 | 0 |
| 4344 | 0 | 0 |
| 4345 | 0 | 0 |
| 4346 | 0 | 0 |
| 4347 | 2.3 | 2.3 |
| 4348 | 6.1 | 6.1 |
| 4349 | 13.2 | 13.2 |
| 4350 | 25.8 | 25.8 |
| 4351 | 38.9 | 38.9 |
| 4352 | 51.2 | 51.2 |
| 4353 | 61.4 | 61.4 |
| 4354 | 68.7 | 68.7 |
| 4355 | 72.1 | 72.1 |
| 4356 | 71.7 | 71.7 |
| 4357 | 67.2 | 67.2 |
| 4358 | 59.3 | 59.3 |
| 4359 | 48.6 | 48.6 |
| 4360 | 36.1 | 36.1 |
| 4361 | 23.1 | 23.1 |
| 4362 | 11.3 | 11.3 |
| 4363 | 5 | 5 |
| 4364 | 1.3 | 1.3 |
| 4365 | 0 | 0 |
| 4366 | 0 | 0 |
| 4367 | 0 | 0 |
| 4368 | 0 | 0 |
| 4369 | 0 | 0 |
| 4370 | 0 | 0 |
| 4371 | 2.2 | 2.2 |
| 4372 | 6 | 6 |
| 4373 | 12.9 | 12.9 |
| 4374 | 24.8 | 24.8 |
| 4375 | 37.2 | 37.2 |
| 4376 | 48.9 | 48.9 |
| 4377 | 58.6 | 58.6 |
| 4378 | 65.3 | 65.3 |
| 4379 | 68.7 | 68.7 |
| 4380 | 68.2 | 68.2 |
| 4381 | 64.1 | 64.1 |
| 4382 | 56.6 | 56.6 |
| 4383 | 46.4 | 46.4 |
| 4384 | 34.6 | 34.6 |
| 4385 | 22.3 | 22.3 |
| 4386 | 11.1 | 11.1 |
| 4387 | 4.9 | 4.9 |
| 4388 | 1.3 | 1.3 |
| 4389 | 0 | 0 |
| 4390 | 0 | 0 |
| 4391 | 0 | 0 |
| 4392 | 0 | 0 |
| 4393 | 0 | 0 |
| 4394 | 0 | 0 |
| 4395 | 2 | 2 |
| 4396 | 5.7 | 5.7 |
| 4397 | 11.8 | 11.8 |
| 4398 | 21.8 | 21.8 |
| 4399 | 32.1 | 32.1 |
| 4400 | 41.7 | 41.7 |
| 4401 | 49.8 | 49.8 |
| 4402 | 55.3 | 55.3 |
| 4403 | 58.1 | 58.1 |
| 4404 | 57.7 | 57.7 |
| 4405 | 54.2 | 54.2 |
| 4406 | 48.1 | 48.1 |
| 4407 | 39.7 | 39.7 |
| 4408 | 29.9 | 29.9 |
| 4409 | 19.7 | 19.7 |
| 4410 | 10.2 | 10.2 |
| 4411 | 4.7 | 4.7 |
| 4412 | 1.2 | 1.2 |
| 4413 | 0 | 0 |
| 4414 | 0 | 0 |
| 4415 | 0 | 0 |
| 4416 | 0 | 0 |
| 4417 | 0 | 0 |
| 4418 | 0 | 0 |
| 4419 | 2.1 | 2.1 |
| 4420 | 5.8 | 5.8 |
| 4421 | 14.2 | 14.2 |
| 4422 | 32.1 | 32.1 |
| 4423 | 51.1 | 51.1 |
| 4424 | 69.1 | 69.1 |
| 4425 | 84 | 80 |
| 4426 | 94.7 | 80 |
| 4427 | 99.8 | 80 |
| 4428 | 99.2 | 80 |
| 4429 | 92.8 | 80 |
| 4430 | 81.2 | 80 |
| 4431 | 65.7 | 65.7 |
| 4432 | 47.6 | 47.6 |
| 4433 | 29 | 29 |
| 4434 | 12.3 | 12.3 |
| 4435 | 4.8 | 4.8 |
| 4436 | 1.2 | 1.2 |
| 4437 | 0 | 0 |
| 4438 | 0 | 0 |
| 4439 | 0 | 0 |
| 4440 | 0 | 0 |
| 4441 | 0 | 0 |
| 4442 | 0 | 0 |
| 4443 | 2.1 | 2.1 |
| 4444 | 5.9 | 5.9 |
| 4445 | 13.7 | 13.7 |
| 4446 | 28.9 | 28.9 |
| 4447 | 44.9 | 44.9 |
| 4448 | 60.1 | 60.1 |
| 4449 | 72.7 | 72.7 |
| 4450 | 81.6 | 80 |
| 4451 | 85.9 | 80 |
| 4452 | 85.4 | 80 |
| 4453 | 80.1 | 80 |
| 4454 | 70.3 | 70.3 |
| 4455 | 57.2 | 57.2 |
| 4456 | 41.9 | 41.9 |
| 4457 | 26.2 | 26.2 |
| 4458 | 12 | 12 |
| 4459 | 4.9 | 4.9 |
| 4460 | 1.2 | 1.2 |
| 4461 | 0 | 0 |
| 4462 | 0 | 0 |
| 4463 | 0 | 0 |
| 4464 | 0 | 0 |
| 4465 | 0 | 0 |
| 4466 | 0 | 0 |
| 4467 | 2 | 2 |
| 4468 | 5.7 | 5.7 |
| 4469 | 12 | 12 |
| 4470 | 22.9 | 22.9 |
| 4471 | 34.2 | 34.2 |
| 4472 | 44.9 | 44.9 |
| 4473 | 53.8 | 53.8 |
| 4474 | 60 | 60 |
| 4475 | 63 | 63 |
| 4476 | 62.7 | 62.7 |
| 4477 | 58.9 | 58.9 |
| 4478 | 52.1 | 52.1 |
| 4479 | 42.9 | 42.9 |
| 4480 | 32 | 32 |
| 4481 | 20.8 | 20.8 |
| 4482 | 10.6 | 10.6 |
| 4483 | 4.7 | 4.7 |
| 4484 | 1.1 | 1.1 |
| 4485 | 0 | 0 |
| 4486 | 0 | 0 |
| 4487 | 0 | 0 |
| 4488 | 0 | 0 |
| 4489 | 0 | 0 |
| 4490 | 0 | 0 |
| 4491 | 2 | 2 |
| 4492 | 5.8 | 5.8 |
| 4493 | 12.8 | 12.8 |
| 4494 | 25.7 | 25.7 |
| 4495 | 39.2 | 39.2 |
| 4496 | 52 | 52 |
| 4497 | 62.7 | 62.7 |
| 4498 | 70.1 | 70.1 |
| 4499 | 73.8 | 73.8 |
| 4500 | 73.4 | 73.4 |
| 4501 | 68.9 | 68.9 |
| 4502 | 60.8 | 60.8 |
| 4503 | 49.7 | 49.7 |
| 4504 | 36.8 | 36.8 |
| 4505 | 23.4 | 23.4 |
| 4506 | 11.2 | 11.2 |
| 4507 | 4.8 | 4.8 |
| 4508 | 0 | 0 |
| 4509 | 0 | 0 |
| 4510 | 0 | 0 |
| 4511 | 0 | 0 |
| 4512 | 0 | 0 |
| 4513 | 0 | 0 |
| 4514 | 0 | 0 |
| 4515 | 0 | 0 |
| 4516 | 5.8 | 5.8 |
| 4517 | 12.8 | 12.8 |
| 4518 | 25.9 | 25.9 |
| 4519 | 39.9 | 39.9 |
| 4520 | 53 | 53 |
| 4521 | 63.9 | 63.9 |
| 4522 | 71.7 | 71.7 |
| 4523 | 75.4 | 75.4 |
| 4524 | 75 | 75 |
| 4525 | 70.3 | 70.3 |
| 4526 | 62 | 62 |
| 4527 | 50.7 | 50.7 |
| 4528 | 37.4 | 37.4 |
| 4529 | 23.8 | 23.8 |
| 4530 | 11.3 | 11.3 |
| 4531 | 4.8 | 4.8 |
| 4532 | 0 | 0 |
| 4533 | 0 | 0 |
| 4534 | 0 | 0 |
| 4535 | 0 | 0 |
| 4536 | 0 | 0 |
| 4537 | 0 | 0 |
| 4538 | 0 | 0 |
| 4539 | 0 | 0 |
| 4540 | 5.7 | 5.7 |
| 4541 | 12.4 | 12.4 |
| 4542 | 25 | 25 |
| 4543 | 38.4 | 38.4 |
| 4544 | 50.9 | 50.9 |
| 4545 | 61.3 | 61.3 |
| 4546 | 68.8 | 68.8 |
| 4547 | 72.3 | 72.3 |
| 4548 | 72 | 72 |
| 4549 | 67.6 | 67.6 |
| 4550 | 59.6 | 59.6 |
| 4551 | 48.8 | 48.8 |
| 4552 | 36.1 | 36.1 |
| 4553 | 23 | 23 |
| 4554 | 11 | 11 |
| 4555 | 4.7 | 4.7 |
| 4556 | 0 | 0 |
| 4557 | 0 | 0 |
| 4558 | 0 | 0 |
| 4559 | 0 | 0 |
| 4560 | 0 | 0 |
| 4561 | 0 | 0 |
| 4562 | 0 | 0 |
| 4563 | 0 | 0 |
| 4564 | 5.6 | 5.6 |
| 4565 | 12.9 | 12.9 |
| 4566 | 27.6 | 27.6 |
| 4567 | 43.1 | 43.1 |
| 4568 | 57.8 | 57.8 |
| 4569 | 70 | 70 |
| 4570 | 78.7 | 78.7 |
| 4571 | 83 | 80 |
| 4572 | 82.6 | 80 |
| 4573 | 77.4 | 77.4 |
| 4574 | 68 | 68 |
| 4575 | 55.3 | 55.3 |
| 4576 | 40.6 | 40.6 |
| 4577 | 25.3 | 25.3 |
| 4578 | 11.6 | 11.6 |
| 4579 | 4.7 | 4.7 |
| 4580 | 0 | 0 |
| 4581 | 0 | 0 |
| 4582 | 0 | 0 |
| 4583 | 0 | 0 |
| 4584 | 0 | 0 |
| 4585 | 0 | 0 |
| 4586 | 0 | 0 |
| 4587 | 0 | 0 |
| 4588 | 5.4 | 5.4 |
| 4589 | 13.1 | 13.1 |
| 4590 | 30.2 | 30.2 |
| 4591 | 48.4 | 48.4 |
| 4592 | 65.8 | 65.8 |
| 4593 | 80.2 | 80 |
| 4594 | 90.6 | 80 |
| 4595 | 95.6 | 80 |
| 4596 | 95.1 | 80 |
| 4597 | 89 | 80 |
| 4598 | 78 | 78 |
| 4599 | 63 | 63 |
| 4600 | 45.7 | 45.7 |
| 4601 | 27.9 | 27.9 |
| 4602 | 11.9 | 11.9 |
| 4603 | 4.6 | 4.6 |
| 4604 | 0 | 0 |
| 4605 | 0 | 0 |
| 4606 | 0 | 0 |
| 4607 | 0 | 0 |
| 4608 | 0 | 0 |
| 4609 | 0 | 0 |
| 4610 | 0 | 0 |
| 4611 | 0 | 0 |
| 4612 | 5.4 | 5.4 |
| 4613 | 12.2 | 12.2 |
| 4614 | 25.4 | 25.4 |
| 4615 | 39.6 | 39.6 |
| 4616 | 52.8 | 52.8 |
| 4617 | 63.9 | 63.9 |
| 4618 | 71.7 | 71.7 |
| 4619 | 75.6 | 75.6 |
| 4620 | 75.2 | 75.2 |
| 4621 | 70.6 | 70.6 |
| 4622 | 62.1 | 62.1 |
| 4623 | 50.7 | 50.7 |
| 4624 | 37.3 | 37.3 |
| 4625 | 23.6 | 23.6 |
| 4626 | 11 | 11 |
| 4627 | 4.6 | 4.6 |
| 4628 | 0 | 0 |
| 4629 | 0 | 0 |
| 4630 | 0 | 0 |
| 4631 | 0 | 0 |
| 4632 | 0 | 0 |
| 4633 | 0 | 0 |
| 4634 | 0 | 0 |
| 4635 | 0 | 0 |
| 4636 | 5.3 | 5.3 |
| 4637 | 12.1 | 12.1 |
| 4638 | 25.4 | 25.4 |
| 4639 | 39.7 | 39.7 |
| 4640 | 53 | 53 |
| 4641 | 64.2 | 64.2 |
| 4642 | 72.1 | 72.1 |
| 4643 | 76 | 76 |
| 4644 | 75.7 | 75.7 |
| 4645 | 71 | 71 |
| 4646 | 62.6 | 62.6 |
| 4647 | 50.9 | 50.9 |
| 4648 | 37.4 | 37.4 |
| 4649 | 23.6 | 23.6 |
| 4650 | 10.9 | 10.9 |
| 4651 | 4.4 | 4.4 |
| 4652 | 0 | 0 |
| 4653 | 0 | 0 |
| 4654 | 0 | 0 |
| 4655 | 0 | 0 |
| 4656 | 0 | 0 |
| 4657 | 0 | 0 |
| 4658 | 0 | 0 |
| 4659 | 0 | 0 |
| 4660 | 5.2 | 5.2 |
| 4661 | 12.3 | 12.3 |
| 4662 | 27.3 | 27.3 |
| 4663 | 43.3 | 43.3 |
| 4664 | 58.4 | 58.4 |
| 4665 | 71.1 | 71.1 |
| 4666 | 80.1 | 80 |
| 4667 | 84.6 | 80 |
| 4668 | 84.1 | 80 |
| 4669 | 78.9 | 78.9 |
| 4670 | 69.2 | 69.2 |
| 4671 | 56.2 | 56.2 |
| 4672 | 41 | 41 |
| 4673 | 25.3 | 25.3 |
| 4674 | 11.2 | 11.2 |
| 4675 | 4.4 | 4.4 |
| 4676 | 0 | 0 |
| 4677 | 0 | 0 |
| 4678 | 0 | 0 |
| 4679 | 0 | 0 |
| 4680 | 0 | 0 |
| 4681 | 0 | 0 |
| 4682 | 0 | 0 |
| 4683 | 0 | 0 |
| 4684 | 5.2 | 5.2 |
| 4685 | 12.2 | 12.2 |
| 4686 | 27.6 | 27.6 |
| 4687 | 43.9 | 43.9 |
| 4688 | 59.4 | 59.4 |
| 4689 | 72.4 | 72.4 |
| 4690 | 81.6 | 80 |
| 4691 | 86.2 | 80 |
| 4692 | 85.8 | 80 |
| 4693 | 80.3 | 80 |
| 4694 | 70.6 | 70.6 |
| 4695 | 57.1 | 57.1 |
| 4696 | 41.6 | 41.6 |
| 4697 | 25.6 | 25.6 |
| 4698 | 11.1 | 11.1 |
| 4699 | 4.3 | 4.3 |
| 4700 | 0 | 0 |
| 4701 | 0 | 0 |
| 4702 | 0 | 0 |
| 4703 | 0 | 0 |
| 4704 | 0 | 0 |
| 4705 | 0 | 0 |
| 4706 | 0 | 0 |
| 4707 | 0 | 0 |
| 4708 | 5.1 | 5.1 |
| 4709 | 12 | 12 |
| 4710 | 26.6 | 26.6 |
| 4711 | 42.2 | 42.2 |
| 4712 | 57 | 57 |
| 4713 | 69.3 | 69.3 |
| 4714 | 78.1 | 78.1 |
| 4715 | 82.4 | 80 |
| 4716 | 82.1 | 80 |
| 4717 | 77 | 77 |
| 4718 | 67.6 | 67.6 |
| 4719 | 54.8 | 54.8 |
| 4720 | 40 | 40 |
| 4721 | 24.7 | 24.7 |
| 4722 | 10.9 | 10.9 |
| 4723 | 4.2 | 4.2 |
| 4724 | 0 | 0 |
| 4725 | 0 | 0 |
| 4726 | 0 | 0 |
| 4727 | 0 | 0 |
| 4728 | 0 | 0 |
| 4729 | 0 | 0 |
| 4730 | 0 | 0 |
| 4731 | 0 | 0 |
| 4732 | 5 | 5 |
| 4733 | 11.8 | 11.8 |
| 4734 | 26.1 | 26.1 |
| 4735 | 41.6 | 41.6 |
| 4736 | 56.1 | 56.1 |
| 4737 | 68.2 | 68.2 |
| 4738 | 76.9 | 76.9 |
| 4739 | 81.2 | 80 |
| 4740 | 80.8 | 80 |
| 4741 | 75.8 | 75.8 |
| 4742 | 66.6 | 66.6 |
| 4743 | 54 | 54 |
| 4744 | 39.3 | 39.3 |
| 4745 | 24.3 | 24.3 |
| 4746 | 10.8 | 10.8 |
| 4747 | 4.1 | 4.1 |
| 4748 | 0 | 0 |
| 4749 | 0 | 0 |
| 4750 | 0 | 0 |
| 4751 | 0 | 0 |
| 4752 | 0 | 0 |
| 4753 | 0 | 0 |
| 4754 | 0 | 0 |
| 4755 | 0 | 0 |
| 4756 | 4.9 | 4.9 |
| 4757 | 11.4 | 11.4 |
| 4758 | 25.4 | 25.4 |
| 4759 | 40.3 | 40.3 |
| 4760 | 54.4 | 54.4 |
| 4761 | 66.2 | 66.2 |
| 4762 | 74.7 | 74.7 |
| 4763 | 78.8 | 78.8 |
| 4764 | 78.4 | 78.4 |
| 4765 | 73.6 | 73.6 |
| 4766 | 64.6 | 64.6 |
| 4767 | 52.4 | 52.4 |
| 4768 | 38.2 | 38.2 |
| 4769 | 23.7 | 23.7 |
| 4770 | 10.6 | 10.6 |
| 4771 | 4.1 | 4.1 |
| 4772 | 0 | 0 |
| 4773 | 0 | 0 |
| 4774 | 0 | 0 |
| 4775 | 0 | 0 |
| 4776 | 0 | 0 |
| 4777 | 0 | 0 |
| 4778 | 0 | 0 |
| 4779 | 0 | 0 |
| 4780 | 4.7 | 4.7 |
| 4781 | 10.8 | 10.8 |
| 4782 | 22.6 | 22.6 |
| 4783 | 35.2 | 35.2 |
| 4784 | 47.1 | 47.1 |
| 4785 | 57.1 | 57.1 |
| 4786 | 64.1 | 64.1 |
| 4787 | 67.7 | 67.7 |
| 4788 | 67.3 | 67.3 |
| 4789 | 63.2 | 63.2 |
| 4790 | 55.7 | 55.7 |
| 4791 | 45.4 | 45.4 |
| 4792 | 33.4 | 33.4 |
| 4793 | 21 | 21 |
| 4794 | 9.8 | 9.8 |
| 4795 | 3.9 | 3.9 |
| 4796 | 0 | 0 |
| 4797 | 0 | 0 |
| 4798 | 0 | 0 |
| 4799 | 0 | 0 |
| 4800 | 0 | 0 |
| 4801 | 0 | 0 |
| 4802 | 0 | 0 |
| 4803 | 0 | 0 |
| 4804 | 4.7 | 4.7 |
| 4805 | 11.4 | 11.4 |
| 4806 | 27.9 | 27.9 |
| 4807 | 45.6 | 45.6 |
| 4808 | 62.3 | 62.3 |
| 4809 | 76.4 | 76.4 |
| 4810 | 86.4 | 80 |
| 4811 | 91.4 | 80 |
| 4812 | 91 | 80 |
| 4813 | 85.2 | 80 |
| 4814 | 74.6 | 74.6 |
| 4815 | 60.1 | 60.1 |
| 4816 | 43.2 | 43.2 |
| 4817 | 26 | 26 |
| 4818 | 10.7 | 10.7 |
| 4819 | 3.9 | 3.9 |
| 4820 | 0 | 0 |
| 4821 | 0 | 0 |
| 4822 | 0 | 0 |
| 4823 | 0 | 0 |
| 4824 | 0 | 0 |
| 4825 | 0 | 0 |
| 4826 | 0 | 0 |
| 4827 | 0 | 0 |
| 4828 | 4.6 | 4.6 |
| 4829 | 10.8 | 10.8 |
| 4830 | 23.9 | 23.9 |
| 4831 | 38 | 38 |
| 4832 | 51.3 | 51.3 |
| 4833 | 62.4 | 62.4 |
| 4834 | 70.3 | 70.3 |
| 4835 | 74.3 | 74.3 |
| 4836 | 74 | 74 |
| 4837 | 69.3 | 69.3 |
| 4838 | 60.9 | 60.9 |
| 4839 | 49.4 | 49.4 |
| 4840 | 36.1 | 36.1 |
| 4841 | 22.3 | 22.3 |
| 4842 | 9.9 | 9.9 |
| 4843 | 3.8 | 3.8 |
| 4844 | 0 | 0 |
| 4845 | 0 | 0 |
| 4846 | 0 | 0 |
| 4847 | 0 | 0 |
| 4848 | 0 | 0 |
| 4849 | 0 | 0 |
| 4850 | 0 | 0 |
| 4851 | 0 | 0 |
| 4852 | 4.4 | 4.4 |
| 4853 | 11.1 | 11.1 |
| 4854 | 28.1 | 28.1 |
| 4855 | 46.6 | 46.6 |
| 4856 | 64.1 | 64.1 |
| 4857 | 78.8 | 78.8 |
| 4858 | 89.2 | 80 |
| 4859 | 94.6 | 80 |
| 4860 | 94.1 | 80 |
| 4861 | 88 | 80 |
| 4862 | 76.9 | 76.9 |
| 4863 | 61.8 | 61.8 |
| 4864 | 44.2 | 44.2 |
| 4865 | 26.3 | 26.3 |
| 4866 | 10.4 | 10.4 |
| 4867 | 3.7 | 3.7 |
| 4868 | 0 | 0 |
| 4869 | 0 | 0 |
| 4870 | 0 | 0 |
| 4871 | 0 | 0 |
| 4872 | 0 | 0 |
| 4873 | 0 | 0 |
| 4874 | 0 | 0 |
| 4875 | 0 | 0 |
| 4876 | 4.3 | 4.3 |
| 4877 | 10.2 | 10.2 |
| 4878 | 22.7 | 22.7 |
| 4879 | 36 | 36 |
| 4880 | 48.6 | 48.6 |
| 4881 | 59.1 | 59.1 |
| 4882 | 66.7 | 66.7 |
| 4883 | 70.3 | 70.3 |
| 4884 | 70 | 70 |
| 4885 | 65.7 | 65.7 |
| 4886 | 57.7 | 57.7 |
| 4887 | 46.9 | 46.9 |
| 4888 | 34.2 | 34.2 |
| 4889 | 21.1 | 21.1 |
| 4890 | 9.4 | 9.4 |
| 4891 | 3.6 | 3.6 |
| 4892 | 0 | 0 |
| 4893 | 0 | 0 |
| 4894 | 0 | 0 |
| 4895 | 0 | 0 |
| 4896 | 0 | 0 |
| 4897 | 0 | 0 |
| 4898 | 0 | 0 |
| 4899 | 0 | 0 |
| 4900 | 4.2 | 4.2 |
| 4901 | 10.4 | 10.4 |
| 4902 | 24.4 | 24.4 |
| 4903 | 39.7 | 39.7 |
| 4904 | 54 | 54 |
| 4905 | 66 | 66 |
| 4906 | 74.6 | 74.6 |
| 4907 | 78.9 | 78.9 |
| 4908 | 78.6 | 78.6 |
| 4909 | 73.6 | 73.6 |
| 4910 | 64.4 | 64.4 |
| 4911 | 52 | 52 |
| 4912 | 37.7 | 37.7 |
| 4913 | 22.8 | 22.8 |
| 4914 | 9.7 | 9.7 |
| 4915 | 3.4 | 3.4 |
| 4916 | 0 | 0 |
| 4917 | 0 | 0 |
| 4918 | 0 | 0 |
| 4919 | 0 | 0 |
| 4920 | 0 | 0 |
| 4921 | 0 | 0 |
| 4922 | 0 | 0 |
| 4923 | 0 | 0 |
| 4924 | 4.1 | 4.1 |
| 4925 | 9.9 | 9.9 |
| 4926 | 22.3 | 22.3 |
| 4927 | 35.7 | 35.7 |
| 4928 | 48.2 | 48.2 |
| 4929 | 58.8 | 58.8 |
| 4930 | 66.3 | 66.3 |
| 4931 | 70 | 70 |
| 4932 | 69.7 | 69.7 |
| 4933 | 65.3 | 65.3 |
| 4934 | 57.3 | 57.3 |
| 4935 | 46.4 | 46.4 |
| 4936 | 33.8 | 33.8 |
| 4937 | 20.8 | 20.8 |
| 4938 | 9.1 | 9.1 |
| 4939 | 3.3 | 3.3 |
| 4940 | 0 | 0 |
| 4941 | 0 | 0 |
| 4942 | 0 | 0 |
| 4943 | 0 | 0 |
| 4944 | 0 | 0 |
| 4945 | 0 | 0 |
| 4946 | 0 | 0 |
| 4947 | 0 | 0 |
| 4948 | 4 | 4 |
| 4949 | 10.1 | 10.1 |
| 4950 | 24.4 | 24.4 |
| 4951 | 39.9 | 39.9 |
| 4952 | 54.6 | 54.6 |
| 4953 | 67 | 67 |
| 4954 | 75.7 | 75.7 |
| 4955 | 80.1 | 80 |
| 4956 | 79.7 | 79.7 |
| 4957 | 74.7 | 74.7 |
| 4958 | 65.3 | 65.3 |
| 4959 | 52.6 | 52.6 |
| 4960 | 37.9 | 37.9 |
| 4961 | 22.8 | 22.8 |
| 4962 | 9.3 | 9.3 |
| 4963 | 3.2 | 3.2 |
| 4964 | 0 | 0 |
| 4965 | 0 | 0 |
| 4966 | 0 | 0 |
| 4967 | 0 | 0 |
| 4968 | 0 | 0 |
| 4969 | 0 | 0 |
| 4970 | 0 | 0 |
| 4971 | 0 | 0 |
| 4972 | 3.9 | 3.9 |
| 4973 | 9.8 | 9.8 |
| 4974 | 23.1 | 23.1 |
| 4975 | 37.6 | 37.6 |
| 4976 | 51.2 | 51.2 |
| 4977 | 62.7 | 62.7 |
| 4978 | 70.8 | 70.8 |
| 4979 | 74.9 | 74.9 |
| 4980 | 74.6 | 74.6 |
| 4981 | 69.8 | 69.8 |
| 4982 | 61.1 | 61.1 |
| 4983 | 49.3 | 49.3 |
| 4984 | 35.6 | 35.6 |
| 4985 | 21.4 | 21.4 |
| 4986 | 9 | 9 |
| 4987 | 3.1 | 3.1 |
| 4988 | 0 | 0 |
| 4989 | 0 | 0 |
| 4990 | 0 | 0 |
| 4991 | 0 | 0 |
| 4992 | 0 | 0 |
| 4993 | 0 | 0 |
| 4994 | 0 | 0 |
| 4995 | 0 | 0 |
| 4996 | 3.8 | 3.8 |
| 4997 | 9.4 | 9.4 |
| 4998 | 22.1 | 22.1 |
| 4999 | 35.8 | 35.8 |
| 5000 | 48.8 | 48.8 |
| 5001 | 59.6 | 59.6 |
| 5002 | 67.3 | 67.3 |
| 5003 | 71.2 | 71.2 |
| 5004 | 70.8 | 70.8 |
| 5005 | 66.3 | 66.3 |
| 5006 | 58.1 | 58.1 |
| 5007 | 46.9 | 46.9 |
| 5008 | 33.9 | 33.9 |
| 5009 | 20.6 | 20.6 |
| 5010 | 8.7 | 8.7 |
| 5011 | 2.9 | 2.9 |
| 5012 | 0 | 0 |
| 5013 | 0 | 0 |
| 5014 | 0 | 0 |
| 5015 | 0 | 0 |
| 5016 | 0 | 0 |
| 5017 | 0 | 0 |
| 5018 | 0 | 0 |
| 5019 | 0 | 0 |
| 5020 | 3.7 | 3.7 |
| 5021 | 9.6 | 9.6 |
| 5022 | 24.1 | 24.1 |
| 5023 | 39.9 | 39.9 |
| 5024 | 54.9 | 54.9 |
| 5025 | 67.4 | 67.4 |
| 5026 | 76.4 | 76.4 |
| 5027 | 80.9 | 80 |
| 5028 | 80.6 | 80 |
| 5029 | 75.3 | 75.3 |
| 5030 | 65.8 | 65.8 |
| 5031 | 52.8 | 52.8 |
| 5032 | 37.8 | 37.8 |
| 5033 | 22.3 | 22.3 |
| 5034 | 8.8 | 8.8 |
| 5035 | 2.9 | 2.9 |
| 5036 | 0 | 0 |
| 5037 | 0 | 0 |
| 5038 | 0 | 0 |
| 5039 | 0 | 0 |
| 5040 | 0 | 0 |
| 5041 | 0 | 0 |
| 5042 | 0 | 0 |
| 5043 | 0 | 0 |
| 5044 | 3.4 | 3.4 |
| 5045 | 9.1 | 9.1 |
| 5046 | 21.8 | 21.8 |
| 5047 | 35.6 | 35.6 |
| 5048 | 48.7 | 48.7 |
| 5049 | 59.7 | 59.7 |
| 5050 | 67.4 | 67.4 |
| 5051 | 71.3 | 71.3 |
| 5052 | 71 | 71 |
| 5053 | 66.4 | 66.4 |
| 5054 | 58.1 | 58.1 |
| 5055 | 46.8 | 46.8 |
| 5056 | 33.7 | 33.7 |
| 5057 | 20.2 | 20.2 |
| 5058 | 8.2 | 8.2 |
| 5059 | 2.7 | 2.7 |
| 5060 | 0 | 0 |
| 5061 | 0 | 0 |
| 5062 | 0 | 0 |
| 5063 | 0 | 0 |
| 5064 | 0 | 0 |
| 5065 | 0 | 0 |
| 5066 | 0 | 0 |
| 5067 | 0 | 0 |
| 5068 | 3.4 | 3.4 |
| 5069 | 9.1 | 9.1 |
| 5070 | 23.7 | 23.7 |
| 5071 | 39.4 | 39.4 |
| 5072 | 54.4 | 54.4 |
| 5073 | 67.1 | 67.1 |
| 5074 | 76 | 76 |
| 5075 | 80.6 | 80 |
| 5076 | 80.1 | 80 |
| 5077 | 74.9 | 74.9 |
| 5078 | 65.3 | 65.3 |
| 5079 | 52.3 | 52.3 |
| 5080 | 37.2 | 37.2 |
| 5081 | 21.9 | 21.9 |
| 5082 | 8.3 | 8.3 |
| 5083 | 2.6 | 2.6 |
| 5084 | 0 | 0 |
| 5085 | 0 | 0 |
| 5086 | 0 | 0 |
| 5087 | 0 | 0 |
| 5088 | 0 | 0 |
| 5089 | 0 | 0 |
| 5090 | 0 | 0 |
| 5091 | 0 | 0 |
| 5092 | 3 | 3 |
| 5093 | 8 | 8 |
| 5094 | 17.9 | 17.9 |
| 5095 | 28.6 | 28.6 |
| 5096 | 38.7 | 38.7 |
| 5097 | 47.1 | 47.1 |
| 5098 | 53 | 53 |
| 5099 | 56 | 56 |
| 5100 | 55.8 | 55.8 |
| 5101 | 52.2 | 52.2 |
| 5102 | 45.8 | 45.8 |
| 5103 | 37.1 | 37.1 |
| 5104 | 26.9 | 26.9 |
| 5105 | 16.4 | 16.4 |
| 5106 | 7.1 | 7.1 |
| 5107 | 2.2 | 2.2 |
| 5108 | 0 | 0 |
| 5109 | 0 | 0 |
| 5110 | 0 | 0 |
| 5111 | 0 | 0 |
| 5112 | 0 | 0 |
| 5113 | 0 | 0 |
| 5114 | 0 | 0 |
| 5115 | 0 | 0 |
| 5116 | 3 | 3 |
| 5117 | 8 | 8 |
| 5118 | 18.6 | 18.6 |
| 5119 | 29.9 | 29.9 |
| 5120 | 40.7 | 40.7 |
| 5121 | 49.7 | 49.7 |
| 5122 | 56 | 56 |
| 5123 | 59.2 | 59.2 |
| 5124 | 58.9 | 58.9 |
| 5125 | 55.1 | 55.1 |
| 5126 | 48.3 | 48.3 |
| 5127 | 39 | 39 |
| 5128 | 28.1 | 28.1 |
| 5129 | 17 | 17 |
| 5130 | 7.1 | 7.1 |
| 5131 | 2.2 | 2.2 |
| 5132 | 0 | 0 |
| 5133 | 0 | 0 |
| 5134 | 0 | 0 |
| 5135 | 0 | 0 |
| 5136 | 0 | 0 |
| 5137 | 0 | 0 |
| 5138 | 0 | 0 |
| 5139 | 0 | 0 |
| 5140 | 2.9 | 2.9 |
| 5141 | 8 | 8 |
| 5142 | 18.9 | 18.9 |
| 5143 | 30.7 | 30.7 |
| 5144 | 41.9 | 41.9 |
| 5145 | 51.2 | 51.2 |
| 5146 | 57.9 | 57.9 |
| 5147 | 61.2 | 61.2 |
| 5148 | 60.9 | 60.9 |
| 5149 | 57 | 57 |
| 5150 | 49.8 | 49.8 |
| 5151 | 40.1 | 40.1 |
| 5152 | 28.8 | 28.8 |
| 5153 | 17.2 | 17.2 |
| 5154 | 7 | 7 |
| 5155 | 2 | 2 |
| 5156 | 0 | 0 |
| 5157 | 0 | 0 |
| 5158 | 0 | 0 |
| 5159 | 0 | 0 |
| 5160 | 0 | 0 |
| 5161 | 0 | 0 |
| 5162 | 0 | 0 |
| 5163 | 0 | 0 |
| 5164 | 2.8 | 2.8 |
| 5165 | 8 | 8 |
| 5166 | 19.9 | 19.9 |
| 5167 | 32.9 | 32.9 |
| 5168 | 45.1 | 45.1 |
| 5169 | 55.6 | 55.6 |
| 5170 | 62.9 | 62.9 |
| 5171 | 66.4 | 66.4 |
| 5172 | 66.1 | 66.1 |
| 5173 | 61.8 | 61.8 |
| 5174 | 53.9 | 53.9 |
| 5175 | 43.2 | 43.2 |
| 5176 | 30.8 | 30.8 |
| 5177 | 18.1 | 18.1 |
| 5178 | 7.1 | 7.1 |
| 5179 | 2 | 2 |
| 5180 | 0 | 0 |
| 5181 | 0 | 0 |
| 5182 | 0 | 0 |
| 5183 | 0 | 0 |
| 5184 | 0 | 0 |
| 5185 | 0 | 0 |
| 5186 | 0 | 0 |
| 5187 | 0 | 0 |
| 5188 | 2.3 | 2.3 |
| 5189 | 6.9 | 6.9 |
| 5190 | 15.4 | 15.4 |
| 5191 | 24.7 | 24.7 |
| 5192 | 33.4 | 33.4 |
| 5193 | 40.8 | 40.8 |
| 5194 | 45.9 | 45.9 |
| 5195 | 48.4 | 48.4 |
| 5196 | 48.2 | 48.2 |
| 5197 | 45.1 | 45.1 |
| 5198 | 39.6 | 39.6 |
| 5199 | 32 | 32 |
| 5200 | 23.1 | 23.1 |
| 5201 | 14 | 14 |
| 5202 | 6 | 6 |
| 5203 | 1.7 | 1.7 |
| 5204 | 0 | 0 |
| 5205 | 0 | 0 |
| 5206 | 0 | 0 |
| 5207 | 0 | 0 |
| 5208 | 0 | 0 |
| 5209 | 0 | 0 |
| 5210 | 0 | 0 |
| 5211 | 0 | 0 |
| 5212 | 2.4 | 2.4 |
| 5213 | 7.4 | 7.4 |
| 5214 | 18.7 | 18.7 |
| 5215 | 30.8 | 30.8 |
| 5216 | 42.4 | 42.4 |
| 5217 | 52.1 | 52.1 |
| 5218 | 59 | 59 |
| 5219 | 62.4 | 62.4 |
| 5220 | 62.1 | 62.1 |
| 5221 | 58 | 58 |
| 5222 | 50.6 | 50.6 |
| 5223 | 40.6 | 40.6 |
| 5224 | 28.8 | 28.8 |
| 5225 | 16.9 | 16.9 |
| 5226 | 6.4 | 6.4 |
| 5227 | 1.7 | 1.7 |
| 5228 | 0 | 0 |
| 5229 | 0 | 0 |
| 5230 | 0 | 0 |
| 5231 | 0 | 0 |
| 5232 | 0 | 0 |
| 5233 | 0 | 0 |
| 5234 | 0 | 0 |
| 5235 | 0 | 0 |
| 5236 | 2.4 | 2.4 |
| 5237 | 7.7 | 7.7 |
| 5238 | 21.4 | 21.4 |
| 5239 | 36.6 | 36.6 |
| 5240 | 51.1 | 51.1 |
| 5241 | 63.2 | 63.2 |
| 5242 | 71.9 | 71.9 |
| 5243 | 76.1 | 76.1 |
| 5244 | 75.7 | 75.7 |
| 5245 | 70.6 | 70.6 |
| 5246 | 61.3 | 61.3 |
| 5247 | 48.7 | 48.7 |
| 5248 | 34.1 | 34.1 |
| 5249 | 19.3 | 19.3 |
| 5250 | 6.7 | 6.7 |
| 5251 | 1.6 | 1.6 |
| 5252 | 0 | 0 |
| 5253 | 0 | 0 |
| 5254 | 0 | 0 |
| 5255 | 0 | 0 |
| 5256 | 0 | 0 |
| 5257 | 0 | 0 |
| 5258 | 0 | 0 |
| 5259 | 0 | 0 |
| 5260 | 2.2 | 2.2 |
| 5261 | 7 | 7 |
| 5262 | 18 | 18 |
| 5263 | 29.9 | 29.9 |
| 5264 | 41.3 | 41.3 |
| 5265 | 50.8 | 50.8 |
| 5266 | 57.6 | 57.6 |
| 5267 | 60.9 | 60.9 |
| 5268 | 60.6 | 60.6 |
| 5269 | 56.6 | 56.6 |
| 5270 | 49.2 | 49.2 |
| 5271 | 39.2 | 39.2 |
| 5272 | 27.8 | 27.8 |
| 5273 | 16.1 | 16.1 |
| 5274 | 6 | 6 |
| 5275 | 1.3 | 1.3 |
| 5276 | 0 | 0 |
| 5277 | 0 | 0 |
| 5278 | 0 | 0 |
| 5279 | 0 | 0 |
| 5280 | 0 | 0 |
| 5281 | 0 | 0 |
| 5282 | 0 | 0 |
| 5283 | 0 | 0 |
| 5284 | 2.1 | 2.1 |
| 5285 | 6.9 | 6.9 |
| 5286 | 17.8 | 17.8 |
| 5287 | 29.7 | 29.7 |
| 5288 | 41 | 41 |
| 5289 | 50.6 | 50.6 |
| 5290 | 57.2 | 57.2 |
| 5291 | 60.6 | 60.6 |
| 5292 | 60.2 | 60.2 |
| 5293 | 56.1 | 56.1 |
| 5294 | 48.9 | 48.9 |
| 5295 | 38.9 | 38.9 |
| 5296 | 27.4 | 27.4 |
| 5297 | 15.9 | 15.9 |
| 5298 | 5.8 | 5.8 |
| 5299 | 1.1 | 1.1 |
| 5300 | 0 | 0 |
| 5301 | 0 | 0 |
| 5302 | 0 | 0 |
| 5303 | 0 | 0 |
| 5304 | 0 | 0 |
| 5305 | 0 | 0 |
| 5306 | 0 | 0 |
| 5307 | 0 | 0 |
| 5308 | 0 | 0 |
| 5309 | 6 | 6 |
| 5310 | 14.4 | 14.4 |
| 5311 | 23.7 | 23.7 |
| 5312 | 32.3 | 32.3 |
| 5313 | 39.6 | 39.6 |
| 5314 | 44.8 | 44.8 |
| 5315 | 47.2 | 47.2 |
| 5316 | 47 | 47 |
| 5317 | 43.9 | 43.9 |
| 5318 | 38.2 | 38.2 |
| 5319 | 30.7 | 30.7 |
| 5320 | 21.9 | 21.9 |
| 5321 | 12.9 | 12.9 |
| 5322 | 5 | 5 |
| 5323 | 0 | 0 |
| 5324 | 0 | 0 |
| 5325 | 0 | 0 |
| 5326 | 0 | 0 |
| 5327 | 0 | 0 |
| 5328 | 0 | 0 |
| 5329 | 0 | 0 |
| 5330 | 0 | 0 |
| 5331 | 0 | 0 |
| 5332 | 0 | 0 |
| 5333 | 6.8 | 6.8 |
| 5334 | 20.6 | 20.6 |
| 5335 | 35.8 | 35.8 |
| 5336 | 50.3 | 50.3 |
| 5337 | 62.7 | 62.7 |
| 5338 | 71.3 | 71.3 |
| 5339 | 75.6 | 75.6 |
| 5340 | 75.1 | 75.1 |
| 5341 | 69.9 | 69.9 |
| 5342 | 60.4 | 60.4 |
| 5343 | 47.7 | 47.7 |
| 5344 | 33 | 33 |
| 5345 | 18.2 | 18.2 |
| 5346 | 5.7 | 5.7 |
| 5347 | 0 | 0 |
| 5348 | 0 | 0 |
| 5349 | 0 | 0 |
| 5350 | 0 | 0 |
| 5351 | 0 | 0 |
| 5352 | 0 | 0 |
| 5353 | 0 | 0 |
| 5354 | 0 | 0 |
| 5355 | 0 | 0 |
| 5356 | 0 | 0 |
| 5357 | 6.6 | 6.6 |
| 5358 | 20.1 | 20.1 |
| 5359 | 35.1 | 35.1 |
| 5360 | 49.6 | 49.6 |
| 5361 | 61.7 | 61.7 |
| 5362 | 70.2 | 70.2 |
| 5363 | 74.4 | 74.4 |
| 5364 | 73.9 | 73.9 |
| 5365 | 68.7 | 68.7 |
| 5366 | 59.3 | 59.3 |
| 5367 | 46.8 | 46.8 |
| 5368 | 32.2 | 32.2 |
| 5369 | 17.7 | 17.7 |
| 5370 | 5.3 | 5.3 |
| 5371 | 0 | 0 |
| 5372 | 0 | 0 |
| 5373 | 0 | 0 |
| 5374 | 0 | 0 |
| 5375 | 0 | 0 |
| 5376 | 0 | 0 |
| 5377 | 0 | 0 |
| 5378 | 0 | 0 |
| 5379 | 0 | 0 |
| 5380 | 0 | 0 |
| 5381 | 6 | 6 |
| 5382 | 16.3 | 16.3 |
| 5383 | 27.7 | 27.7 |
| 5384 | 38.4 | 38.4 |
| 5385 | 47.4 | 47.4 |
| 5386 | 53.9 | 53.9 |
| 5387 | 57 | 57 |
| 5388 | 56.7 | 56.7 |
| 5389 | 52.7 | 52.7 |
| 5390 | 45.7 | 45.7 |
| 5391 | 36.2 | 36.2 |
| 5392 | 25.2 | 25.2 |
| 5393 | 14.2 | 14.2 |
| 5394 | 4.8 | 4.8 |
| 5395 | 0 | 0 |
| 5396 | 0 | 0 |
| 5397 | 0 | 0 |
| 5398 | 0 | 0 |
| 5399 | 0 | 0 |
| 5400 | 0 | 0 |
| 5401 | 0 | 0 |
| 5402 | 0 | 0 |
| 5403 | 0 | 0 |
| 5404 | 0 | 0 |
| 5405 | 6.2 | 6.2 |
| 5406 | 20.4 | 20.4 |
| 5407 | 36.2 | 36.2 |
| 5408 | 51.4 | 51.4 |
| 5409 | 64.3 | 64.3 |
| 5410 | 73.3 | 73.3 |
| 5411 | 77.8 | 77.8 |
| 5412 | 77.2 | 77.2 |
| 5413 | 71.7 | 71.7 |
| 5414 | 61.8 | 61.8 |
| 5415 | 48.3 | 48.3 |
| 5416 | 33 | 33 |
| 5417 | 17.7 | 17.7 |
| 5418 | 4.8 | 4.8 |
| 5419 | 0 | 0 |
| 5420 | 0 | 0 |
| 5421 | 0 | 0 |
| 5422 | 0 | 0 |
| 5423 | 0 | 0 |
| 5424 | 0 | 0 |
| 5425 | 0 | 0 |
| 5426 | 0 | 0 |
| 5427 | 0 | 0 |
| 5428 | 0 | 0 |
| 5429 | 5.9 | 5.9 |
| 5430 | 20.3 | 20.3 |
| 5431 | 36.2 | 36.2 |
| 5432 | 51.6 | 51.6 |
| 5433 | 64.4 | 64.4 |
| 5434 | 73.6 | 73.6 |
| 5435 | 78 | 78 |
| 5436 | 77.4 | 77.4 |
| 5437 | 71.8 | 71.8 |
| 5438 | 61.8 | 61.8 |
| 5439 | 48.3 | 48.3 |
| 5440 | 32.8 | 32.8 |
| 5441 | 17.4 | 17.4 |
| 5442 | 4.6 | 4.6 |
| 5443 | 0 | 0 |
| 5444 | 0 | 0 |
| 5445 | 0 | 0 |
| 5446 | 0 | 0 |
| 5447 | 0 | 0 |
| 5448 | 0 | 0 |
| 5449 | 0 | 0 |
| 5450 | 0 | 0 |
| 5451 | 0 | 0 |
| 5452 | 0 | 0 |
| 5453 | 5.7 | 5.7 |
| 5454 | 18.9 | 18.9 |
| 5455 | 33.4 | 33.4 |
| 5456 | 47.6 | 47.6 |
| 5457 | 59.3 | 59.3 |
| 5458 | 67.7 | 67.7 |
| 5459 | 71.7 | 71.7 |
| 5460 | 71.1 | 71.1 |
| 5461 | 66 | 66 |
| 5462 | 56.8 | 56.8 |
| 5463 | 44.4 | 44.4 |
| 5464 | 30.2 | 30.2 |
| 5465 | 16.1 | 16.1 |
| 5466 | 4.3 | 4.3 |
| 5467 | 0 | 0 |
| 5468 | 0 | 0 |
| 5469 | 0 | 0 |
| 5470 | 0 | 0 |
| 5471 | 0 | 0 |
| 5472 | 0 | 0 |
| 5473 | 0 | 0 |
| 5474 | 0 | 0 |
| 5475 | 0 | 0 |
| 5476 | 0 | 0 |
| 5477 | 4.6 | 4.6 |
| 5478 | 11.9 | 11.9 |
| 5479 | 19.9 | 19.9 |
| 5480 | 27.6 | 27.6 |
| 5481 | 33.9 | 33.9 |
| 5482 | 38.3 | 38.3 |
| 5483 | 40.4 | 40.4 |
| 5484 | 40.1 | 40.1 |
| 5485 | 37.3 | 37.3 |
| 5486 | 32.4 | 32.4 |
| 5487 | 25.7 | 25.7 |
| 5488 | 17.9 | 17.9 |
| 5489 | 10.1 | 10.1 |
| 5490 | 3.4 | 3.4 |
| 5491 | 0 | 0 |
| 5492 | 0 | 0 |
| 5493 | 0 | 0 |
| 5494 | 0 | 0 |
| 5495 | 0 | 0 |
| 5496 | 0 | 0 |
| 5497 | 0 | 0 |
| 5498 | 0 | 0 |
| 5499 | 0 | 0 |
| 5500 | 0 | 0 |
| 5501 | 5.2 | 5.2 |
| 5502 | 18.1 | 18.1 |
| 5503 | 32.4 | 32.4 |
| 5504 | 46.3 | 46.3 |
| 5505 | 57.9 | 57.9 |
| 5506 | 66 | 66 |
| 5507 | 70 | 70 |
| 5508 | 69.4 | 69.4 |
| 5509 | 64.3 | 64.3 |
| 5510 | 55.2 | 55.2 |
| 5511 | 43 | 43 |
| 5512 | 29 | 29 |
| 5513 | 15.2 | 15.2 |
| 5514 | 4 | 4 |
| 5515 | 0 | 0 |
| 5516 | 0 | 0 |
| 5517 | 0 | 0 |
| 5518 | 0 | 0 |
| 5519 | 0 | 0 |
| 5520 | 0 | 0 |
| 5521 | 0 | 0 |
| 5522 | 0 | 0 |
| 5523 | 0 | 0 |
| 5524 | 0 | 0 |
| 5525 | 5.1 | 5.1 |
| 5526 | 17.4 | 17.4 |
| 5527 | 31.2 | 31.2 |
| 5528 | 44.4 | 44.4 |
| 5529 | 55.6 | 55.6 |
| 5530 | 63.4 | 63.4 |
| 5531 | 67.2 | 67.2 |
| 5532 | 66.7 | 66.7 |
| 5533 | 61.7 | 61.7 |
| 5534 | 53 | 53 |
| 5535 | 41.2 | 41.2 |
| 5536 | 27.8 | 27.8 |
| 5537 | 14.4 | 14.4 |
| 5538 | 3.8 | 3.8 |
| 5539 | 0 | 0 |
| 5540 | 0 | 0 |
| 5541 | 0 | 0 |
| 5542 | 0 | 0 |
| 5543 | 0 | 0 |
| 5544 | 0 | 0 |
| 5545 | 0 | 0 |
| 5546 | 0 | 0 |
| 5547 | 0 | 0 |
| 5548 | 0 | 0 |
| 5549 | 5 | 5 |
| 5550 | 17.8 | 17.8 |
| 5551 | 32.3 | 32.3 |
| 5552 | 46.3 | 46.3 |
| 5553 | 58 | 58 |
| 5554 | 66.3 | 66.3 |
| 5555 | 70.3 | 70.3 |
| 5556 | 69.7 | 69.7 |
| 5557 | 64.4 | 64.4 |
| 5558 | 55.1 | 55.1 |
| 5559 | 42.8 | 42.8 |
| 5560 | 28.6 | 28.6 |
| 5561 | 14.6 | 14.6 |
| 5562 | 3.6 | 3.6 |
| 5563 | 0 | 0 |
| 5564 | 0 | 0 |
| 5565 | 0 | 0 |
| 5566 | 0 | 0 |
| 5567 | 0 | 0 |
| 5568 | 0 | 0 |
| 5569 | 0 | 0 |
| 5570 | 0 | 0 |
| 5571 | 0 | 0 |
| 5572 | 0 | 0 |
| 5573 | 4.6 | 4.6 |
| 5574 | 14.1 | 14.1 |
| 5575 | 24.9 | 24.9 |
| 5576 | 35.2 | 35.2 |
| 5577 | 43.9 | 43.9 |
| 5578 | 49.9 | 49.9 |
| 5579 | 52.8 | 52.8 |
| 5580 | 52.3 | 52.3 |
| 5581 | 48.4 | 48.4 |
| 5582 | 41.6 | 41.6 |
| 5583 | 32.4 | 32.4 |
| 5584 | 21.9 | 21.9 |
| 5585 | 11.4 | 11.4 |
| 5586 | 3.1 | 3.1 |
| 5587 | 0 | 0 |
| 5588 | 0 | 0 |
| 5589 | 0 | 0 |
| 5590 | 0 | 0 |
| 5591 | 0 | 0 |
| 5592 | 0 | 0 |
| 5593 | 0 | 0 |
| 5594 | 0 | 0 |
| 5595 | 0 | 0 |
| 5596 | 0 | 0 |
| 5597 | 4.7 | 4.7 |
| 5598 | 16.9 | 16.9 |
| 5599 | 30.8 | 30.8 |
| 5600 | 44.1 | 44.1 |
| 5601 | 55.4 | 55.4 |
| 5602 | 63.3 | 63.3 |
| 5603 | 67.1 | 67.1 |
| 5604 | 66.4 | 66.4 |
| 5605 | 61.4 | 61.4 |
| 5606 | 52.4 | 52.4 |
| 5607 | 40.4 | 40.4 |
| 5608 | 26.9 | 26.9 |
| 5609 | 13.4 | 13.4 |
| 5610 | 3.1 | 3.1 |
| 5611 | 0 | 0 |
| 5612 | 0 | 0 |
| 5613 | 0 | 0 |
| 5614 | 0 | 0 |
| 5615 | 0 | 0 |
| 5616 | 0 | 0 |
| 5617 | 0 | 0 |
| 5618 | 0 | 0 |
| 5619 | 0 | 0 |
| 5620 | 0 | 0 |
| 5621 | 4.6 | 4.6 |
| 5622 | 18.8 | 18.8 |
| 5623 | 35.3 | 35.3 |
| 5624 | 51.3 | 51.3 |
| 5625 | 64.7 | 64.7 |
| 5626 | 74.1 | 74.1 |
| 5627 | 78.7 | 78.7 |
| 5628 | 77.9 | 77.9 |
| 5629 | 71.8 | 71.8 |
| 5630 | 61.1 | 61.1 |
| 5631 | 46.8 | 46.8 |
| 5632 | 30.6 | 30.6 |
| 5633 | 14.9 | 14.9 |
| 5634 | 3 | 3 |
| 5635 | 0 | 0 |
| 5636 | 0 | 0 |
| 5637 | 0 | 0 |
| 5638 | 0 | 0 |
| 5639 | 0 | 0 |
| 5640 | 0 | 0 |
| 5641 | 0 | 0 |
| 5642 | 0 | 0 |
| 5643 | 0 | 0 |
| 5644 | 0 | 0 |
| 5645 | 4.2 | 4.2 |
| 5646 | 14.8 | 14.8 |
| 5647 | 27 | 27 |
| 5648 | 38.7 | 38.7 |
| 5649 | 48.6 | 48.6 |
| 5650 | 55.4 | 55.4 |
| 5651 | 58.7 | 58.7 |
| 5652 | 58.1 | 58.1 |
| 5653 | 53.6 | 53.6 |
| 5654 | 45.7 | 45.7 |
| 5655 | 35.2 | 35.2 |
| 5656 | 23.2 | 23.2 |
| 5657 | 11.6 | 11.6 |
| 5658 | 2.7 | 2.7 |
| 5659 | 0 | 0 |
| 5660 | 0 | 0 |
| 5661 | 0 | 0 |
| 5662 | 0 | 0 |
| 5663 | 0 | 0 |
| 5664 | 0 | 0 |
| 5665 | 0 | 0 |
| 5666 | 0 | 0 |
| 5667 | 0 | 0 |
| 5668 | 0 | 0 |
| 5669 | 4.1 | 4.1 |
| 5670 | 15.9 | 15.9 |
| 5671 | 29.6 | 29.6 |
| 5672 | 42.8 | 42.8 |
| 5673 | 53.9 | 53.9 |
| 5674 | 61.6 | 61.6 |
| 5675 | 65.3 | 65.3 |
| 5676 | 64.6 | 64.6 |
| 5677 | 59.6 | 59.6 |
| 5678 | 50.6 | 50.6 |
| 5679 | 38.8 | 38.8 |
| 5680 | 25.3 | 25.3 |
| 5681 | 12.2 | 12.2 |
| 5682 | 2.6 | 2.6 |
| 5683 | 0 | 0 |
| 5684 | 0 | 0 |
| 5685 | 0 | 0 |
| 5686 | 0 | 0 |
| 5687 | 0 | 0 |
| 5688 | 0 | 0 |
| 5689 | 0 | 0 |
| 5690 | 0 | 0 |
| 5691 | 0 | 0 |
| 5692 | 0 | 0 |
| 5693 | 3.9 | 3.9 |
| 5694 | 13.7 | 13.7 |
| 5695 | 25.2 | 25.2 |
| 5696 | 36.2 | 36.2 |
| 5697 | 45.4 | 45.4 |
| 5698 | 52 | 52 |
| 5699 | 55 | 55 |
| 5700 | 54.3 | 54.3 |
| 5701 | 50.1 | 50.1 |
| 5702 | 42.7 | 42.7 |
| 5703 | 32.7 | 32.7 |
| 5704 | 21.4 | 21.4 |
| 5705 | 10.4 | 10.4 |
| 5706 | 2.2 | 2.2 |
| 5707 | 0 | 0 |
| 5708 | 0 | 0 |
| 5709 | 0 | 0 |
| 5710 | 0 | 0 |
| 5711 | 0 | 0 |
| 5712 | 0 | 0 |
| 5713 | 0 | 0 |
| 5714 | 0 | 0 |
| 5715 | 0 | 0 |
| 5716 | 0 | 0 |
| 5717 | 3.9 | 3.9 |
| 5718 | 16.2 | 16.2 |
| 5719 | 30.9 | 30.9 |
| 5720 | 45.1 | 45.1 |
| 5721 | 57 | 57 |
| 5722 | 65.3 | 65.3 |
| 5723 | 69.2 | 69.2 |
| 5724 | 68.3 | 68.3 |
| 5725 | 62.9 | 62.9 |
| 5726 | 53.2 | 53.2 |
| 5727 | 40.4 | 40.4 |
| 5728 | 26 | 26 |
| 5729 | 12.1 | 12.1 |
| 5730 | 2.1 | 2.1 |
| 5731 | 0 | 0 |
| 5732 | 0 | 0 |
| 5733 | 0 | 0 |
| 5734 | 0 | 0 |
| 5735 | 0 | 0 |
| 5736 | 0 | 0 |
| 5737 | 0 | 0 |
| 5738 | 0 | 0 |
| 5739 | 0 | 0 |
| 5740 | 0 | 0 |
| 5741 | 3.7 | 3.7 |
| 5742 | 16.6 | 16.6 |
| 5743 | 31.8 | 31.8 |
| 5744 | 46.6 | 46.6 |
| 5745 | 59 | 59 |
| 5746 | 67.7 | 67.7 |
| 5747 | 71.8 | 71.8 |
| 5748 | 70.9 | 70.9 |
| 5749 | 65.1 | 65.1 |
| 5750 | 55 | 55 |
| 5751 | 41.6 | 41.6 |
| 5752 | 26.6 | 26.6 |
| 5753 | 12.1 | 12.1 |
| 5754 | 2 | 2 |
| 5755 | 0 | 0 |
| 5756 | 0 | 0 |
| 5757 | 0 | 0 |
| 5758 | 0 | 0 |
| 5759 | 0 | 0 |
| 5760 | 0 | 0 |
| 5761 | 0 | 0 |
| 5762 | 0 | 0 |
| 5763 | 0 | 0 |
| 5764 | 0 | 0 |
| 5765 | 3.6 | 3.6 |
| 5766 | 16.3 | 16.3 |
| 5767 | 31.6 | 31.6 |
| 5768 | 46.3 | 46.3 |
| 5769 | 58.8 | 58.8 |
| 5770 | 67.4 | 67.4 |
| 5771 | 71.6 | 71.6 |
| 5772 | 70.7 | 70.7 |
| 5773 | 64.8 | 64.8 |
| 5774 | 54.7 | 54.7 |
| 5775 | 41.2 | 41.2 |
| 5776 | 26.1 | 26.1 |
| 5777 | 11.8 | 11.8 |
| 5778 | 1.8 | 1.8 |
| 5779 | 0 | 0 |
| 5780 | 0 | 0 |
| 5781 | 0 | 0 |
| 5782 | 0 | 0 |
| 5783 | 0 | 0 |
| 5784 | 0 | 0 |
| 5785 | 0 | 0 |
| 5786 | 0 | 0 |
| 5787 | 0 | 0 |
| 5788 | 0 | 0 |
| 5789 | 2.9 | 2.9 |
| 5790 | 10.2 | 10.2 |
| 5791 | 18.9 | 18.9 |
| 5792 | 27.2 | 27.2 |
| 5793 | 34.2 | 34.2 |
| 5794 | 39.1 | 39.1 |
| 5795 | 41.3 | 41.3 |
| 5796 | 40.8 | 40.8 |
| 5797 | 37.4 | 37.4 |
| 5798 | 31.8 | 31.8 |
| 5799 | 24.2 | 24.2 |
| 5800 | 15.7 | 15.7 |
| 5801 | 7.3 | 7.3 |
| 5802 | 1.3 | 1.3 |
| 5803 | 0 | 0 |
| 5804 | 0 | 0 |
| 5805 | 0 | 0 |
| 5806 | 0 | 0 |
| 5807 | 0 | 0 |
| 5808 | 0 | 0 |
| 5809 | 0 | 0 |
| 5810 | 0 | 0 |
| 5811 | 0 | 0 |
| 5812 | 0 | 0 |
| 5813 | 3.2 | 3.2 |
| 5814 | 14.9 | 14.9 |
| 5815 | 28.9 | 28.9 |
| 5816 | 42.6 | 42.6 |
| 5817 | 54 | 54 |
| 5818 | 62 | 62 |
| 5819 | 65.7 | 65.7 |
| 5820 | 64.8 | 64.8 |
| 5821 | 59.3 | 59.3 |
| 5822 | 49.9 | 49.9 |
| 5823 | 37.4 | 37.4 |
| 5824 | 23.6 | 23.6 |
| 5825 | 10.3 | 10.3 |
| 5826 | 1.3 | 1.3 |
| 5827 | 0 | 0 |
| 5828 | 0 | 0 |
| 5829 | 0 | 0 |
| 5830 | 0 | 0 |
| 5831 | 0 | 0 |
| 5832 | 0 | 0 |
| 5833 | 0 | 0 |
| 5834 | 0 | 0 |
| 5835 | 0 | 0 |
| 5836 | 0 | 0 |
| 5837 | 3.7 | 3.7 |
| 5838 | 19.1 | 19.1 |
| 5839 | 43.4 | 43.4 |
| 5840 | 68.3 | 68.3 |
| 5841 | 88.9 | 80 |
| 5842 | 100 | 80 |
| 5843 | 100 | 80 |
| 5844 | 100 | 80 |
| 5845 | 100 | 80 |
| 5846 | 86.3 | 80 |
| 5847 | 64.8 | 64.8 |
| 5848 | 40 | 40 |
| 5849 | 16.1 | 16.1 |
| 5850 | 2.6 | 2.6 |
| 5851 | 0 | 0 |
| 5852 | 0 | 0 |
| 5853 | 0 | 0 |
| 5854 | 0 | 0 |
| 5855 | 0 | 0 |
| 5856 | 0 | 0 |
| 5857 | 0 | 0 |
| 5858 | 0 | 0 |
| 5859 | 0 | 0 |
| 5860 | 0 | 0 |
| 5861 | 2.4 | 2.4 |
| 5862 | 10.3 | 10.3 |
| 5863 | 31.8 | 31.8 |
| 5864 | 68.3 | 68.3 |
| 5865 | 88.7 | 80 |
| 5866 | 100 | 80 |
| 5867 | 100 | 80 |
| 5868 | 100 | 80 |
| 5869 | 100 | 80 |
| 5870 | 84.3 | 80 |
| 5871 | 63.9 | 63.9 |
| 5872 | 26.9 | 26.9 |
| 5873 | 8.7 | 8.7 |
| 5874 | 0 | 0 |
| 5875 | 0 | 0 |
| 5876 | 0 | 0 |
| 5877 | 0 | 0 |
| 5878 | 0 | 0 |
| 5879 | 0 | 0 |
| 5880 | 0 | 0 |
| 5881 | 0 | 0 |
| 5882 | 0 | 0 |
| 5883 | 0 | 0 |
| 5884 | 0 | 0 |
| 5885 | 1.9 | 1.9 |
| 5886 | 18.4 | 18.4 |
| 5887 | 42 | 42 |
| 5888 | 63.7 | 63.7 |
| 5889 | 86.1 | 80 |
| 5890 | 100 | 80 |
| 5891 | 100 | 80 |
| 5892 | 100 | 80 |
| 5893 | 80.2 | 80 |
| 5894 | 59.1 | 59.1 |
| 5895 | 41.8 | 41.8 |
| 5896 | 30 | 30 |
| 5897 | 5.4 | 5.4 |
| 5898 | 0 | 0 |
| 5899 | 0 | 0 |
| 5900 | 0 | 0 |
| 5901 | 0 | 0 |
| 5902 | 0 | 0 |
| 5903 | 0 | 0 |
| 5904 | 0 | 0 |
| 5905 | 0 | 0 |
| 5906 | 0 | 0 |
| 5907 | 0 | 0 |
| 5908 | 0 | 0 |
| 5909 | 2.3 | 2.3 |
| 5910 | 14.1 | 14.1 |
| 5911 | 24.1 | 24.1 |
| 5912 | 20.9 | 20.9 |
| 5913 | 27.3 | 27.3 |
| 5914 | 32.4 | 32.4 |
| 5915 | 42 | 42 |
| 5916 | 57.9 | 57.9 |
| 5917 | 58.6 | 58.6 |
| 5918 | 59.2 | 59.2 |
| 5919 | 52.2 | 52.2 |
| 5920 | 39.1 | 39.1 |
| 5921 | 11.6 | 11.6 |
| 5922 | 0 | 0 |
| 5923 | 0 | 0 |
| 5924 | 0 | 0 |
| 5925 | 0 | 0 |
| 5926 | 0 | 0 |
| 5927 | 0 | 0 |
| 5928 | 0 | 0 |
| 5929 | 0 | 0 |
| 5930 | 0 | 0 |
| 5931 | 0 | 0 |
| 5932 | 0 | 0 |
| 5933 | 2.3 | 2.3 |
| 5934 | 15.2 | 15.2 |
| 5935 | 37.2 | 37.2 |
| 5936 | 63.6 | 63.6 |
| 5937 | 82.9 | 80 |
| 5938 | 84 | 80 |
| 5939 | 91 | 80 |
| 5940 | 66.4 | 66.4 |
| 5941 | 44.9 | 44.9 |
| 5942 | 66.4 | 66.4 |
| 5943 | 43.1 | 43.1 |
| 5944 | 19.2 | 19.2 |
| 5945 | 9.4 | 9.4 |
| 5946 | 0 | 0 |
| 5947 | 0 | 0 |
| 5948 | 0 | 0 |
| 5949 | 0 | 0 |
| 5950 | 0 | 0 |
| 5951 | 0 | 0 |
| 5952 | 0 | 0 |
| 5953 | 0 | 0 |
| 5954 | 0 | 0 |
| 5955 | 0 | 0 |
| 5956 | 0 | 0 |
| 5957 | 0 | 0 |
| 5958 | 10.7 | 10.7 |
| 5959 | 15.1 | 15.1 |
| 5960 | 37.4 | 37.4 |
| 5961 | 55.8 | 55.8 |
| 5962 | 79.9 | 79.9 |
| 5963 | 95.7 | 80 |
| 5964 | 75.7 | 75.7 |
| 5965 | 92 | 80 |
| 5966 | 75.1 | 75.1 |
| 5967 | 55.6 | 55.6 |
| 5968 | 32.8 | 32.8 |
| 5969 | 11.4 | 11.4 |
| 5970 | 0 | 0 |
| 5971 | 0 | 0 |
| 5972 | 0 | 0 |
| 5973 | 0 | 0 |
| 5974 | 0 | 0 |
| 5975 | 0 | 0 |
| 5976 | 0 | 0 |
| 5977 | 0 | 0 |
| 5978 | 0 | 0 |
| 5979 | 0 | 0 |
| 5980 | 0 | 0 |
| 5981 | 0 | 0 |
| 5982 | 15.1 | 15.1 |
| 5983 | 38 | 38 |
| 5984 | 46.9 | 46.9 |
| 5985 | 61.8 | 61.8 |
| 5986 | 69.7 | 69.7 |
| 5987 | 44.9 | 44.9 |
| 5988 | 42.4 | 42.4 |
| 5989 | 26.1 | 26.1 |
| 5990 | 8.3 | 8.3 |
| 5991 | 11.4 | 11.4 |
| 5992 | 5 | 5 |
| 5993 | 3.9 | 3.9 |
| 5994 | 0 | 0 |
| 5995 | 0 | 0 |
| 5996 | 0 | 0 |
| 5997 | 0 | 0 |
| 5998 | 0 | 0 |
| 5999 | 0 | 0 |
| 6000 | 0 | 0 |
| 6001 | 0 | 0 |
| 6002 | 0 | 0 |
| 6003 | 0 | 0 |
| 6004 | 0 | 0 |
| 6005 | 0 | 0 |
| 6006 | 6 | 6 |
| 6007 | 24 | 24 |
| 6008 | 41.7 | 41.7 |
| 6009 | 41.7 | 41.7 |
| 6010 | 66.3 | 66.3 |
| 6011 | 83.9 | 80 |
| 6012 | 67.1 | 67.1 |
| 6013 | 79 | 79 |
| 6014 | 55.2 | 55.2 |
| 6015 | 30.8 | 30.8 |
| 6016 | 6.8 | 6.8 |
| 6017 | 1.9 | 1.9 |
| 6018 | 0 | 0 |
| 6019 | 0 | 0 |
| 6020 | 0 | 0 |
| 6021 | 0 | 0 |
| 6022 | 0 | 0 |
| 6023 | 0 | 0 |
| 6024 | 0 | 0 |
| 6025 | 0 | 0 |
| 6026 | 0 | 0 |
| 6027 | 0 | 0 |
| 6028 | 0 | 0 |
| 6029 | 0 | 0 |
| 6030 | 12 | 12 |
| 6031 | 19.2 | 19.2 |
| 6032 | 55.3 | 55.3 |
| 6033 | 45.6 | 45.6 |
| 6034 | 56.4 | 56.4 |
| 6035 | 64.6 | 64.6 |
| 6036 | 62.3 | 62.3 |
| 6037 | 61.4 | 61.4 |
| 6038 | 44.3 | 44.3 |
| 6039 | 34.9 | 34.9 |
| 6040 | 20.1 | 20.1 |
| 6041 | 6.4 | 6.4 |
| 6042 | 0 | 0 |
| 6043 | 0 | 0 |
| 6044 | 0 | 0 |
| 6045 | 0 | 0 |
| 6046 | 0 | 0 |
| 6047 | 0 | 0 |
| 6048 | 0 | 0 |
| 6049 | 0 | 0 |
| 6050 | 0 | 0 |
| 6051 | 0 | 0 |
| 6052 | 0 | 0 |
| 6053 | 0 | 0 |
| 6054 | 5.8 | 5.8 |
| 6055 | 17.4 | 17.4 |
| 6056 | 24.7 | 24.7 |
| 6057 | 28.7 | 28.7 |
| 6058 | 28.2 | 28.2 |
| 6059 | 30.2 | 30.2 |
| 6060 | 27.9 | 27.9 |
| 6061 | 41.7 | 41.7 |
| 6062 | 55.4 | 55.4 |
| 6063 | 48.9 | 48.9 |
| 6064 | 34.3 | 34.3 |
| 6065 | 11.1 | 11.1 |
| 6066 | 0 | 0 |
| 6067 | 0 | 0 |
| 6068 | 0 | 0 |
| 6069 | 0 | 0 |
| 6070 | 0 | 0 |
| 6071 | 0 | 0 |
| 6072 | 0 | 0 |
| 6073 | 0 | 0 |
| 6074 | 0 | 0 |
| 6075 | 0 | 0 |
| 6076 | 0 | 0 |
| 6077 | 0 | 0 |
| 6078 | 17.3 | 17.3 |
| 6079 | 39.1 | 39.1 |
| 6080 | 67.4 | 67.4 |
| 6081 | 59.8 | 59.8 |
| 6082 | 68.8 | 68.8 |
| 6083 | 73.6 | 73.6 |
| 6084 | 98.9 | 80 |
| 6085 | 89.1 | 80 |
| 6086 | 79.9 | 79.9 |
| 6087 | 48.2 | 48.2 |
| 6088 | 25.7 | 25.7 |
| 6089 | 10.8 | 10.8 |
| 6090 | 0 | 0 |
| 6091 | 0 | 0 |
| 6092 | 0 | 0 |
| 6093 | 0 | 0 |
| 6094 | 0 | 0 |
| 6095 | 0 | 0 |
| 6096 | 0 | 0 |
| 6097 | 0 | 0 |
| 6098 | 0 | 0 |
| 6099 | 0 | 0 |
| 6100 | 0 | 0 |
| 6101 | 0 | 0 |
| 6102 | 4.3 | 4.3 |
| 6103 | 20 | 20 |
| 6104 | 52.7 | 52.7 |
| 6105 | 26.8 | 26.8 |
| 6106 | 23.2 | 23.2 |
| 6107 | 23.7 | 23.7 |
| 6108 | 37.6 | 37.6 |
| 6109 | 96.8 | 80 |
| 6110 | 82.9 | 80 |
| 6111 | 56 | 56 |
| 6112 | 32 | 32 |
| 6113 | 10.2 | 10.2 |
| 6114 | 0 | 0 |
| 6115 | 0 | 0 |
| 6116 | 0 | 0 |
| 6117 | 0 | 0 |
| 6118 | 0 | 0 |
| 6119 | 0 | 0 |
| 6120 | 0 | 0 |
| 6121 | 0 | 0 |
| 6122 | 0 | 0 |
| 6123 | 0 | 0 |
| 6124 | 0 | 0 |
| 6125 | 0 | 0 |
| 6126 | 15.9 | 15.9 |
| 6127 | 40.9 | 40.9 |
| 6128 | 56 | 56 |
| 6129 | 48.2 | 48.2 |
| 6130 | 22.7 | 22.7 |
| 6131 | 30 | 30 |
| 6132 | 66.8 | 66.8 |
| 6133 | 81.2 | 80 |
| 6134 | 21.8 | 21.8 |
| 6135 | 18 | 18 |
| 6136 | 14 | 14 |
| 6137 | 2 | 2 |
| 6138 | 0 | 0 |
| 6139 | 0 | 0 |
| 6140 | 0 | 0 |
| 6141 | 0 | 0 |
| 6142 | 0 | 0 |
| 6143 | 0 | 0 |
| 6144 | 0 | 0 |
| 6145 | 0 | 0 |
| 6146 | 0 | 0 |
| 6147 | 0 | 0 |
| 6148 | 0 | 0 |
| 6149 | 0 | 0 |
| 6150 | 2.2 | 2.2 |
| 6151 | 4.8 | 4.8 |
| 6152 | 8.9 | 8.9 |
| 6153 | 6.7 | 6.7 |
| 6154 | 10.6 | 10.6 |
| 6155 | 12.3 | 12.3 |
| 6156 | 20.9 | 20.9 |
| 6157 | 67 | 67 |
| 6158 | 29.8 | 29.8 |
| 6159 | 11.6 | 11.6 |
| 6160 | 13.2 | 13.2 |
| 6161 | 5.6 | 5.6 |
| 6162 | 0 | 0 |
| 6163 | 0 | 0 |
| 6164 | 0 | 0 |
| 6165 | 0 | 0 |
| 6166 | 0 | 0 |
| 6167 | 0 | 0 |
| 6168 | 0 | 0 |
| 6169 | 0 | 0 |
| 6170 | 0 | 0 |
| 6171 | 0 | 0 |
| 6172 | 0 | 0 |
| 6173 | 0 | 0 |
| 6174 | 2.6 | 2.6 |
| 6175 | 7.8 | 7.8 |
| 6176 | 11.7 | 11.7 |
| 6177 | 10 | 10 |
| 6178 | 19.8 | 19.8 |
| 6179 | 11.7 | 11.7 |
| 6180 | 21.9 | 21.9 |
| 6181 | 35.8 | 35.8 |
| 6182 | 16.1 | 16.1 |
| 6183 | 10.6 | 10.6 |
| 6184 | 12.9 | 12.9 |
| 6185 | 9 | 9 |
| 6186 | 0 | 0 |
| 6187 | 0 | 0 |
| 6188 | 0 | 0 |
| 6189 | 0 | 0 |
| 6190 | 0 | 0 |
| 6191 | 0 | 0 |
| 6192 | 0 | 0 |
| 6193 | 0 | 0 |
| 6194 | 0 | 0 |
| 6195 | 0 | 0 |
| 6196 | 0 | 0 |
| 6197 | 0 | 0 |
| 6198 | 8.9 | 8.9 |
| 6199 | 25.2 | 25.2 |
| 6200 | 40.9 | 40.9 |
| 6201 | 74.4 | 74.4 |
| 6202 | 94.4 | 80 |
| 6203 | 100 | 80 |
| 6204 | 73.6 | 73.6 |
| 6205 | 96.2 | 80 |
| 6206 | 79.8 | 79.8 |
| 6207 | 55.7 | 55.7 |
| 6208 | 23.7 | 23.7 |
| 6209 | 8.3 | 8.3 |
| 6210 | 0 | 0 |
| 6211 | 0 | 0 |
| 6212 | 0 | 0 |
| 6213 | 0 | 0 |
| 6214 | 0 | 0 |
| 6215 | 0 | 0 |
| 6216 | 0 | 0 |
| 6217 | 0 | 0 |
| 6218 | 0 | 0 |
| 6219 | 0 | 0 |
| 6220 | 0 | 0 |
| 6221 | 0 | 0 |
| 6222 | 14.2 | 14.2 |
| 6223 | 40.6 | 40.6 |
| 6224 | 65.8 | 65.8 |
| 6225 | 87.3 | 80 |
| 6226 | 100 | 80 |
| 6227 | 100 | 80 |
| 6228 | 100 | 80 |
| 6229 | 97.2 | 80 |
| 6230 | 80.2 | 80 |
| 6231 | 56.4 | 56.4 |
| 6232 | 31.7 | 31.7 |
| 6233 | 8.1 | 8.1 |
| 6234 | 0 | 0 |
| 6235 | 0 | 0 |
| 6236 | 0 | 0 |
| 6237 | 0 | 0 |
| 6238 | 0 | 0 |
| 6239 | 0 | 0 |
| 6240 | 0 | 0 |
| 6241 | 0 | 0 |
| 6242 | 0 | 0 |
| 6243 | 0 | 0 |
| 6244 | 0 | 0 |
| 6245 | 0 | 0 |
| 6246 | 2.8 | 2.8 |
| 6247 | 11 | 11 |
| 6248 | 19.1 | 19.1 |
| 6249 | 24.4 | 24.4 |
| 6250 | 16.8 | 16.8 |
| 6251 | 15.8 | 15.8 |
| 6252 | 11.9 | 11.9 |
| 6253 | 15.2 | 15.2 |
| 6254 | 14 | 14 |
| 6255 | 9.7 | 9.7 |
| 6256 | 10.2 | 10.2 |
| 6257 | 2.2 | 2.2 |
| 6258 | 0 | 0 |
| 6259 | 0 | 0 |
| 6260 | 0 | 0 |
| 6261 | 0 | 0 |
| 6262 | 0 | 0 |
| 6263 | 0 | 0 |
| 6264 | 0 | 0 |
| 6265 | 0 | 0 |
| 6266 | 0 | 0 |
| 6267 | 0 | 0 |
| 6268 | 0 | 0 |
| 6269 | 0 | 0 |
| 6270 | 7.9 | 7.9 |
| 6271 | 27.3 | 27.3 |
| 6272 | 58.8 | 58.8 |
| 6273 | 68.9 | 68.9 |
| 6274 | 50.6 | 50.6 |
| 6275 | 57.8 | 57.8 |
| 6276 | 34.6 | 34.6 |
| 6277 | 16.1 | 16.1 |
| 6278 | 6.8 | 6.8 |
| 6279 | 5.1 | 5.1 |
| 6280 | 3.6 | 3.6 |
| 6281 | 1 | 1 |
| 6282 | 0 | 0 |
| 6283 | 0 | 0 |
| 6284 | 0 | 0 |
| 6285 | 0 | 0 |
| 6286 | 0 | 0 |
| 6287 | 0 | 0 |
| 6288 | 0 | 0 |
| 6289 | 0 | 0 |
| 6290 | 0 | 0 |
| 6291 | 0 | 0 |
| 6292 | 0 | 0 |
| 6293 | 0 | 0 |
| 6294 | 2.6 | 2.6 |
| 6295 | 6.6 | 6.6 |
| 6296 | 9.4 | 9.4 |
| 6297 | 17.7 | 17.7 |
| 6298 | 39.1 | 39.1 |
| 6299 | 83.9 | 80 |
| 6300 | 51.1 | 51.1 |
| 6301 | 67 | 67 |
| 6302 | 39.6 | 39.6 |
| 6303 | 20.6 | 20.6 |
| 6304 | 15 | 15 |
| 6305 | 6 | 6 |
| 6306 | 0 | 0 |
| 6307 | 0 | 0 |
| 6308 | 0 | 0 |
| 6309 | 0 | 0 |
| 6310 | 0 | 0 |
| 6311 | 0 | 0 |
| 6312 | 0 | 0 |
| 6313 | 0 | 0 |
| 6314 | 0 | 0 |
| 6315 | 0 | 0 |
| 6316 | 0 | 0 |
| 6317 | 0 | 0 |
| 6318 | 7.4 | 7.4 |
| 6319 | 20 | 20 |
| 6320 | 36.8 | 36.8 |
| 6321 | 49.3 | 49.3 |
| 6322 | 71.6 | 71.6 |
| 6323 | 71.3 | 71.3 |
| 6324 | 66.7 | 66.7 |
| 6325 | 38.3 | 38.3 |
| 6326 | 26.4 | 26.4 |
| 6327 | 25.2 | 25.2 |
| 6328 | 10.6 | 10.6 |
| 6329 | 2.7 | 2.7 |
| 6330 | 0 | 0 |
| 6331 | 0 | 0 |
| 6332 | 0 | 0 |
| 6333 | 0 | 0 |
| 6334 | 0 | 0 |
| 6335 | 0 | 0 |
| 6336 | 0 | 0 |
| 6337 | 0 | 0 |
| 6338 | 0 | 0 |
| 6339 | 0 | 0 |
| 6340 | 0 | 0 |
| 6341 | 0 | 0 |
| 6342 | 6.3 | 6.3 |
| 6343 | 12.2 | 12.2 |
| 6344 | 56.8 | 56.8 |
| 6345 | 62.6 | 62.6 |
| 6346 | 34.2 | 34.2 |
| 6347 | 66.6 | 66.6 |
| 6348 | 49.7 | 49.7 |
| 6349 | 25 | 25 |
| 6350 | 33.6 | 33.6 |
| 6351 | 21.1 | 21.1 |
| 6352 | 11.3 | 11.3 |
| 6353 | 2.6 | 2.6 |
| 6354 | 0 | 0 |
| 6355 | 0 | 0 |
| 6356 | 0 | 0 |
| 6357 | 0 | 0 |
| 6358 | 0 | 0 |
| 6359 | 0 | 0 |
| 6360 | 0 | 0 |
| 6361 | 0 | 0 |
| 6362 | 0 | 0 |
| 6363 | 0 | 0 |
| 6364 | 0 | 0 |
| 6365 | 0 | 0 |
| 6366 | 7.4 | 7.4 |
| 6367 | 28.6 | 28.6 |
| 6368 | 50.9 | 50.9 |
| 6369 | 70 | 70 |
| 6370 | 79.4 | 79.4 |
| 6371 | 76.9 | 76.9 |
| 6372 | 85.7 | 80 |
| 6373 | 70.3 | 70.3 |
| 6374 | 54.6 | 54.6 |
| 6375 | 43.7 | 43.7 |
| 6376 | 17 | 17 |
| 6377 | 2 | 2 |
| 6378 | 0 | 0 |
| 6379 | 0 | 0 |
| 6380 | 0 | 0 |
| 6381 | 0 | 0 |
| 6382 | 0 | 0 |
| 6383 | 0 | 0 |
| 6384 | 0 | 0 |
| 6385 | 0 | 0 |
| 6386 | 0 | 0 |
| 6387 | 0 | 0 |
| 6388 | 0 | 0 |
| 6389 | 0 | 0 |
| 6390 | 7.2 | 7.2 |
| 6391 | 29.3 | 29.3 |
| 6392 | 51 | 51 |
| 6393 | 70.6 | 70.6 |
| 6394 | 80 | 80 |
| 6395 | 34.7 | 34.7 |
| 6396 | 56.1 | 56.1 |
| 6397 | 25.2 | 25.2 |
| 6398 | 26.6 | 26.6 |
| 6399 | 36.6 | 36.6 |
| 6400 | 13.7 | 13.7 |
| 6401 | 0 | 0 |
| 6402 | 0 | 0 |
| 6403 | 0 | 0 |
| 6404 | 0 | 0 |
| 6405 | 0 | 0 |
| 6406 | 0 | 0 |
| 6407 | 0 | 0 |
| 6408 | 0 | 0 |
| 6409 | 0 | 0 |
| 6410 | 0 | 0 |
| 6411 | 0 | 0 |
| 6412 | 0 | 0 |
| 6413 | 0 | 0 |
| 6414 | 4.1 | 4.1 |
| 6415 | 11.1 | 11.1 |
| 6416 | 38 | 38 |
| 6417 | 63.7 | 63.7 |
| 6418 | 80.2 | 80 |
| 6419 | 84.7 | 80 |
| 6420 | 85.2 | 80 |
| 6421 | 78.7 | 78.7 |
| 6422 | 62.7 | 62.7 |
| 6423 | 41.8 | 41.8 |
| 6424 | 18.6 | 18.6 |
| 6425 | 0 | 0 |
| 6426 | 0 | 0 |
| 6427 | 0 | 0 |
| 6428 | 0 | 0 |
| 6429 | 0 | 0 |
| 6430 | 0 | 0 |
| 6431 | 0 | 0 |
| 6432 | 0 | 0 |
| 6433 | 0 | 0 |
| 6434 | 0 | 0 |
| 6435 | 0 | 0 |
| 6436 | 0 | 0 |
| 6437 | 0 | 0 |
| 6438 | 1.9 | 1.9 |
| 6439 | 4.8 | 4.8 |
| 6440 | 13.6 | 13.6 |
| 6441 | 36.7 | 36.7 |
| 6442 | 63.9 | 63.9 |
| 6443 | 82.7 | 80 |
| 6444 | 78 | 78 |
| 6445 | 48.3 | 48.3 |
| 6446 | 43.1 | 43.1 |
| 6447 | 24.6 | 24.6 |
| 6448 | 13.9 | 13.9 |
| 6449 | 0 | 0 |
| 6450 | 0 | 0 |
| 6451 | 0 | 0 |
| 6452 | 0 | 0 |
| 6453 | 0 | 0 |
| 6454 | 0 | 0 |
| 6455 | 0 | 0 |
| 6456 | 0 | 0 |
| 6457 | 0 | 0 |
| 6458 | 0 | 0 |
| 6459 | 0 | 0 |
| 6460 | 0 | 0 |
| 6461 | 0 | 0 |
| 6462 | 6.3 | 6.3 |
| 6463 | 28.4 | 28.4 |
| 6464 | 49.9 | 49.9 |
| 6465 | 75.4 | 75.4 |
| 6466 | 88.9 | 80 |
| 6467 | 81.4 | 80 |
| 6468 | 42.6 | 42.6 |
| 6469 | 71.2 | 71.2 |
| 6470 | 35 | 35 |
| 6471 | 14.9 | 14.9 |
| 6472 | 4.6 | 4.6 |
| 6473 | 0 | 0 |
| 6474 | 0 | 0 |
| 6475 | 0 | 0 |
| 6476 | 0 | 0 |
| 6477 | 0 | 0 |
| 6478 | 0 | 0 |
| 6479 | 0 | 0 |
| 6480 | 0 | 0 |
| 6481 | 0 | 0 |
| 6482 | 0 | 0 |
| 6483 | 0 | 0 |
| 6484 | 0 | 0 |
| 6485 | 0 | 0 |
| 6486 | 0.9 | 0.9 |
| 6487 | 5.4 | 5.4 |
| 6488 | 14.6 | 14.6 |
| 6489 | 30 | 30 |
| 6490 | 27.8 | 27.8 |
| 6491 | 28.3 | 28.3 |
| 6492 | 28.2 | 28.2 |
| 6493 | 21.4 | 21.4 |
| 6494 | 25.7 | 25.7 |
| 6495 | 3.4 | 3.4 |
| 6496 | 1.9 | 1.9 |
| 6497 | 0 | 0 |
| 6498 | 0 | 0 |
| 6499 | 0 | 0 |
| 6500 | 0 | 0 |
| 6501 | 0 | 0 |
| 6502 | 0 | 0 |
| 6503 | 0 | 0 |
| 6504 | 0 | 0 |
| 6505 | 0 | 0 |
| 6506 | 0 | 0 |
| 6507 | 0 | 0 |
| 6508 | 0 | 0 |
| 6509 | 0 | 0 |
| 6510 | 7.4 | 7.4 |
| 6511 | 32.4 | 32.4 |
| 6512 | 54.9 | 54.9 |
| 6513 | 65.4 | 65.4 |
| 6514 | 67.6 | 67.6 |
| 6515 | 76.1 | 76.1 |
| 6516 | 56.4 | 56.4 |
| 6517 | 38.7 | 38.7 |
| 6518 | 36.6 | 36.6 |
| 6519 | 16.1 | 16.1 |
| 6520 | 6 | 6 |
| 6521 | 0 | 0 |
| 6522 | 0 | 0 |
| 6523 | 0 | 0 |
| 6524 | 0 | 0 |
| 6525 | 0 | 0 |
| 6526 | 0 | 0 |
| 6527 | 0 | 0 |
| 6528 | 0 | 0 |
| 6529 | 0 | 0 |
| 6530 | 0 | 0 |
| 6531 | 0 | 0 |
| 6532 | 0 | 0 |
| 6533 | 0 | 0 |
| 6534 | 2 | 2 |
| 6535 | 10.1 | 10.1 |
| 6536 | 20.4 | 20.4 |
| 6537 | 24.8 | 24.8 |
| 6538 | 78.9 | 78.9 |
| 6539 | 90.9 | 80 |
| 6540 | 53.2 | 53.2 |
| 6541 | 66.4 | 66.4 |
| 6542 | 45.2 | 45.2 |
| 6543 | 19.7 | 19.7 |
| 6544 | 11.2 | 11.2 |
| 6545 | 0 | 0 |
| 6546 | 0 | 0 |
| 6547 | 0 | 0 |
| 6548 | 0 | 0 |
| 6549 | 0 | 0 |
| 6550 | 0 | 0 |
| 6551 | 0 | 0 |
| 6552 | 0 | 0 |
| 6553 | 0 | 0 |
| 6554 | 0 | 0 |
| 6555 | 0 | 0 |
| 6556 | 0 | 0 |
| 6557 | 0 | 0 |
| 6558 | 4.6 | 4.6 |
| 6559 | 25.8 | 25.8 |
| 6560 | 30.2 | 30.2 |
| 6561 | 19.3 | 19.3 |
| 6562 | 61.2 | 61.2 |
| 6563 | 97.8 | 80 |
| 6564 | 86.7 | 80 |
| 6565 | 37.6 | 37.6 |
| 6566 | 51.2 | 51.2 |
| 6567 | 34.3 | 34.3 |
| 6568 | 5.2 | 5.2 |
| 6569 | 0 | 0 |
| 6570 | 0 | 0 |
| 6571 | 0 | 0 |
| 6572 | 0 | 0 |
| 6573 | 0 | 0 |
| 6574 | 0 | 0 |
| 6575 | 0 | 0 |
| 6576 | 0 | 0 |
| 6577 | 0 | 0 |
| 6578 | 0 | 0 |
| 6579 | 0 | 0 |
| 6580 | 0 | 0 |
| 6581 | 0 | 0 |
| 6582 | 5.4 | 5.4 |
| 6583 | 11.9 | 11.9 |
| 6584 | 6.1 | 6.1 |
| 6585 | 7.4 | 7.4 |
| 6586 | 12.1 | 12.1 |
| 6587 | 7.7 | 7.7 |
| 6588 | 6.1 | 6.1 |
| 6589 | 11.7 | 11.7 |
| 6590 | 4 | 4 |
| 6591 | 2.4 | 2.4 |
| 6592 | 5.3 | 5.3 |
| 6593 | 0 | 0 |
| 6594 | 0 | 0 |
| 6595 | 0 | 0 |
| 6596 | 0 | 0 |
| 6597 | 0 | 0 |
| 6598 | 0 | 0 |
| 6599 | 0 | 0 |
| 6600 | 0 | 0 |
| 6601 | 0 | 0 |
| 6602 | 0 | 0 |
| 6603 | 0 | 0 |
| 6604 | 0 | 0 |
| 6605 | 0 | 0 |
| 6606 | 8.3 | 8.3 |
| 6607 | 13.9 | 13.9 |
| 6608 | 32.4 | 32.4 |
| 6609 | 32.6 | 32.6 |
| 6610 | 37.7 | 37.7 |
| 6611 | 46.3 | 46.3 |
| 6612 | 26.1 | 26.1 |
| 6613 | 15.4 | 15.4 |
| 6614 | 31.9 | 31.9 |
| 6615 | 23.9 | 23.9 |
| 6616 | 12.2 | 12.2 |
| 6617 | 0 | 0 |
| 6618 | 0 | 0 |
| 6619 | 0 | 0 |
| 6620 | 0 | 0 |
| 6621 | 0 | 0 |
| 6622 | 0 | 0 |
| 6623 | 0 | 0 |
| 6624 | 0 | 0 |
| 6625 | 0 | 0 |
| 6626 | 0 | 0 |
| 6627 | 0 | 0 |
| 6628 | 0 | 0 |
| 6629 | 0 | 0 |
| 6630 | 3.3 | 3.3 |
| 6631 | 8.4 | 8.4 |
| 6632 | 25 | 25 |
| 6633 | 42.6 | 42.6 |
| 6634 | 87.1 | 80 |
| 6635 | 87.4 | 80 |
| 6636 | 93 | 80 |
| 6637 | 82.2 | 80 |
| 6638 | 64.3 | 64.3 |
| 6639 | 41.9 | 41.9 |
| 6640 | 18.2 | 18.2 |
| 6641 | 0 | 0 |
| 6642 | 0 | 0 |
| 6643 | 0 | 0 |
| 6644 | 0 | 0 |
| 6645 | 0 | 0 |
| 6646 | 0 | 0 |
| 6647 | 0 | 0 |
| 6648 | 0 | 0 |
| 6649 | 0 | 0 |
| 6650 | 0 | 0 |
| 6651 | 0 | 0 |
| 6652 | 0 | 0 |
| 6653 | 0 | 0 |
| 6654 | 2.3 | 2.3 |
| 6655 | 7.7 | 7.7 |
| 6656 | 14.2 | 14.2 |
| 6657 | 18.9 | 18.9 |
| 6658 | 27.7 | 27.7 |
| 6659 | 81.3 | 80 |
| 6660 | 94.1 | 80 |
| 6661 | 84 | 80 |
| 6662 | 66 | 66 |
| 6663 | 42.2 | 42.2 |
| 6664 | 17.7 | 17.7 |
| 6665 | 0 | 0 |
| 6666 | 0 | 0 |
| 6667 | 0 | 0 |
| 6668 | 0 | 0 |
| 6669 | 0 | 0 |
| 6670 | 0 | 0 |
| 6671 | 0 | 0 |
| 6672 | 0 | 0 |
| 6673 | 0 | 0 |
| 6674 | 0 | 0 |
| 6675 | 0 | 0 |
| 6676 | 0 | 0 |
| 6677 | 0 | 0 |
| 6678 | 0 | 0 |
| 6679 | 28.7 | 28.7 |
| 6680 | 52.6 | 52.6 |
| 6681 | 73.2 | 73.2 |
| 6682 | 87.2 | 80 |
| 6683 | 93.3 | 80 |
| 6684 | 91.1 | 80 |
| 6685 | 80 | 80 |
| 6686 | 62.2 | 62.2 |
| 6687 | 41.2 | 41.2 |
| 6688 | 12.7 | 12.7 |
| 6689 | 0 | 0 |
| 6690 | 0 | 0 |
| 6691 | 0 | 0 |
| 6692 | 0 | 0 |
| 6693 | 0 | 0 |
| 6694 | 0 | 0 |
| 6695 | 0 | 0 |
| 6696 | 0 | 0 |
| 6697 | 0 | 0 |
| 6698 | 0 | 0 |
| 6699 | 0 | 0 |
| 6700 | 0 | 0 |
| 6701 | 0 | 0 |
| 6702 | 0 | 0 |
| 6703 | 26.3 | 26.3 |
| 6704 | 44.6 | 44.6 |
| 6705 | 67.4 | 67.4 |
| 6706 | 81.6 | 80 |
| 6707 | 87.3 | 80 |
| 6708 | 85.7 | 80 |
| 6709 | 73.6 | 73.6 |
| 6710 | 57.1 | 57.1 |
| 6711 | 37 | 37 |
| 6712 | 14.2 | 14.2 |
| 6713 | 0 | 0 |
| 6714 | 0 | 0 |
| 6715 | 0 | 0 |
| 6716 | 0 | 0 |
| 6717 | 0 | 0 |
| 6718 | 0 | 0 |
| 6719 | 0 | 0 |
| 6720 | 0 | 0 |
| 6721 | 0 | 0 |
| 6722 | 0 | 0 |
| 6723 | 0 | 0 |
| 6724 | 0 | 0 |
| 6725 | 0 | 0 |
| 6726 | 0 | 0 |
| 6727 | 4 | 4 |
| 6728 | 13.1 | 13.1 |
| 6729 | 56.9 | 56.9 |
| 6730 | 76.8 | 76.8 |
| 6731 | 82.2 | 80 |
| 6732 | 79.9 | 79.9 |
| 6733 | 70.1 | 70.1 |
| 6734 | 52.4 | 52.4 |
| 6735 | 31 | 31 |
| 6736 | 9.8 | 9.8 |
| 6737 | 0 | 0 |
| 6738 | 0 | 0 |
| 6739 | 0 | 0 |
| 6740 | 0 | 0 |
| 6741 | 0 | 0 |
| 6742 | 0 | 0 |
| 6743 | 0 | 0 |
| 6744 | 0 | 0 |
| 6745 | 0 | 0 |
| 6746 | 0 | 0 |
| 6747 | 0 | 0 |
| 6748 | 0 | 0 |
| 6749 | 0 | 0 |
| 6750 | 0 | 0 |
| 6751 | 21.1 | 21.1 |
| 6752 | 46.1 | 46.1 |
| 6753 | 58.1 | 58.1 |
| 6754 | 61.6 | 61.6 |
| 6755 | 58.6 | 58.6 |
| 6756 | 27.3 | 27.3 |
| 6757 | 18.7 | 18.7 |
| 6758 | 9.9 | 9.9 |
| 6759 | 6.6 | 6.6 |
| 6760 | 0.8 | 0.8 |
| 6761 | 0 | 0 |
| 6762 | 0 | 0 |
| 6763 | 0 | 0 |
| 6764 | 0 | 0 |
| 6765 | 0 | 0 |
| 6766 | 0 | 0 |
| 6767 | 0 | 0 |
| 6768 | 0 | 0 |
| 6769 | 0 | 0 |
| 6770 | 0 | 0 |
| 6771 | 0 | 0 |
| 6772 | 0 | 0 |
| 6773 | 0 | 0 |
| 6774 | 0 | 0 |
| 6775 | 6.3 | 6.3 |
| 6776 | 36.8 | 36.8 |
| 6777 | 58.1 | 58.1 |
| 6778 | 78.6 | 78.6 |
| 6779 | 89.1 | 80 |
| 6780 | 78.3 | 78.3 |
| 6781 | 66.1 | 66.1 |
| 6782 | 36.1 | 36.1 |
| 6783 | 12.9 | 12.9 |
| 6784 | 2.8 | 2.8 |
| 6785 | 0 | 0 |
| 6786 | 0 | 0 |
| 6787 | 0 | 0 |
| 6788 | 0 | 0 |
| 6789 | 0 | 0 |
| 6790 | 0 | 0 |
| 6791 | 0 | 0 |
| 6792 | 0 | 0 |
| 6793 | 0 | 0 |
| 6794 | 0 | 0 |
| 6795 | 0 | 0 |
| 6796 | 0 | 0 |
| 6797 | 0 | 0 |
| 6798 | 0 | 0 |
| 6799 | 4.9 | 4.9 |
| 6800 | 9.9 | 9.9 |
| 6801 | 32.3 | 32.3 |
| 6802 | 73.7 | 73.7 |
| 6803 | 81.3 | 80 |
| 6804 | 79.2 | 79.2 |
| 6805 | 69 | 69 |
| 6806 | 52.1 | 52.1 |
| 6807 | 30.2 | 30.2 |
| 6808 | 9.6 | 9.6 |
| 6809 | 0 | 0 |
| 6810 | 0 | 0 |
| 6811 | 0 | 0 |
| 6812 | 0 | 0 |
| 6813 | 0 | 0 |
| 6814 | 0 | 0 |
| 6815 | 0 | 0 |
| 6816 | 0 | 0 |
| 6817 | 0 | 0 |
| 6818 | 0 | 0 |
| 6819 | 0 | 0 |
| 6820 | 0 | 0 |
| 6821 | 0 | 0 |
| 6822 | 0 | 0 |
| 6823 | 4 | 4 |
| 6824 | 9.6 | 9.6 |
| 6825 | 31.7 | 31.7 |
| 6826 | 71.3 | 71.3 |
| 6827 | 79.8 | 79.8 |
| 6828 | 77.4 | 77.4 |
| 6829 | 67.9 | 67.9 |
| 6830 | 48.1 | 48.1 |
| 6831 | 26.9 | 26.9 |
| 6832 | 6.9 | 6.9 |
| 6833 | 0 | 0 |
| 6834 | 0 | 0 |
| 6835 | 0 | 0 |
| 6836 | 0 | 0 |
| 6837 | 0 | 0 |
| 6838 | 0 | 0 |
| 6839 | 0 | 0 |
| 6840 | 0 | 0 |
| 6841 | 0 | 0 |
| 6842 | 0 | 0 |
| 6843 | 0 | 0 |
| 6844 | 0 | 0 |
| 6845 | 0 | 0 |
| 6846 | 0 | 0 |
| 6847 | 4.4 | 4.4 |
| 6848 | 7.6 | 7.6 |
| 6849 | 20.1 | 20.1 |
| 6850 | 59.2 | 59.2 |
| 6851 | 76.8 | 76.8 |
| 6852 | 77.6 | 77.6 |
| 6853 | 67.3 | 67.3 |
| 6854 | 49.4 | 49.4 |
| 6855 | 28.8 | 28.8 |
| 6856 | 8.4 | 8.4 |
| 6857 | 0 | 0 |
| 6858 | 0 | 0 |
| 6859 | 0 | 0 |
| 6860 | 0 | 0 |
| 6861 | 0 | 0 |
| 6862 | 0 | 0 |
| 6863 | 0 | 0 |
| 6864 | 0 | 0 |
| 6865 | 0 | 0 |
| 6866 | 0 | 0 |
| 6867 | 0 | 0 |
| 6868 | 0 | 0 |
| 6869 | 0 | 0 |
| 6870 | 0 | 0 |
| 6871 | 5 | 5 |
| 6872 | 12.4 | 12.4 |
| 6873 | 8.4 | 8.4 |
| 6874 | 12 | 12 |
| 6875 | 7.4 | 7.4 |
| 6876 | 12.9 | 12.9 |
| 6877 | 51.2 | 51.2 |
| 6878 | 48.9 | 48.9 |
| 6879 | 29.9 | 29.9 |
| 6880 | 0 | 0 |
| 6881 | 0 | 0 |
| 6882 | 0 | 0 |
| 6883 | 0 | 0 |
| 6884 | 0 | 0 |
| 6885 | 0 | 0 |
| 6886 | 0 | 0 |
| 6887 | 0 | 0 |
| 6888 | 0 | 0 |
| 6889 | 0 | 0 |
| 6890 | 0 | 0 |
| 6891 | 0 | 0 |
| 6892 | 0 | 0 |
| 6893 | 0 | 0 |
| 6894 | 0 | 0 |
| 6895 | 27.8 | 27.8 |
| 6896 | 51.2 | 51.2 |
| 6897 | 73.9 | 73.9 |
| 6898 | 88.2 | 80 |
| 6899 | 94 | 80 |
| 6900 | 90.8 | 80 |
| 6901 | 79.1 | 79.1 |
| 6902 | 60 | 60 |
| 6903 | 36.1 | 36.1 |
| 6904 | 0 | 0 |
| 6905 | 0 | 0 |
| 6906 | 0 | 0 |
| 6907 | 0 | 0 |
| 6908 | 0 | 0 |
| 6909 | 0 | 0 |
| 6910 | 0 | 0 |
| 6911 | 0 | 0 |
| 6912 | 0 | 0 |
| 6913 | 0 | 0 |
| 6914 | 0 | 0 |
| 6915 | 0 | 0 |
| 6916 | 0 | 0 |
| 6917 | 0 | 0 |
| 6918 | 0 | 0 |
| 6919 | 13.7 | 13.7 |
| 6920 | 8.3 | 8.3 |
| 6921 | 11.7 | 11.7 |
| 6922 | 13 | 13 |
| 6923 | 12 | 12 |
| 6924 | 11.1 | 11.1 |
| 6925 | 9.1 | 9.1 |
| 6926 | 5.9 | 5.9 |
| 6927 | 2.8 | 2.8 |
| 6928 | 0 | 0 |
| 6929 | 0 | 0 |
| 6930 | 0 | 0 |
| 6931 | 0 | 0 |
| 6932 | 0 | 0 |
| 6933 | 0 | 0 |
| 6934 | 0 | 0 |
| 6935 | 0 | 0 |
| 6936 | 0 | 0 |
| 6937 | 0 | 0 |
| 6938 | 0 | 0 |
| 6939 | 0 | 0 |
| 6940 | 0 | 0 |
| 6941 | 0 | 0 |
| 6942 | 0 | 0 |
| 6943 | 3.4 | 3.4 |
| 6944 | 9.4 | 9.4 |
| 6945 | 18.4 | 18.4 |
| 6946 | 31.4 | 31.4 |
| 6947 | 46.4 | 46.4 |
| 6948 | 78.2 | 78.2 |
| 6949 | 74.8 | 74.8 |
| 6950 | 57.6 | 57.6 |
| 6951 | 34.2 | 34.2 |
| 6952 | 0 | 0 |
| 6953 | 0 | 0 |
| 6954 | 0 | 0 |
| 6955 | 0 | 0 |
| 6956 | 0 | 0 |
| 6957 | 0 | 0 |
| 6958 | 0 | 0 |
| 6959 | 0 | 0 |
| 6960 | 0 | 0 |
| 6961 | 0 | 0 |
| 6962 | 0 | 0 |
| 6963 | 0 | 0 |
| 6964 | 0 | 0 |
| 6965 | 0 | 0 |
| 6966 | 0 | 0 |
| 6967 | 23.2 | 23.2 |
| 6968 | 49.8 | 49.8 |
| 6969 | 68.6 | 68.6 |
| 6970 | 82.1 | 80 |
| 6971 | 88 | 80 |
| 6972 | 85.6 | 80 |
| 6973 | 75.2 | 75.2 |
| 6974 | 56.8 | 56.8 |
| 6975 | 33.4 | 33.4 |
| 6976 | 0 | 0 |
| 6977 | 0 | 0 |
| 6978 | 0 | 0 |
| 6979 | 0 | 0 |
| 6980 | 0 | 0 |
| 6981 | 0 | 0 |
| 6982 | 0 | 0 |
| 6983 | 0 | 0 |
| 6984 | 0 | 0 |
| 6985 | 0 | 0 |
| 6986 | 0 | 0 |
| 6987 | 0 | 0 |
| 6988 | 0 | 0 |
| 6989 | 0 | 0 |
| 6990 | 0 | 0 |
| 6991 | 18.9 | 18.9 |
| 6992 | 48.3 | 48.3 |
| 6993 | 67.8 | 67.8 |
| 6994 | 76.9 | 76.9 |
| 6995 | 83.8 | 80 |
| 6996 | 80.4 | 80 |
| 6997 | 73.9 | 73.9 |
| 6998 | 54.7 | 54.7 |
| 6999 | 31.4 | 31.4 |
| 7000 | 0 | 0 |
| 7001 | 0 | 0 |
| 7002 | 0 | 0 |
| 7003 | 0 | 0 |
| 7004 | 0 | 0 |
| 7005 | 0 | 0 |
| 7006 | 0 | 0 |
| 7007 | 0 | 0 |
| 7008 | 0 | 0 |
| 7009 | 0 | 0 |
| 7010 | 0 | 0 |
| 7011 | 0 | 0 |
| 7012 | 0 | 0 |
| 7013 | 0 | 0 |
| 7014 | 0 | 0 |
| 7015 | 4.1 | 4.1 |
| 7016 | 8.4 | 8.4 |
| 7017 | 10.7 | 10.7 |
| 7018 | 9 | 9 |
| 7019 | 8.8 | 8.8 |
| 7020 | 11.7 | 11.7 |
| 7021 | 10.2 | 10.2 |
| 7022 | 12.7 | 12.7 |
| 7023 | 4.8 | 4.8 |
| 7024 | 0 | 0 |
| 7025 | 0 | 0 |
| 7026 | 0 | 0 |
| 7027 | 0 | 0 |
| 7028 | 0 | 0 |
| 7029 | 0 | 0 |
| 7030 | 0 | 0 |
| 7031 | 0 | 0 |
| 7032 | 0 | 0 |
| 7033 | 0 | 0 |
| 7034 | 0 | 0 |
| 7035 | 0 | 0 |
| 7036 | 0 | 0 |
| 7037 | 0 | 0 |
| 7038 | 0 | 0 |
| 7039 | 4.9 | 4.9 |
| 7040 | 28.8 | 28.8 |
| 7041 | 42.4 | 42.4 |
| 7042 | 41.4 | 41.4 |
| 7043 | 81.9 | 80 |
| 7044 | 40.9 | 40.9 |
| 7045 | 35.2 | 35.2 |
| 7046 | 12 | 12 |
| 7047 | 3.1 | 3.1 |
| 7048 | 0 | 0 |
| 7049 | 0 | 0 |
| 7050 | 0 | 0 |
| 7051 | 0 | 0 |
| 7052 | 0 | 0 |
| 7053 | 0 | 0 |
| 7054 | 0 | 0 |
| 7055 | 0 | 0 |
| 7056 | 0 | 0 |
| 7057 | 0 | 0 |
| 7058 | 0 | 0 |
| 7059 | 0 | 0 |
| 7060 | 0 | 0 |
| 7061 | 0 | 0 |
| 7062 | 0 | 0 |
| 7063 | 0.3 | 0.3 |
| 7064 | 1.2 | 1.2 |
| 7065 | 14.3 | 14.3 |
| 7066 | 57.9 | 57.9 |
| 7067 | 61.7 | 61.7 |
| 7068 | 18.1 | 18.1 |
| 7069 | 5.7 | 5.7 |
| 7070 | 3.8 | 3.8 |
| 7071 | 1.6 | 1.6 |
| 7072 | 0 | 0 |
| 7073 | 0 | 0 |
| 7074 | 0 | 0 |
| 7075 | 0 | 0 |
| 7076 | 0 | 0 |
| 7077 | 0 | 0 |
| 7078 | 0 | 0 |
| 7079 | 0 | 0 |
| 7080 | 0 | 0 |
| 7081 | 0 | 0 |
| 7082 | 0 | 0 |
| 7083 | 0 | 0 |
| 7084 | 0 | 0 |
| 7085 | 0 | 0 |
| 7086 | 0 | 0 |
| 7087 | 1.7 | 1.7 |
| 7088 | 6.2 | 6.2 |
| 7089 | 8.2 | 8.2 |
| 7090 | 8.9 | 8.9 |
| 7091 | 6.3 | 6.3 |
| 7092 | 6.9 | 6.9 |
| 7093 | 6.3 | 6.3 |
| 7094 | 5 | 5 |
| 7095 | 1 | 1 |
| 7096 | 0 | 0 |
| 7097 | 0 | 0 |
| 7098 | 0 | 0 |
| 7099 | 0 | 0 |
| 7100 | 0 | 0 |
| 7101 | 0 | 0 |
| 7102 | 0 | 0 |
| 7103 | 0 | 0 |
| 7104 | 0 | 0 |
| 7105 | 0 | 0 |
| 7106 | 0 | 0 |
| 7107 | 0 | 0 |
| 7108 | 0 | 0 |
| 7109 | 0 | 0 |
| 7110 | 0 | 0 |
| 7111 | 4.7 | 4.7 |
| 7112 | 34.6 | 34.6 |
| 7113 | 68 | 68 |
| 7114 | 82.7 | 80 |
| 7115 | 88.6 | 80 |
| 7116 | 85.3 | 80 |
| 7117 | 73.3 | 73.3 |
| 7118 | 53.9 | 53.9 |
| 7119 | 29.7 | 29.7 |
| 7120 | 0 | 0 |
| 7121 | 0 | 0 |
| 7122 | 0 | 0 |
| 7123 | 0 | 0 |
| 7124 | 0 | 0 |
| 7125 | 0 | 0 |
| 7126 | 0 | 0 |
| 7127 | 0 | 0 |
| 7128 | 0 | 0 |
| 7129 | 0 | 0 |
| 7130 | 0 | 0 |
| 7131 | 0 | 0 |
| 7132 | 0 | 0 |
| 7133 | 0 | 0 |
| 7134 | 0 | 0 |
| 7135 | 1.2 | 1.2 |
| 7136 | 3.2 | 3.2 |
| 7137 | 3.7 | 3.7 |
| 7138 | 3.7 | 3.7 |
| 7139 | 3.4 | 3.4 |
| 7140 | 2.9 | 2.9 |
| 7141 | 2.4 | 2.4 |
| 7142 | 1.7 | 1.7 |
| 7143 | 0.8 | 0.8 |
| 7144 | 0 | 0 |
| 7145 | 0 | 0 |
| 7146 | 0 | 0 |
| 7147 | 0 | 0 |
| 7148 | 0 | 0 |
| 7149 | 0 | 0 |
| 7150 | 0 | 0 |
| 7151 | 0 | 0 |
| 7152 | 0 | 0 |
| 7153 | 0 | 0 |
| 7154 | 0 | 0 |
| 7155 | 0 | 0 |
| 7156 | 0 | 0 |
| 7157 | 0 | 0 |
| 7158 | 0 | 0 |
| 7159 | 0.6 | 0.6 |
| 7160 | 5.6 | 5.6 |
| 7161 | 8.1 | 8.1 |
| 7162 | 53.1 | 53.1 |
| 7163 | 83.6 | 80 |
| 7164 | 80.2 | 80 |
| 7165 | 69 | 69 |
| 7166 | 50.6 | 50.6 |
| 7167 | 27.6 | 27.6 |
| 7168 | 0 | 0 |
| 7169 | 0 | 0 |
| 7170 | 0 | 0 |
| 7171 | 0 | 0 |
| 7172 | 0 | 0 |
| 7173 | 0 | 0 |
| 7174 | 0 | 0 |
| 7175 | 0 | 0 |
| 7176 | 0 | 0 |
| 7177 | 0 | 0 |
| 7178 | 0 | 0 |
| 7179 | 0 | 0 |
| 7180 | 0 | 0 |
| 7181 | 0 | 0 |
| 7182 | 0 | 0 |
| 7183 | 16.6 | 16.6 |
| 7184 | 28.4 | 28.4 |
| 7185 | 38 | 38 |
| 7186 | 33.6 | 33.6 |
| 7187 | 30.7 | 30.7 |
| 7188 | 14 | 14 |
| 7189 | 16 | 16 |
| 7190 | 16.3 | 16.3 |
| 7191 | 2.9 | 2.9 |
| 7192 | 0 | 0 |
| 7193 | 0 | 0 |
| 7194 | 0 | 0 |
| 7195 | 0 | 0 |
| 7196 | 0 | 0 |
| 7197 | 0 | 0 |
| 7198 | 0 | 0 |
| 7199 | 0 | 0 |
| 7200 | 0 | 0 |
| 7201 | 0 | 0 |
| 7202 | 0 | 0 |
| 7203 | 0 | 0 |
| 7204 | 0 | 0 |
| 7205 | 0 | 0 |
| 7206 | 0 | 0 |
| 7207 | 2.7 | 2.7 |
| 7208 | 5.2 | 5.2 |
| 7209 | 29.9 | 29.9 |
| 7210 | 14.8 | 14.8 |
| 7211 | 42.7 | 42.7 |
| 7212 | 73 | 73 |
| 7213 | 62 | 62 |
| 7214 | 42.2 | 42.2 |
| 7215 | 20.3 | 20.3 |
| 7216 | 0 | 0 |
| 7217 | 0 | 0 |
| 7218 | 0 | 0 |
| 7219 | 0 | 0 |
| 7220 | 0 | 0 |
| 7221 | 0 | 0 |
| 7222 | 0 | 0 |
| 7223 | 0 | 0 |
| 7224 | 0 | 0 |
| 7225 | 0 | 0 |
| 7226 | 0 | 0 |
| 7227 | 0 | 0 |
| 7228 | 0 | 0 |
| 7229 | 0 | 0 |
| 7230 | 0 | 0 |
| 7231 | 10.7 | 10.7 |
| 7232 | 31.4 | 31.4 |
| 7233 | 52.2 | 52.2 |
| 7234 | 67.9 | 67.9 |
| 7235 | 74.2 | 74.2 |
| 7236 | 64.2 | 64.2 |
| 7237 | 36.9 | 36.9 |
| 7238 | 5.4 | 5.4 |
| 7239 | 5.2 | 5.2 |
| 7240 | 0 | 0 |
| 7241 | 0 | 0 |
| 7242 | 0 | 0 |
| 7243 | 0 | 0 |
| 7244 | 0 | 0 |
| 7245 | 0 | 0 |
| 7246 | 0 | 0 |
| 7247 | 0 | 0 |
| 7248 | 0 | 0 |
| 7249 | 0 | 0 |
| 7250 | 0 | 0 |
| 7251 | 0 | 0 |
| 7252 | 0 | 0 |
| 7253 | 0 | 0 |
| 7254 | 0 | 0 |
| 7255 | 0 | 0 |
| 7256 | 4.6 | 4.6 |
| 7257 | 7.8 | 7.8 |
| 7258 | 30.4 | 30.4 |
| 7259 | 23.1 | 23.1 |
| 7260 | 24 | 24 |
| 7261 | 22.8 | 22.8 |
| 7262 | 6.8 | 6.8 |
| 7263 | 2.1 | 2.1 |
| 7264 | 0 | 0 |
| 7265 | 0 | 0 |
| 7266 | 0 | 0 |
| 7267 | 0 | 0 |
| 7268 | 0 | 0 |
| 7269 | 0 | 0 |
| 7270 | 0 | 0 |
| 7271 | 0 | 0 |
| 7272 | 0 | 0 |
| 7273 | 0 | 0 |
| 7274 | 0 | 0 |
| 7275 | 0 | 0 |
| 7276 | 0 | 0 |
| 7277 | 0 | 0 |
| 7278 | 0 | 0 |
| 7279 | 0 | 0 |
| 7280 | 4.3 | 4.3 |
| 7281 | 19.2 | 19.2 |
| 7282 | 47.9 | 47.9 |
| 7283 | 64 | 64 |
| 7284 | 53.3 | 53.3 |
| 7285 | 48.7 | 48.7 |
| 7286 | 18.7 | 18.7 |
| 7287 | 11.3 | 11.3 |
| 7288 | 0 | 0 |
| 7289 | 0 | 0 |
| 7290 | 0 | 0 |
| 7291 | 0 | 0 |
| 7292 | 0 | 0 |
| 7293 | 0 | 0 |
| 7294 | 0 | 0 |
| 7295 | 0 | 0 |
| 7296 | 0 | 0 |
| 7297 | 0 | 0 |
| 7298 | 0 | 0 |
| 7299 | 0 | 0 |
| 7300 | 0 | 0 |
| 7301 | 0 | 0 |
| 7302 | 0 | 0 |
| 7303 | 0 | 0 |
| 7304 | 4.9 | 4.9 |
| 7305 | 15 | 15 |
| 7306 | 28.8 | 28.8 |
| 7307 | 50.6 | 50.6 |
| 7308 | 43.6 | 43.6 |
| 7309 | 24.7 | 24.7 |
| 7310 | 6.4 | 6.4 |
| 7311 | 1.4 | 1.4 |
| 7312 | 0 | 0 |
| 7313 | 0 | 0 |
| 7314 | 0 | 0 |
| 7315 | 0 | 0 |
| 7316 | 0 | 0 |
| 7317 | 0 | 0 |
| 7318 | 0 | 0 |
| 7319 | 0 | 0 |
| 7320 | 0 | 0 |
| 7321 | 0 | 0 |
| 7322 | 0 | 0 |
| 7323 | 0 | 0 |
| 7324 | 0 | 0 |
| 7325 | 0 | 0 |
| 7326 | 0 | 0 |
| 7327 | 0 | 0 |
| 7328 | 2.6 | 2.6 |
| 7329 | 30.3 | 30.3 |
| 7330 | 58 | 58 |
| 7331 | 41.2 | 41.2 |
| 7332 | 9.3 | 9.3 |
| 7333 | 24.2 | 24.2 |
| 7334 | 15.3 | 15.3 |
| 7335 | 5.7 | 5.7 |
| 7336 | 0 | 0 |
| 7337 | 0 | 0 |
| 7338 | 0 | 0 |
| 7339 | 0 | 0 |
| 7340 | 0 | 0 |
| 7341 | 0 | 0 |
| 7342 | 0 | 0 |
| 7343 | 0 | 0 |
| 7344 | 0 | 0 |
| 7345 | 0 | 0 |
| 7346 | 0 | 0 |
| 7347 | 0 | 0 |
| 7348 | 0 | 0 |
| 7349 | 0 | 0 |
| 7350 | 0 | 0 |
| 7351 | 0 | 0 |
| 7352 | 6.1 | 6.1 |
| 7353 | 10.2 | 10.2 |
| 7354 | 7.8 | 7.8 |
| 7355 | 3.7 | 3.7 |
| 7356 | 2.1 | 2.1 |
| 7357 | 2.1 | 2.1 |
| 7358 | 1.8 | 1.8 |
| 7359 | 0.9 | 0.9 |
| 7360 | 0 | 0 |
| 7361 | 0 | 0 |
| 7362 | 0 | 0 |
| 7363 | 0 | 0 |
| 7364 | 0 | 0 |
| 7365 | 0 | 0 |
| 7366 | 0 | 0 |
| 7367 | 0 | 0 |
| 7368 | 0 | 0 |
| 7369 | 0 | 0 |
| 7370 | 0 | 0 |
| 7371 | 0 | 0 |
| 7372 | 0 | 0 |
| 7373 | 0 | 0 |
| 7374 | 0 | 0 |
| 7375 | 0 | 0 |
| 7376 | 10.8 | 10.8 |
| 7377 | 7.1 | 7.1 |
| 7378 | 20.9 | 20.9 |
| 7379 | 31.6 | 31.6 |
| 7380 | 44.8 | 44.8 |
| 7381 | 16.4 | 16.4 |
| 7382 | 6 | 6 |
| 7383 | 1.3 | 1.3 |
| 7384 | 0 | 0 |
| 7385 | 0 | 0 |
| 7386 | 0 | 0 |
| 7387 | 0 | 0 |
| 7388 | 0 | 0 |
| 7389 | 0 | 0 |
| 7390 | 0 | 0 |
| 7391 | 0 | 0 |
| 7392 | 0 | 0 |
| 7393 | 0 | 0 |
| 7394 | 0 | 0 |
| 7395 | 0 | 0 |
| 7396 | 0 | 0 |
| 7397 | 0 | 0 |
| 7398 | 0 | 0 |
| 7399 | 0 | 0 |
| 7400 | 2.7 | 2.7 |
| 7401 | 7.2 | 7.2 |
| 7402 | 9 | 9 |
| 7403 | 7.2 | 7.2 |
| 7404 | 5.9 | 5.9 |
| 7405 | 3.4 | 3.4 |
| 7406 | 2.8 | 2.8 |
| 7407 | 2 | 2 |
| 7408 | 0 | 0 |
| 7409 | 0 | 0 |
| 7410 | 0 | 0 |
| 7411 | 0 | 0 |
| 7412 | 0 | 0 |
| 7413 | 0 | 0 |
| 7414 | 0 | 0 |
| 7415 | 0 | 0 |
| 7416 | 0 | 0 |
| 7417 | 0 | 0 |
| 7418 | 0 | 0 |
| 7419 | 0 | 0 |
| 7420 | 0 | 0 |
| 7421 | 0 | 0 |
| 7422 | 0 | 0 |
| 7423 | 0 | 0 |
| 7424 | 6 | 6 |
| 7425 | 7.7 | 7.7 |
| 7426 | 5.9 | 5.9 |
| 7427 | 3.8 | 3.8 |
| 7428 | 2.9 | 2.9 |
| 7429 | 2.7 | 2.7 |
| 7430 | 1.9 | 1.9 |
| 7431 | 0 | 0 |
| 7432 | 0 | 0 |
| 7433 | 0 | 0 |
| 7434 | 0 | 0 |
| 7435 | 0 | 0 |
| 7436 | 0 | 0 |
| 7437 | 0 | 0 |
| 7438 | 0 | 0 |
| 7439 | 0 | 0 |
| 7440 | 0 | 0 |
| 7441 | 0 | 0 |
| 7442 | 0 | 0 |
| 7443 | 0 | 0 |
| 7444 | 0 | 0 |
| 7445 | 0 | 0 |
| 7446 | 0 | 0 |
| 7447 | 0 | 0 |
| 7448 | 8.2 | 8.2 |
| 7449 | 8.9 | 8.9 |
| 7450 | 9.3 | 9.3 |
| 7451 | 7.9 | 7.9 |
| 7452 | 6.3 | 6.3 |
| 7453 | 5.2 | 5.2 |
| 7454 | 3.2 | 3.2 |
| 7455 | 0 | 0 |
| 7456 | 0 | 0 |
| 7457 | 0 | 0 |
| 7458 | 0 | 0 |
| 7459 | 0 | 0 |
| 7460 | 0 | 0 |
| 7461 | 0 | 0 |
| 7462 | 0 | 0 |
| 7463 | 0 | 0 |
| 7464 | 0 | 0 |
| 7465 | 0 | 0 |
| 7466 | 0 | 0 |
| 7467 | 0 | 0 |
| 7468 | 0 | 0 |
| 7469 | 0 | 0 |
| 7470 | 0 | 0 |
| 7471 | 0 | 0 |
| 7472 | 9.8 | 9.8 |
| 7473 | 14.4 | 14.4 |
| 7474 | 24.7 | 24.7 |
| 7475 | 28 | 28 |
| 7476 | 34.3 | 34.3 |
| 7477 | 13.9 | 13.9 |
| 7478 | 13.1 | 13.1 |
| 7479 | 0 | 0 |
| 7480 | 0 | 0 |
| 7481 | 0 | 0 |
| 7482 | 0 | 0 |
| 7483 | 0 | 0 |
| 7484 | 0 | 0 |
| 7485 | 0 | 0 |
| 7486 | 0 | 0 |
| 7487 | 0 | 0 |
| 7488 | 0 | 0 |
| 7489 | 0 | 0 |
| 7490 | 0 | 0 |
| 7491 | 0 | 0 |
| 7492 | 0 | 0 |
| 7493 | 0 | 0 |
| 7494 | 0 | 0 |
| 7495 | 0 | 0 |
| 7496 | 2.1 | 2.1 |
| 7497 | 3.9 | 3.9 |
| 7498 | 8.9 | 8.9 |
| 7499 | 20 | 20 |
| 7500 | 47.8 | 47.8 |
| 7501 | 49.7 | 49.7 |
| 7502 | 31.8 | 31.8 |
| 7503 | 0 | 0 |
| 7504 | 0 | 0 |
| 7505 | 0 | 0 |
| 7506 | 0 | 0 |
| 7507 | 0 | 0 |
| 7508 | 0 | 0 |
| 7509 | 0 | 0 |
| 7510 | 0 | 0 |
| 7511 | 0 | 0 |
| 7512 | 0 | 0 |
| 7513 | 0 | 0 |
| 7514 | 0 | 0 |
| 7515 | 0 | 0 |
| 7516 | 0 | 0 |
| 7517 | 0 | 0 |
| 7518 | 0 | 0 |
| 7519 | 0 | 0 |
| 7520 | 27.4 | 27.4 |
| 7521 | 31.1 | 31.1 |
| 7522 | 40.4 | 40.4 |
| 7523 | 30.9 | 30.9 |
| 7524 | 16.3 | 16.3 |
| 7525 | 18.1 | 18.1 |
| 7526 | 7.6 | 7.6 |
| 7527 | 0 | 0 |
| 7528 | 0 | 0 |
| 7529 | 0 | 0 |
| 7530 | 0 | 0 |
| 7531 | 0 | 0 |
| 7532 | 0 | 0 |
| 7533 | 0 | 0 |
| 7534 | 0 | 0 |
| 7535 | 0 | 0 |
| 7536 | 0 | 0 |
| 7537 | 0 | 0 |
| 7538 | 0 | 0 |
| 7539 | 0 | 0 |
| 7540 | 0 | 0 |
| 7541 | 0 | 0 |
| 7542 | 0 | 0 |
| 7543 | 0 | 0 |
| 7544 | 3.7 | 3.7 |
| 7545 | 8.7 | 8.7 |
| 7546 | 18.9 | 18.9 |
| 7547 | 22.7 | 22.7 |
| 7548 | 12.8 | 12.8 |
| 7549 | 10.2 | 10.2 |
| 7550 | 6 | 6 |
| 7551 | 0 | 0 |
| 7552 | 0 | 0 |
| 7553 | 0 | 0 |
| 7554 | 0 | 0 |
| 7555 | 0 | 0 |
| 7556 | 0 | 0 |
| 7557 | 0 | 0 |
| 7558 | 0 | 0 |
| 7559 | 0 | 0 |
| 7560 | 0 | 0 |
| 7561 | 0 | 0 |
| 7562 | 0 | 0 |
| 7563 | 0 | 0 |
| 7564 | 0 | 0 |
| 7565 | 0 | 0 |
| 7566 | 0 | 0 |
| 7567 | 0 | 0 |
| 7568 | 3.1 | 3.1 |
| 7569 | 14.1 | 14.1 |
| 7570 | 6.3 | 6.3 |
| 7571 | 5.1 | 5.1 |
| 7572 | 5.4 | 5.4 |
| 7573 | 5.3 | 5.3 |
| 7574 | 4.4 | 4.4 |
| 7575 | 0 | 0 |
| 7576 | 0 | 0 |
| 7577 | 0 | 0 |
| 7578 | 0 | 0 |
| 7579 | 0 | 0 |
| 7580 | 0 | 0 |
| 7581 | 0 | 0 |
| 7582 | 0 | 0 |
| 7583 | 0 | 0 |
| 7584 | 0 | 0 |
| 7585 | 0 | 0 |
| 7586 | 0 | 0 |
| 7587 | 0 | 0 |
| 7588 | 0 | 0 |
| 7589 | 0 | 0 |
| 7590 | 0 | 0 |
| 7591 | 0 | 0 |
| 7592 | 7.4 | 7.4 |
| 7593 | 31.6 | 31.6 |
| 7594 | 33.8 | 33.8 |
| 7595 | 12.9 | 12.9 |
| 7596 | 10.3 | 10.3 |
| 7597 | 8.3 | 8.3 |
| 7598 | 13.3 | 13.3 |
| 7599 | 0 | 0 |
| 7600 | 0 | 0 |
| 7601 | 0 | 0 |
| 7602 | 0 | 0 |
| 7603 | 0 | 0 |
| 7604 | 0 | 0 |
| 7605 | 0 | 0 |
| 7606 | 0 | 0 |
| 7607 | 0 | 0 |
| 7608 | 0 | 0 |
| 7609 | 0 | 0 |
| 7610 | 0 | 0 |
| 7611 | 0 | 0 |
| 7612 | 0 | 0 |
| 7613 | 0 | 0 |
| 7614 | 0 | 0 |
| 7615 | 0 | 0 |
| 7616 | 0.9 | 0.9 |
| 7617 | 1.8 | 1.8 |
| 7618 | 3.6 | 3.6 |
| 7619 | 4.2 | 4.2 |
| 7620 | 2.4 | 2.4 |
| 7621 | 1.4 | 1.4 |
| 7622 | 1 | 1 |
| 7623 | 0 | 0 |
| 7624 | 0 | 0 |
| 7625 | 0 | 0 |
| 7626 | 0 | 0 |
| 7627 | 0 | 0 |
| 7628 | 0 | 0 |
| 7629 | 0 | 0 |
| 7630 | 0 | 0 |
| 7631 | 0 | 0 |
| 7632 | 0 | 0 |
| 7633 | 0 | 0 |
| 7634 | 0 | 0 |
| 7635 | 0 | 0 |
| 7636 | 0 | 0 |
| 7637 | 0 | 0 |
| 7638 | 0 | 0 |
| 7639 | 0 | 0 |
| 7640 | 11.1 | 11.1 |
| 7641 | 29.3 | 29.3 |
| 7642 | 24.4 | 24.4 |
| 7643 | 10.1 | 10.1 |
| 7644 | 17.9 | 17.9 |
| 7645 | 35.1 | 35.1 |
| 7646 | 30.6 | 30.6 |
| 7647 | 0 | 0 |
| 7648 | 0 | 0 |
| 7649 | 0 | 0 |
| 7650 | 0 | 0 |
| 7651 | 0 | 0 |
| 7652 | 0 | 0 |
| 7653 | 0 | 0 |
| 7654 | 0 | 0 |
| 7655 | 0 | 0 |
| 7656 | 0 | 0 |
| 7657 | 0 | 0 |
| 7658 | 0 | 0 |
| 7659 | 0 | 0 |
| 7660 | 0 | 0 |
| 7661 | 0 | 0 |
| 7662 | 0 | 0 |
| 7663 | 0 | 0 |
| 7664 | 6.8 | 6.8 |
| 7665 | 11.6 | 11.6 |
| 7666 | 21.8 | 21.8 |
| 7667 | 32.3 | 32.3 |
| 7668 | 41 | 41 |
| 7669 | 24.2 | 24.2 |
| 7670 | 7.4 | 7.4 |
| 7671 | 0 | 0 |
| 7672 | 0 | 0 |
| 7673 | 0 | 0 |
| 7674 | 0 | 0 |
| 7675 | 0 | 0 |
| 7676 | 0 | 0 |
| 7677 | 0 | 0 |
| 7678 | 0 | 0 |
| 7679 | 0 | 0 |
| 7680 | 0 | 0 |
| 7681 | 0 | 0 |
| 7682 | 0 | 0 |
| 7683 | 0 | 0 |
| 7684 | 0 | 0 |
| 7685 | 0 | 0 |
| 7686 | 0 | 0 |
| 7687 | 0 | 0 |
| 7688 | 6.9 | 6.9 |
| 7689 | 42.8 | 42.8 |
| 7690 | 57.3 | 57.3 |
| 7691 | 66.9 | 66.9 |
| 7692 | 53.6 | 53.6 |
| 7693 | 41.7 | 41.7 |
| 7694 | 30.7 | 30.7 |
| 7695 | 0 | 0 |
| 7696 | 0 | 0 |
| 7697 | 0 | 0 |
| 7698 | 0 | 0 |
| 7699 | 0 | 0 |
| 7700 | 0 | 0 |
| 7701 | 0 | 0 |
| 7702 | 0 | 0 |
| 7703 | 0 | 0 |
| 7704 | 0 | 0 |
| 7705 | 0 | 0 |
| 7706 | 0 | 0 |
| 7707 | 0 | 0 |
| 7708 | 0 | 0 |
| 7709 | 0 | 0 |
| 7710 | 0 | 0 |
| 7711 | 0 | 0 |
| 7712 | 20.7 | 20.7 |
| 7713 | 39.8 | 39.8 |
| 7714 | 60.3 | 60.3 |
| 7715 | 66.4 | 66.4 |
| 7716 | 61.3 | 61.3 |
| 7717 | 43.4 | 43.4 |
| 7718 | 16.2 | 16.2 |
| 7719 | 0 | 0 |
| 7720 | 0 | 0 |
| 7721 | 0 | 0 |
| 7722 | 0 | 0 |
| 7723 | 0 | 0 |
| 7724 | 0 | 0 |
| 7725 | 0 | 0 |
| 7726 | 0 | 0 |
| 7727 | 0 | 0 |
| 7728 | 0 | 0 |
| 7729 | 0 | 0 |
| 7730 | 0 | 0 |
| 7731 | 0 | 0 |
| 7732 | 0 | 0 |
| 7733 | 0 | 0 |
| 7734 | 0 | 0 |
| 7735 | 0 | 0 |
| 7736 | 20 | 20 |
| 7737 | 30.8 | 30.8 |
| 7738 | 55.7 | 55.7 |
| 7739 | 57.1 | 57.1 |
| 7740 | 42.3 | 42.3 |
| 7741 | 49.9 | 49.9 |
| 7742 | 11.3 | 11.3 |
| 7743 | 0 | 0 |
| 7744 | 0 | 0 |
| 7745 | 0 | 0 |
| 7746 | 0 | 0 |
| 7747 | 0 | 0 |
| 7748 | 0 | 0 |
| 7749 | 0 | 0 |
| 7750 | 0 | 0 |
| 7751 | 0 | 0 |
| 7752 | 0 | 0 |
| 7753 | 0 | 0 |
| 7754 | 0 | 0 |
| 7755 | 0 | 0 |
| 7756 | 0 | 0 |
| 7757 | 0 | 0 |
| 7758 | 0 | 0 |
| 7759 | 0 | 0 |
| 7760 | 1.3 | 1.3 |
| 7761 | 3.3 | 3.3 |
| 7762 | 6 | 6 |
| 7763 | 7.6 | 7.6 |
| 7764 | 4 | 4 |
| 7765 | 3.1 | 3.1 |
| 7766 | 1.9 | 1.9 |
| 7767 | 0 | 0 |
| 7768 | 0 | 0 |
| 7769 | 0 | 0 |
| 7770 | 0 | 0 |
| 7771 | 0 | 0 |
| 7772 | 0 | 0 |
| 7773 | 0 | 0 |
| 7774 | 0 | 0 |
| 7775 | 0 | 0 |
| 7776 | 0 | 0 |
| 7777 | 0 | 0 |
| 7778 | 0 | 0 |
| 7779 | 0 | 0 |
| 7780 | 0 | 0 |
| 7781 | 0 | 0 |
| 7782 | 0 | 0 |
| 7783 | 0 | 0 |
| 7784 | 1.6 | 1.6 |
| 7785 | 6.7 | 6.7 |
| 7786 | 11.3 | 11.3 |
| 7787 | 33.6 | 33.6 |
| 7788 | 50.4 | 50.4 |
| 7789 | 48.1 | 48.1 |
| 7790 | 29.2 | 29.2 |
| 7791 | 0 | 0 |
| 7792 | 0 | 0 |
| 7793 | 0 | 0 |
| 7794 | 0 | 0 |
| 7795 | 0 | 0 |
| 7796 | 0 | 0 |
| 7797 | 0 | 0 |
| 7798 | 0 | 0 |
| 7799 | 0 | 0 |
| 7800 | 0 | 0 |
| 7801 | 0 | 0 |
| 7802 | 0 | 0 |
| 7803 | 0 | 0 |
| 7804 | 0 | 0 |
| 7805 | 0 | 0 |
| 7806 | 0 | 0 |
| 7807 | 0 | 0 |
| 7808 | 1 | 1 |
| 7809 | 2.4 | 2.4 |
| 7810 | 4 | 4 |
| 7811 | 4.4 | 4.4 |
| 7812 | 4.2 | 4.2 |
| 7813 | 3.7 | 3.7 |
| 7814 | 2.1 | 2.1 |
| 7815 | 0 | 0 |
| 7816 | 0 | 0 |
| 7817 | 0 | 0 |
| 7818 | 0 | 0 |
| 7819 | 0 | 0 |
| 7820 | 0 | 0 |
| 7821 | 0 | 0 |
| 7822 | 0 | 0 |
| 7823 | 0 | 0 |
| 7824 | 0 | 0 |
| 7825 | 0 | 0 |
| 7826 | 0 | 0 |
| 7827 | 0 | 0 |
| 7828 | 0 | 0 |
| 7829 | 0 | 0 |
| 7830 | 0 | 0 |
| 7831 | 0 | 0 |
| 7832 | 0.4 | 0.4 |
| 7833 | 1.1 | 1.1 |
| 7834 | 2.3 | 2.3 |
| 7835 | 2.6 | 2.6 |
| 7836 | 3.4 | 3.4 |
| 7837 | 2.8 | 2.8 |
| 7838 | 1 | 1 |
| 7839 | 0 | 0 |
| 7840 | 0 | 0 |
| 7841 | 0 | 0 |
| 7842 | 0 | 0 |
| 7843 | 0 | 0 |
| 7844 | 0 | 0 |
| 7845 | 0 | 0 |
| 7846 | 0 | 0 |
| 7847 | 0 | 0 |
| 7848 | 0 | 0 |
| 7849 | 0 | 0 |
| 7850 | 0 | 0 |
| 7851 | 0 | 0 |
| 7852 | 0 | 0 |
| 7853 | 0 | 0 |
| 7854 | 0 | 0 |
| 7855 | 0 | 0 |
| 7856 | 0 | 0 |
| 7857 | 0.9 | 0.9 |
| 7858 | 1.2 | 1.2 |
| 7859 | 2.4 | 2.4 |
| 7860 | 3.3 | 3.3 |
| 7861 | 2.6 | 2.6 |
| 7862 | 1.1 | 1.1 |
| 7863 | 0 | 0 |
| 7864 | 0 | 0 |
| 7865 | 0 | 0 |
| 7866 | 0 | 0 |
| 7867 | 0 | 0 |
| 7868 | 0 | 0 |
| 7869 | 0 | 0 |
| 7870 | 0 | 0 |
| 7871 | 0 | 0 |
| 7872 | 0 | 0 |
| 7873 | 0 | 0 |
| 7874 | 0 | 0 |
| 7875 | 0 | 0 |
| 7876 | 0 | 0 |
| 7877 | 0 | 0 |
| 7878 | 0 | 0 |
| 7879 | 0 | 0 |
| 7880 | 0 | 0 |
| 7881 | 2.8 | 2.8 |
| 7882 | 6.2 | 6.2 |
| 7883 | 7.7 | 7.7 |
| 7884 | 6.4 | 6.4 |
| 7885 | 2.8 | 2.8 |
| 7886 | 1 | 1 |
| 7887 | 0 | 0 |
| 7888 | 0 | 0 |
| 7889 | 0 | 0 |
| 7890 | 0 | 0 |
| 7891 | 0 | 0 |
| 7892 | 0 | 0 |
| 7893 | 0 | 0 |
| 7894 | 0 | 0 |
| 7895 | 0 | 0 |
| 7896 | 0 | 0 |
| 7897 | 0 | 0 |
| 7898 | 0 | 0 |
| 7899 | 0 | 0 |
| 7900 | 0 | 0 |
| 7901 | 0 | 0 |
| 7902 | 0 | 0 |
| 7903 | 0 | 0 |
| 7904 | 0 | 0 |
| 7905 | 2.1 | 2.1 |
| 7906 | 2.4 | 2.4 |
| 7907 | 3.3 | 3.3 |
| 7908 | 3.4 | 3.4 |
| 7909 | 2.7 | 2.7 |
| 7910 | 1.4 | 1.4 |
| 7911 | 0 | 0 |
| 7912 | 0 | 0 |
| 7913 | 0 | 0 |
| 7914 | 0 | 0 |
| 7915 | 0 | 0 |
| 7916 | 0 | 0 |
| 7917 | 0 | 0 |
| 7918 | 0 | 0 |
| 7919 | 0 | 0 |
| 7920 | 0 | 0 |
| 7921 | 0 | 0 |
| 7922 | 0 | 0 |
| 7923 | 0 | 0 |
| 7924 | 0 | 0 |
| 7925 | 0 | 0 |
| 7926 | 0 | 0 |
| 7927 | 0 | 0 |
| 7928 | 0 | 0 |
| 7929 | 6.8 | 6.8 |
| 7930 | 38.1 | 38.1 |
| 7931 | 26.2 | 26.2 |
| 7932 | 6.8 | 6.8 |
| 7933 | 3.4 | 3.4 |
| 7934 | 1.7 | 1.7 |
| 7935 | 0 | 0 |
| 7936 | 0 | 0 |
| 7937 | 0 | 0 |
| 7938 | 0 | 0 |
| 7939 | 0 | 0 |
| 7940 | 0 | 0 |
| 7941 | 0 | 0 |
| 7942 | 0 | 0 |
| 7943 | 0 | 0 |
| 7944 | 0 | 0 |
| 7945 | 0 | 0 |
| 7946 | 0 | 0 |
| 7947 | 0 | 0 |
| 7948 | 0 | 0 |
| 7949 | 0 | 0 |
| 7950 | 0 | 0 |
| 7951 | 0 | 0 |
| 7952 | 0 | 0 |
| 7953 | 1.3 | 1.3 |
| 7954 | 1.9 | 1.9 |
| 7955 | 2.3 | 2.3 |
| 7956 | 2.3 | 2.3 |
| 7957 | 1.9 | 1.9 |
| 7958 | 0.9 | 0.9 |
| 7959 | 0 | 0 |
| 7960 | 0 | 0 |
| 7961 | 0 | 0 |
| 7962 | 0 | 0 |
| 7963 | 0 | 0 |
| 7964 | 0 | 0 |
| 7965 | 0 | 0 |
| 7966 | 0 | 0 |
| 7967 | 0 | 0 |
| 7968 | 0 | 0 |
| 7969 | 0 | 0 |
| 7970 | 0 | 0 |
| 7971 | 0 | 0 |
| 7972 | 0 | 0 |
| 7973 | 0 | 0 |
| 7974 | 0 | 0 |
| 7975 | 0 | 0 |
| 7976 | 0 | 0 |
| 7977 | 13 | 13 |
| 7978 | 32 | 32 |
| 7979 | 29.1 | 29.1 |
| 7980 | 39.3 | 39.3 |
| 7981 | 34.6 | 34.6 |
| 7982 | 19.8 | 19.8 |
| 7983 | 0 | 0 |
| 7984 | 0 | 0 |
| 7985 | 0 | 0 |
| 7986 | 0 | 0 |
| 7987 | 0 | 0 |
| 7988 | 0 | 0 |
| 7989 | 0 | 0 |
| 7990 | 0 | 0 |
| 7991 | 0 | 0 |
| 7992 | 0 | 0 |
| 7993 | 0 | 0 |
| 7994 | 0 | 0 |
| 7995 | 0 | 0 |
| 7996 | 0 | 0 |
| 7997 | 0 | 0 |
| 7998 | 0 | 0 |
| 7999 | 0 | 0 |
| 8000 | 0 | 0 |
| 8001 | 29.9 | 29.9 |
| 8002 | 52.4 | 52.4 |
| 8003 | 60.3 | 60.3 |
| 8004 | 56.8 | 56.8 |
| 8005 | 43.8 | 43.8 |
| 8006 | 22.1 | 22.1 |
| 8007 | 0 | 0 |
| 8008 | 0 | 0 |
| 8009 | 0 | 0 |
| 8010 | 0 | 0 |
| 8011 | 0 | 0 |
| 8012 | 0 | 0 |
| 8013 | 0 | 0 |
| 8014 | 0 | 0 |
| 8015 | 0 | 0 |
| 8016 | 0 | 0 |
| 8017 | 0 | 0 |
| 8018 | 0 | 0 |
| 8019 | 0 | 0 |
| 8020 | 0 | 0 |
| 8021 | 0 | 0 |
| 8022 | 0 | 0 |
| 8023 | 0 | 0 |
| 8024 | 0 | 0 |
| 8025 | 5.2 | 5.2 |
| 8026 | 20.4 | 20.4 |
| 8027 | 22.4 | 22.4 |
| 8028 | 9.4 | 9.4 |
| 8029 | 12.1 | 12.1 |
| 8030 | 2 | 2 |
| 8031 | 0 | 0 |
| 8032 | 0 | 0 |
| 8033 | 0 | 0 |
| 8034 | 0 | 0 |
| 8035 | 0 | 0 |
| 8036 | 0 | 0 |
| 8037 | 0 | 0 |
| 8038 | 0 | 0 |
| 8039 | 0 | 0 |
| 8040 | 0 | 0 |
| 8041 | 0 | 0 |
| 8042 | 0 | 0 |
| 8043 | 0 | 0 |
| 8044 | 0 | 0 |
| 8045 | 0 | 0 |
| 8046 | 0 | 0 |
| 8047 | 0 | 0 |
| 8048 | 0 | 0 |
| 8049 | 5.9 | 5.9 |
| 8050 | 10.6 | 10.6 |
| 8051 | 18.8 | 18.8 |
| 8052 | 16.4 | 16.4 |
| 8053 | 10 | 10 |
| 8054 | 3.9 | 3.9 |
| 8055 | 0 | 0 |
| 8056 | 0 | 0 |
| 8057 | 0 | 0 |
| 8058 | 0 | 0 |
| 8059 | 0 | 0 |
| 8060 | 0 | 0 |
| 8061 | 0 | 0 |
| 8062 | 0 | 0 |
| 8063 | 0 | 0 |
| 8064 | 0 | 0 |
| 8065 | 0 | 0 |
| 8066 | 0 | 0 |
| 8067 | 0 | 0 |
| 8068 | 0 | 0 |
| 8069 | 0 | 0 |
| 8070 | 0 | 0 |
| 8071 | 0 | 0 |
| 8072 | 0 | 0 |
| 8073 | 1.6 | 1.6 |
| 8074 | 2 | 2 |
| 8075 | 2 | 2 |
| 8076 | 1.3 | 1.3 |
| 8077 | 1.3 | 1.3 |
| 8078 | 0.6 | 0.6 |
| 8079 | 0 | 0 |
| 8080 | 0 | 0 |
| 8081 | 0 | 0 |
| 8082 | 0 | 0 |
| 8083 | 0 | 0 |
| 8084 | 0 | 0 |
| 8085 | 0 | 0 |
| 8086 | 0 | 0 |
| 8087 | 0 | 0 |
| 8088 | 0 | 0 |
| 8089 | 0 | 0 |
| 8090 | 0 | 0 |
| 8091 | 0 | 0 |
| 8092 | 0 | 0 |
| 8093 | 0 | 0 |
| 8094 | 0 | 0 |
| 8095 | 0 | 0 |
| 8096 | 0 | 0 |
| 8097 | 0.6 | 0.6 |
| 8098 | 1.6 | 1.6 |
| 8099 | 2.3 | 2.3 |
| 8100 | 1.4 | 1.4 |
| 8101 | 1.1 | 1.1 |
| 8102 | 0.2 | 0.2 |
| 8103 | 0 | 0 |
| 8104 | 0 | 0 |
| 8105 | 0 | 0 |
| 8106 | 0 | 0 |
| 8107 | 0 | 0 |
| 8108 | 0 | 0 |
| 8109 | 0 | 0 |
| 8110 | 0 | 0 |
| 8111 | 0 | 0 |
| 8112 | 0 | 0 |
| 8113 | 0 | 0 |
| 8114 | 0 | 0 |
| 8115 | 0 | 0 |
| 8116 | 0 | 0 |
| 8117 | 0 | 0 |
| 8118 | 0 | 0 |
| 8119 | 0 | 0 |
| 8120 | 0 | 0 |
| 8121 | 0.6 | 0.6 |
| 8122 | 1.1 | 1.1 |
| 8123 | 0.8 | 0.8 |
| 8124 | 1.1 | 1.1 |
| 8125 | 0.8 | 0.8 |
| 8126 | 0.2 | 0.2 |
| 8127 | 0 | 0 |
| 8128 | 0 | 0 |
| 8129 | 0 | 0 |
| 8130 | 0 | 0 |
| 8131 | 0 | 0 |
| 8132 | 0 | 0 |
| 8133 | 0 | 0 |
| 8134 | 0 | 0 |
| 8135 | 0 | 0 |
| 8136 | 0 | 0 |
| 8137 | 0 | 0 |
| 8138 | 0 | 0 |
| 8139 | 0 | 0 |
| 8140 | 0 | 0 |
| 8141 | 0 | 0 |
| 8142 | 0 | 0 |
| 8143 | 0 | 0 |
| 8144 | 0 | 0 |
| 8145 | 0.3 | 0.3 |
| 8146 | 0.6 | 0.6 |
| 8147 | 1.7 | 1.7 |
| 8148 | 3.4 | 3.4 |
| 8149 | 2.3 | 2.3 |
| 8150 | 0.3 | 0.3 |
| 8151 | 0 | 0 |
| 8152 | 0 | 0 |
| 8153 | 0 | 0 |
| 8154 | 0 | 0 |
| 8155 | 0 | 0 |
| 8156 | 0 | 0 |
| 8157 | 0 | 0 |
| 8158 | 0 | 0 |
| 8159 | 0 | 0 |
| 8160 | 0 | 0 |
| 8161 | 0 | 0 |
| 8162 | 0 | 0 |
| 8163 | 0 | 0 |
| 8164 | 0 | 0 |
| 8165 | 0 | 0 |
| 8166 | 0 | 0 |
| 8167 | 0 | 0 |
| 8168 | 0 | 0 |
| 8169 | 0.2 | 0.2 |
| 8170 | 0.2 | 0.2 |
| 8171 | 0.8 | 0.8 |
| 8172 | 1 | 1 |
| 8173 | 0.6 | 0.6 |
| 8174 | 0.4 | 0.4 |
| 8175 | 0 | 0 |
| 8176 | 0 | 0 |
| 8177 | 0 | 0 |
| 8178 | 0 | 0 |
| 8179 | 0 | 0 |
| 8180 | 0 | 0 |
| 8181 | 0 | 0 |
| 8182 | 0 | 0 |
| 8183 | 0 | 0 |
| 8184 | 0 | 0 |
| 8185 | 0 | 0 |
| 8186 | 0 | 0 |
| 8187 | 0 | 0 |
| 8188 | 0 | 0 |
| 8189 | 0 | 0 |
| 8190 | 0 | 0 |
| 8191 | 0 | 0 |
| 8192 | 0 | 0 |
| 8193 | 3.2 | 3.2 |
| 8194 | 6.1 | 6.1 |
| 8195 | 23.8 | 23.8 |
| 8196 | 24.4 | 24.4 |
| 8197 | 19.4 | 19.4 |
| 8198 | 1 | 1 |
| 8199 | 0 | 0 |
| 8200 | 0 | 0 |
| 8201 | 0 | 0 |
| 8202 | 0 | 0 |
| 8203 | 0 | 0 |
| 8204 | 0 | 0 |
| 8205 | 0 | 0 |
| 8206 | 0 | 0 |
| 8207 | 0 | 0 |
| 8208 | 0 | 0 |
| 8209 | 0 | 0 |
| 8210 | 0 | 0 |
| 8211 | 0 | 0 |
| 8212 | 0 | 0 |
| 8213 | 0 | 0 |
| 8214 | 0 | 0 |
| 8215 | 0 | 0 |
| 8216 | 0 | 0 |
| 8217 | 2 | 2 |
| 8218 | 12.9 | 12.9 |
| 8219 | 7.2 | 7.2 |
| 8220 | 6.9 | 6.9 |
| 8221 | 22.1 | 22.1 |
| 8222 | 14 | 14 |
| 8223 | 0 | 0 |
| 8224 | 0 | 0 |
| 8225 | 0 | 0 |
| 8226 | 0 | 0 |
| 8227 | 0 | 0 |
| 8228 | 0 | 0 |
| 8229 | 0 | 0 |
| 8230 | 0 | 0 |
| 8231 | 0 | 0 |
| 8232 | 0 | 0 |
| 8233 | 0 | 0 |
| 8234 | 0 | 0 |
| 8235 | 0 | 0 |
| 8236 | 0 | 0 |
| 8237 | 0 | 0 |
| 8238 | 0 | 0 |
| 8239 | 0 | 0 |
| 8240 | 0 | 0 |
| 8241 | 24.1 | 24.1 |
| 8242 | 31.2 | 31.2 |
| 8243 | 28.7 | 28.7 |
| 8244 | 13.9 | 13.9 |
| 8245 | 3.4 | 3.4 |
| 8246 | 1 | 1 |
| 8247 | 0 | 0 |
| 8248 | 0 | 0 |
| 8249 | 0 | 0 |
| 8250 | 0 | 0 |
| 8251 | 0 | 0 |
| 8252 | 0 | 0 |
| 8253 | 0 | 0 |
| 8254 | 0 | 0 |
| 8255 | 0 | 0 |
| 8256 | 0 | 0 |
| 8257 | 0 | 0 |
| 8258 | 0 | 0 |
| 8259 | 0 | 0 |
| 8260 | 0 | 0 |
| 8261 | 0 | 0 |
| 8262 | 0 | 0 |
| 8263 | 0 | 0 |
| 8264 | 0 | 0 |
| 8265 | 12.4 | 12.4 |
| 8266 | 10.1 | 10.1 |
| 8267 | 29.6 | 29.6 |
| 8268 | 15.3 | 15.3 |
| 8269 | 8.8 | 8.8 |
| 8270 | 11.4 | 11.4 |
| 8271 | 0 | 0 |
| 8272 | 0 | 0 |
| 8273 | 0 | 0 |
| 8274 | 0 | 0 |
| 8275 | 0 | 0 |
| 8276 | 0 | 0 |
| 8277 | 0 | 0 |
| 8278 | 0 | 0 |
| 8279 | 0 | 0 |
| 8280 | 0 | 0 |
| 8281 | 0 | 0 |
| 8282 | 0 | 0 |
| 8283 | 0 | 0 |
| 8284 | 0 | 0 |
| 8285 | 0 | 0 |
| 8286 | 0 | 0 |
| 8287 | 0 | 0 |
| 8288 | 0 | 0 |
| 8289 | 28.6 | 28.6 |
| 8290 | 45.3 | 45.3 |
| 8291 | 52.4 | 52.4 |
| 8292 | 50.1 | 50.1 |
| 8293 | 39 | 39 |
| 8294 | 17.1 | 17.1 |
| 8295 | 0 | 0 |
| 8296 | 0 | 0 |
| 8297 | 0 | 0 |
| 8298 | 0 | 0 |
| 8299 | 0 | 0 |
| 8300 | 0 | 0 |
| 8301 | 0 | 0 |
| 8302 | 0 | 0 |
| 8303 | 0 | 0 |
| 8304 | 0 | 0 |
| 8305 | 0 | 0 |
| 8306 | 0 | 0 |
| 8307 | 0 | 0 |
| 8308 | 0 | 0 |
| 8309 | 0 | 0 |
| 8310 | 0 | 0 |
| 8311 | 0 | 0 |
| 8312 | 0 | 0 |
| 8313 | 21.9 | 21.9 |
| 8314 | 42.3 | 42.3 |
| 8315 | 49.3 | 49.3 |
| 8316 | 45.3 | 45.3 |
| 8317 | 22.2 | 22.2 |
| 8318 | 14.2 | 14.2 |
| 8319 | 0 | 0 |
| 8320 | 0 | 0 |
| 8321 | 0 | 0 |
| 8322 | 0 | 0 |
| 8323 | 0 | 0 |
| 8324 | 0 | 0 |
| 8325 | 0 | 0 |
| 8326 | 0 | 0 |
| 8327 | 0 | 0 |
| 8328 | 0 | 0 |
| 8329 | 0 | 0 |
| 8330 | 0 | 0 |
| 8331 | 0 | 0 |
| 8332 | 0 | 0 |
| 8333 | 0 | 0 |
| 8334 | 0 | 0 |
| 8335 | 0 | 0 |
| 8336 | 0 | 0 |
| 8337 | 1.1 | 1.1 |
| 8338 | 2.3 | 2.3 |
| 8339 | 3.2 | 3.2 |
| 8340 | 5.9 | 5.9 |
| 8341 | 4.4 | 4.4 |
| 8342 | 3.1 | 3.1 |
| 8343 | 0 | 0 |
| 8344 | 0 | 0 |
| 8345 | 0 | 0 |
| 8346 | 0 | 0 |
| 8347 | 0 | 0 |
| 8348 | 0 | 0 |
| 8349 | 0 | 0 |
| 8350 | 0 | 0 |
| 8351 | 0 | 0 |
| 8352 | 0 | 0 |
| 8353 | 0 | 0 |
| 8354 | 0 | 0 |
| 8355 | 0 | 0 |
| 8356 | 0 | 0 |
| 8357 | 0 | 0 |
| 8358 | 0 | 0 |
| 8359 | 0 | 0 |
| 8360 | 0 | 0 |
| 8361 | 1.7 | 1.7 |
| 8362 | 5.4 | 5.4 |
| 8363 | 42.9 | 42.9 |
| 8364 | 49.3 | 49.3 |
| 8365 | 38.9 | 38.9 |
| 8366 | 17.9 | 17.9 |
| 8367 | 0 | 0 |
| 8368 | 0 | 0 |
| 8369 | 0 | 0 |
| 8370 | 0 | 0 |
| 8371 | 0 | 0 |
| 8372 | 0 | 0 |
| 8373 | 0 | 0 |
| 8374 | 0 | 0 |
| 8375 | 0 | 0 |
| 8376 | 0 | 0 |
| 8377 | 0 | 0 |
| 8378 | 0 | 0 |
| 8379 | 0 | 0 |
| 8380 | 0 | 0 |
| 8381 | 0 | 0 |
| 8382 | 0 | 0 |
| 8383 | 0 | 0 |
| 8384 | 0 | 0 |
| 8385 | 5 | 5 |
| 8386 | 6.4 | 6.4 |
| 8387 | 6.6 | 6.6 |
| 8388 | 5.4 | 5.4 |
| 8389 | 3.3 | 3.3 |
| 8390 | 1.1 | 1.1 |
| 8391 | 0 | 0 |
| 8392 | 0 | 0 |
| 8393 | 0 | 0 |
| 8394 | 0 | 0 |
| 8395 | 0 | 0 |
| 8396 | 0 | 0 |
| 8397 | 0 | 0 |
| 8398 | 0 | 0 |
| 8399 | 0 | 0 |
| 8400 | 0 | 0 |
| 8401 | 0 | 0 |
| 8402 | 0 | 0 |
| 8403 | 0 | 0 |
| 8404 | 0 | 0 |
| 8405 | 0 | 0 |
| 8406 | 0 | 0 |
| 8407 | 0 | 0 |
| 8408 | 0 | 0 |
| 8409 | 24.3 | 24.3 |
| 8410 | 36.9 | 36.9 |
| 8411 | 45.6 | 45.6 |
| 8412 | 46.3 | 46.3 |
| 8413 | 35.3 | 35.3 |
| 8414 | 14 | 14 |
| 8415 | 0 | 0 |
| 8416 | 0 | 0 |
| 8417 | 0 | 0 |
| 8418 | 0 | 0 |
| 8419 | 0 | 0 |
| 8420 | 0 | 0 |
| 8421 | 0 | 0 |
| 8422 | 0 | 0 |
| 8423 | 0 | 0 |
| 8424 | 0 | 0 |
| 8425 | 0 | 0 |
| 8426 | 0 | 0 |
| 8427 | 0 | 0 |
| 8428 | 0 | 0 |
| 8429 | 0 | 0 |
| 8430 | 0 | 0 |
| 8431 | 0 | 0 |
| 8432 | 0 | 0 |
| 8433 | 1.8 | 1.8 |
| 8434 | 4.6 | 4.6 |
| 8435 | 5.1 | 5.1 |
| 8436 | 21.4 | 21.4 |
| 8437 | 22.3 | 22.3 |
| 8438 | 16.4 | 16.4 |
| 8439 | 0 | 0 |
| 8440 | 0 | 0 |
| 8441 | 0 | 0 |
| 8442 | 0 | 0 |
| 8443 | 0 | 0 |
| 8444 | 0 | 0 |
| 8445 | 0 | 0 |
| 8446 | 0 | 0 |
| 8447 | 0 | 0 |
| 8448 | 0 | 0 |
| 8449 | 0 | 0 |
| 8450 | 0 | 0 |
| 8451 | 0 | 0 |
| 8452 | 0 | 0 |
| 8453 | 0 | 0 |
| 8454 | 0 | 0 |
| 8455 | 0 | 0 |
| 8456 | 0 | 0 |
| 8457 | 21.4 | 21.4 |
| 8458 | 38.7 | 38.7 |
| 8459 | 29.3 | 29.3 |
| 8460 | 23.6 | 23.6 |
| 8461 | 3.7 | 3.7 |
| 8462 | 1.2 | 1.2 |
| 8463 | 0 | 0 |
| 8464 | 0 | 0 |
| 8465 | 0 | 0 |
| 8466 | 0 | 0 |
| 8467 | 0 | 0 |
| 8468 | 0 | 0 |
| 8469 | 0 | 0 |
| 8470 | 0 | 0 |
| 8471 | 0 | 0 |
| 8472 | 0 | 0 |
| 8473 | 0 | 0 |
| 8474 | 0 | 0 |
| 8475 | 0 | 0 |
| 8476 | 0 | 0 |
| 8477 | 0 | 0 |
| 8478 | 0 | 0 |
| 8479 | 0 | 0 |
| 8480 | 0 | 0 |
| 8481 | 1.4 | 1.4 |
| 8482 | 3.6 | 3.6 |
| 8483 | 4.3 | 4.3 |
| 8484 | 5.3 | 5.3 |
| 8485 | 5.1 | 5.1 |
| 8486 | 1.3 | 1.3 |
| 8487 | 0 | 0 |
| 8488 | 0 | 0 |
| 8489 | 0 | 0 |
| 8490 | 0 | 0 |
| 8491 | 0 | 0 |
| 8492 | 0 | 0 |
| 8493 | 0 | 0 |
| 8494 | 0 | 0 |
| 8495 | 0 | 0 |
| 8496 | 0 | 0 |
| 8497 | 0 | 0 |
| 8498 | 0 | 0 |
| 8499 | 0 | 0 |
| 8500 | 0 | 0 |
| 8501 | 0 | 0 |
| 8502 | 0 | 0 |
| 8503 | 0 | 0 |
| 8504 | 0 | 0 |
| 8505 | 1.1 | 1.1 |
| 8506 | 3.8 | 3.8 |
| 8507 | 5.4 | 5.4 |
| 8508 | 6.3 | 6.3 |
| 8509 | 4.8 | 4.8 |
| 8510 | 2.4 | 2.4 |
| 8511 | 0 | 0 |
| 8512 | 0 | 0 |
| 8513 | 0 | 0 |
| 8514 | 0 | 0 |
| 8515 | 0 | 0 |
| 8516 | 0 | 0 |
| 8517 | 0 | 0 |
| 8518 | 0 | 0 |
| 8519 | 0 | 0 |
| 8520 | 0 | 0 |
| 8521 | 0 | 0 |
| 8522 | 0 | 0 |
| 8523 | 0 | 0 |
| 8524 | 0 | 0 |
| 8525 | 0 | 0 |
| 8526 | 0 | 0 |
| 8527 | 0 | 0 |
| 8528 | 0 | 0 |
| 8529 | 1 | 1 |
| 8530 | 2.4 | 2.4 |
| 8531 | 3 | 3 |
| 8532 | 3 | 3 |
| 8533 | 1.8 | 1.8 |
| 8534 | 0.7 | 0.7 |
| 8535 | 0 | 0 |
| 8536 | 0 | 0 |
| 8537 | 0 | 0 |
| 8538 | 0 | 0 |
| 8539 | 0 | 0 |
| 8540 | 0 | 0 |
| 8541 | 0 | 0 |
| 8542 | 0 | 0 |
| 8543 | 0 | 0 |
| 8544 | 0 | 0 |
| 8545 | 0 | 0 |
| 8546 | 0 | 0 |
| 8547 | 0 | 0 |
| 8548 | 0 | 0 |
| 8549 | 0 | 0 |
| 8550 | 0 | 0 |
| 8551 | 0 | 0 |
| 8552 | 0 | 0 |
| 8553 | 2.4 | 2.4 |
| 8554 | 6.1 | 6.1 |
| 8555 | 6.9 | 6.9 |
| 8556 | 6.8 | 6.8 |
| 8557 | 3.1 | 3.1 |
| 8558 | 0.7 | 0.7 |
| 8559 | 0 | 0 |
| 8560 | 0 | 0 |
| 8561 | 0 | 0 |
| 8562 | 0 | 0 |
| 8563 | 0 | 0 |
| 8564 | 0 | 0 |
| 8565 | 0 | 0 |
| 8566 | 0 | 0 |
| 8567 | 0 | 0 |
| 8568 | 0 | 0 |
| 8569 | 0 | 0 |
| 8570 | 0 | 0 |
| 8571 | 0 | 0 |
| 8572 | 0 | 0 |
| 8573 | 0 | 0 |
| 8574 | 0 | 0 |
| 8575 | 0 | 0 |
| 8576 | 0 | 0 |
| 8577 | 1.1 | 1.1 |
| 8578 | 5.3 | 5.3 |
| 8579 | 5.4 | 5.4 |
| 8580 | 6.4 | 6.4 |
| 8581 | 35 | 35 |
| 8582 | 19.3 | 19.3 |
| 8583 | 0 | 0 |
| 8584 | 0 | 0 |
| 8585 | 0 | 0 |
| 8586 | 0 | 0 |
| 8587 | 0 | 0 |
| 8588 | 0 | 0 |
| 8589 | 0 | 0 |
| 8590 | 0 | 0 |
| 8591 | 0 | 0 |
| 8592 | 0 | 0 |
| 8593 | 0 | 0 |
| 8594 | 0 | 0 |
| 8595 | 0 | 0 |
| 8596 | 0 | 0 |
| 8597 | 0 | 0 |
| 8598 | 0 | 0 |
| 8599 | 0 | 0 |
| 8600 | 0 | 0 |
| 8601 | 22.3 | 22.3 |
| 8602 | 41.3 | 41.3 |
| 8603 | 49.8 | 49.8 |
| 8604 | 49 | 49 |
| 8605 | 39.6 | 39.6 |
| 8606 | 7 | 7 |
| 8607 | 0 | 0 |
| 8608 | 0 | 0 |
| 8609 | 0 | 0 |
| 8610 | 0 | 0 |
| 8611 | 0 | 0 |
| 8612 | 0 | 0 |
| 8613 | 0 | 0 |
| 8614 | 0 | 0 |
| 8615 | 0 | 0 |
| 8616 | 0 | 0 |
| 8617 | 0 | 0 |
| 8618 | 0 | 0 |
| 8619 | 0 | 0 |
| 8620 | 0 | 0 |
| 8621 | 0 | 0 |
| 8622 | 0 | 0 |
| 8623 | 0 | 0 |
| 8624 | 0 | 0 |
| 8625 | 1 | 1 |
| 8626 | 2 | 2 |
| 8627 | 3.9 | 3.9 |
| 8628 | 3.3 | 3.3 |
| 8629 | 1.9 | 1.9 |
| 8630 | 0.4 | 0.4 |
| 8631 | 0 | 0 |
| 8632 | 0 | 0 |
| 8633 | 0 | 0 |
| 8634 | 0 | 0 |
| 8635 | 0 | 0 |
| 8636 | 0 | 0 |
| 8637 | 0 | 0 |
| 8638 | 0 | 0 |
| 8639 | 0 | 0 |
| 8640 | 0 | 0 |
| 8641 | 0 | 0 |
| 8642 | 0 | 0 |
| 8643 | 0 | 0 |
| 8644 | 0 | 0 |
| 8645 | 0 | 0 |
| 8646 | 0 | 0 |
| 8647 | 0 | 0 |
| 8648 | 0 | 0 |
| 8649 | 0.3 | 0.3 |
| 8650 | 1 | 1 |
| 8651 | 1.7 | 1.7 |
| 8652 | 2.1 | 2.1 |
| 8653 | 1.9 | 1.9 |
| 8654 | 0.7 | 0.7 |
| 8655 | 0 | 0 |
| 8656 | 0 | 0 |
| 8657 | 0 | 0 |
| 8658 | 0 | 0 |
| 8659 | 0 | 0 |
| 8660 | 0 | 0 |
| 8661 | 0 | 0 |
| 8662 | 0 | 0 |
| 8663 | 0 | 0 |
| 8664 | 0 | 0 |
| 8665 | 0 | 0 |
| 8666 | 0 | 0 |
| 8667 | 0 | 0 |
| 8668 | 0 | 0 |
| 8669 | 0 | 0 |
| 8670 | 0 | 0 |
| 8671 | 0 | 0 |
| 8672 | 0 | 0 |
| 8673 | 1.6 | 1.6 |
| 8674 | 5.3 | 5.3 |
| 8675 | 4.1 | 4.1 |
| 8676 | 3.8 | 3.8 |
| 8677 | 3.7 | 3.7 |
| 8678 | 1.3 | 1.3 |
| 8679 | 0 | 0 |
| 8680 | 0 | 0 |
| 8681 | 0 | 0 |
| 8682 | 0 | 0 |
| 8683 | 0 | 0 |
| 8684 | 0 | 0 |
| 8685 | 0 | 0 |
| 8686 | 0 | 0 |
| 8687 | 0 | 0 |
| 8688 | 0 | 0 |
| 8689 | 0 | 0 |
| 8690 | 0 | 0 |
| 8691 | 0 | 0 |
| 8692 | 0 | 0 |
| 8693 | 0 | 0 |
| 8694 | 0 | 0 |
| 8695 | 0 | 0 |
| 8696 | 0 | 0 |
| 8697 | 0.9 | 0.9 |
| 8698 | 1.9 | 1.9 |
| 8699 | 2.4 | 2.4 |
| 8700 | 3.3 | 3.3 |
| 8701 | 1.7 | 1.7 |
| 8702 | 0.7 | 0.7 |
| 8703 | 0 | 0 |
| 8704 | 0 | 0 |
| 8705 | 0 | 0 |
| 8706 | 0 | 0 |
| 8707 | 0 | 0 |
| 8708 | 0 | 0 |
| 8709 | 0 | 0 |
| 8710 | 0 | 0 |
| 8711 | 0 | 0 |
| 8712 | 0 | 0 |
| 8713 | 0 | 0 |
| 8714 | 0 | 0 |
| 8715 | 0 | 0 |
| 8716 | 0 | 0 |
| 8717 | 0 | 0 |
| 8718 | 0 | 0 |
| 8719 | 0 | 0 |
| 8720 | 0 | 0 |
| 8721 | 2.3 | 2.3 |
| 8722 | 5.3 | 5.3 |
| 8723 | 16.3 | 16.3 |
| 8724 | 6.9 | 6.9 |
| 8725 | 5.2 | 5.2 |
| 8726 | 3.7 | 3.7 |
| 8727 | 0 | 0 |
| 8728 | 0 | 0 |
| 8729 | 0 | 0 |
| 8730 | 0 | 0 |
| 8731 | 0 | 0 |
| 8732 | 0 | 0 |
| 8733 | 0 | 0 |
| 8734 | 0 | 0 |
| 8735 | 0 | 0 |
| 8736 | 0 | 0 |
| 8737 | 0 | 0 |
| 8738 | 0 | 0 |
| 8739 | 0 | 0 |
| 8740 | 0 | 0 |
| 8741 | 0 | 0 |
| 8742 | 0 | 0 |
| 8743 | 0 | 0 |
| 8744 | 0 | 0 |
| 8745 | 1.1 | 1.1 |
| 8746 | 2.4 | 2.4 |
| 8747 | 3.7 | 3.7 |
| 8748 | 2.2 | 2.2 |
| 8749 | 1.9 | 1.9 |
| 8750 | 1.2 | 1.2 |
| 8751 | 0 | 0 |
| 8752 | 0 | 0 |
| 8753 | 0 | 0 |
| 8754 | 0 | 0 |
| 8755 | 0 | 0 |
| 8756 | 0 | 0 |
| 8757 | 0 | 0 |
| 8758 | 0 | 0 |
| 8759 | 0 | 0 |